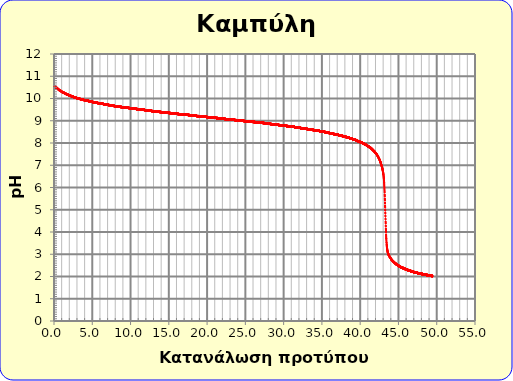
| Category | pH  |
|---|---|
| 0.0 | 10.567 |
| 0.013203698474220555 | 10.562 |
| 0.02640584125623714 | 10.557 |
| 0.039606428346038954 | 10.552 |
| 0.052805459743615196 | 10.552 |
| 0.06600293544895505 | 10.547 |
| 0.07919885546204772 | 10.547 |
| 0.0923932197828824 | 10.541 |
| 0.10558602841144826 | 10.547 |
| 0.11877728134773449 | 10.536 |
| 0.1319669785917303 | 10.536 |
| 0.1451551201434248 | 10.531 |
| 0.15834170600280723 | 10.536 |
| 0.17152673616986674 | 10.526 |
| 0.1847102106445925 | 10.526 |
| 0.19789212942697368 | 10.521 |
| 0.21107249251699944 | 10.521 |
| 0.22425129991465897 | 10.516 |
| 0.23742855161994142 | 10.511 |
| 0.25060424763283595 | 10.506 |
| 0.2637783879533317 | 10.5 |
| 0.2769509725814178 | 10.5 |
| 0.29012200151708345 | 10.5 |
| 0.30329147476031776 | 10.495 |
| 0.3164593923111099 | 10.485 |
| 0.32962575416944906 | 10.49 |
| 0.3427905603353243 | 10.48 |
| 0.35595381080872474 | 10.485 |
| 0.36911550558963957 | 10.475 |
| 0.3822756446780579 | 10.475 |
| 0.39543422807396894 | 10.465 |
| 0.4085912557773617 | 10.47 |
| 0.4217467277882254 | 10.465 |
| 0.4349006441065491 | 10.454 |
| 0.44805300473232196 | 10.454 |
| 0.46120380966553304 | 10.444 |
| 0.4743530589061715 | 10.449 |
| 0.48750075245422647 | 10.439 |
| 0.500646890309687 | 10.434 |
| 0.5137914724725423 | 10.439 |
| 0.5269344989427813 | 10.429 |
| 0.5400759697203933 | 10.429 |
| 0.5532158848053672 | 10.418 |
| 0.5663542441976923 | 10.418 |
| 0.5794910478973576 | 10.413 |
| 0.5926262959043522 | 10.413 |
| 0.6057599882186652 | 10.413 |
| 0.6188921248402856 | 10.403 |
| 0.6320227057692025 | 10.403 |
| 0.6451517310054051 | 10.398 |
| 0.6582792005488824 | 10.403 |
| 0.6714051143996236 | 10.398 |
| 0.6845294725576175 | 10.393 |
| 0.6976522750228534 | 10.393 |
| 0.7107735217953203 | 10.383 |
| 0.7238932128750072 | 10.383 |
| 0.7370113482619033 | 10.377 |
| 0.7501279279559975 | 10.372 |
| 0.763242951957279 | 10.372 |
| 0.7763564202657368 | 10.372 |
| 0.78946833288136 | 10.362 |
| 0.8025786898041375 | 10.362 |
| 0.8156874910340585 | 10.362 |
| 0.8287947365711119 | 10.357 |
| 0.841900426415287 | 10.357 |
| 0.8550045605665726 | 10.352 |
| 0.8681071390249578 | 10.347 |
| 0.8812081617904317 | 10.342 |
| 0.8943076288629832 | 10.342 |
| 0.9074055402426014 | 10.336 |
| 0.9205018959292754 | 10.336 |
| 0.9335966959229942 | 10.331 |
| 0.9466899402237468 | 10.331 |
| 0.9597816288315221 | 10.331 |
| 0.9728717617463092 | 10.321 |
| 0.9859603389680972 | 10.321 |
| 0.999047360496875 | 10.316 |
| 1.0121328263326317 | 10.311 |
| 1.0252167364753562 | 10.311 |
| 1.0382990909250376 | 10.311 |
| 1.0513798896816648 | 10.306 |
| 1.0644591327452269 | 10.306 |
| 1.0775368201157127 | 10.301 |
| 1.0906129517931116 | 10.301 |
| 1.1036875277774123 | 10.295 |
| 1.1167605480686038 | 10.295 |
| 1.129832012666675 | 10.29 |
| 1.142901921571615 | 10.285 |
| 1.1559702747834129 | 10.29 |
| 1.1690370723020573 | 10.285 |
| 1.1821023141275375 | 10.29 |
| 1.1951660002598425 | 10.285 |
| 1.2082281306989613 | 10.28 |
| 1.2212887054448827 | 10.28 |
| 1.2343477244975956 | 10.275 |
| 1.247405187857089 | 10.28 |
| 1.260461095523352 | 10.27 |
| 1.2735154474963735 | 10.27 |
| 1.2865682437761423 | 10.265 |
| 1.2996194843626476 | 10.265 |
| 1.312669169255878 | 10.26 |
| 1.3257172984558228 | 10.26 |
| 1.3387638719624708 | 10.26 |
| 1.351808889775811 | 10.26 |
| 1.3648523518958322 | 10.26 |
| 1.3778942583225235 | 10.249 |
| 1.3909346090558738 | 10.249 |
| 1.403973404095872 | 10.249 |
| 1.417010643442507 | 10.239 |
| 1.4300463270957675 | 10.239 |
| 1.4430804550556429 | 10.244 |
| 1.4561130273221217 | 10.244 |
| 1.469144043895193 | 10.239 |
| 1.4821735047748459 | 10.239 |
| 1.4952014099610689 | 10.229 |
| 1.5082277594538511 | 10.229 |
| 1.5212525532531815 | 10.224 |
| 1.534275791359049 | 10.229 |
| 1.5472974737714424 | 10.224 |
| 1.5603176004903507 | 10.219 |
| 1.5733361715157628 | 10.219 |
| 1.5863531868476675 | 10.219 |
| 1.5993686464860535 | 10.213 |
| 1.61238255043091 | 10.213 |
| 1.6253948986822258 | 10.208 |
| 1.6384056912399896 | 10.208 |
| 1.6514149281041905 | 10.208 |
| 1.6644226092748173 | 10.203 |
| 1.677428734751859 | 10.203 |
| 1.6904333045353044 | 10.198 |
| 1.7034363186251422 | 10.193 |
| 1.7164377770213615 | 10.203 |
| 1.729437679723951 | 10.193 |
| 1.7424360267328998 | 10.193 |
| 1.7554328180481964 | 10.188 |
| 1.7684280536698298 | 10.188 |
| 1.7814217335977889 | 10.183 |
| 1.7944138578320625 | 10.183 |
| 1.8074044263726396 | 10.188 |
| 1.820393439219509 | 10.178 |
| 1.8333808963726592 | 10.183 |
| 1.8463667978320795 | 10.178 |
| 1.8593511435977585 | 10.178 |
| 1.8723339336696851 | 10.178 |
| 1.8853151680478482 | 10.167 |
| 1.8982948467322365 | 10.167 |
| 1.9112729697228388 | 10.162 |
| 1.924249537019644 | 10.162 |
| 1.937224548622641 | 10.162 |
| 1.9501980045318184 | 10.162 |
| 1.9631699047471651 | 10.162 |
| 1.9761402492686702 | 10.157 |
| 1.9891090380963221 | 10.152 |
| 2.0020762712301097 | 10.152 |
| 2.015041948670022 | 10.157 |
| 2.028006070416048 | 10.152 |
| 2.040968636468176 | 10.147 |
| 2.053929646826395 | 10.147 |
| 2.0668891014906934 | 10.147 |
| 2.0798470004610605 | 10.147 |
| 2.092803343737485 | 10.147 |
| 2.1057581313199556 | 10.137 |
| 2.1187113632084613 | 10.137 |
| 2.1316630394029907 | 10.131 |
| 2.1446131599035323 | 10.137 |
| 2.1575617247100753 | 10.137 |
| 2.1705087338226083 | 10.126 |
| 2.18345418724112 | 10.131 |
| 2.1963980849655997 | 10.121 |
| 2.2093404269960355 | 10.121 |
| 2.2222812133324163 | 10.121 |
| 2.2352204439747307 | 10.121 |
| 2.248158118922968 | 10.121 |
| 2.2610942381771166 | 10.116 |
| 2.2740288017371655 | 10.116 |
| 2.286961809603103 | 10.111 |
| 2.299893261774918 | 10.111 |
| 2.3128231582525998 | 10.111 |
| 2.3257514990361363 | 10.116 |
| 2.3386782841255167 | 10.111 |
| 2.3516035135207294 | 10.106 |
| 2.3645271872217637 | 10.111 |
| 2.3774493052286076 | 10.106 |
| 2.3903698675412506 | 10.101 |
| 2.403288874159681 | 10.101 |
| 2.4162063250838877 | 10.095 |
| 2.429122220313859 | 10.095 |
| 2.4420365598495843 | 10.095 |
| 2.4549493436910517 | 10.09 |
| 2.46786057183825 | 10.09 |
| 2.4807702442911683 | 10.09 |
| 2.493678361049795 | 10.095 |
| 2.5065849221141185 | 10.085 |
| 2.5194899274841283 | 10.085 |
| 2.532393377159812 | 10.085 |
| 2.5452952711411596 | 10.08 |
| 2.5581956094281586 | 10.085 |
| 2.5710943920207985 | 10.085 |
| 2.5839916189190677 | 10.075 |
| 2.5968872901229547 | 10.08 |
| 2.6097814056324484 | 10.08 |
| 2.6226739654475377 | 10.075 |
| 2.6355649695682106 | 10.07 |
| 2.6484544179944565 | 10.075 |
| 2.6613423107262637 | 10.07 |
| 2.674228647763621 | 10.065 |
| 2.6871134291065166 | 10.065 |
| 2.6999966547549397 | 10.07 |
| 2.712878324708879 | 10.065 |
| 2.7257584389683225 | 10.065 |
| 2.7386369975332596 | 10.065 |
| 2.7515140004036787 | 10.06 |
| 2.7643894475795685 | 10.055 |
| 2.7772633390609176 | 10.055 |
| 2.7901356748477144 | 10.055 |
| 2.803006454939948 | 10.049 |
| 2.8158756793376063 | 10.055 |
| 2.8287433480406787 | 10.055 |
| 2.8416094610491536 | 10.049 |
| 2.8544740183630193 | 10.049 |
| 2.8673370199822648 | 10.049 |
| 2.8801984659068784 | 10.049 |
| 2.8930583561368493 | 10.044 |
| 2.9059166906721656 | 10.039 |
| 2.918773469512816 | 10.039 |
| 2.9316286926587893 | 10.039 |
| 2.944482360110074 | 10.044 |
| 2.9573344718666585 | 10.039 |
| 2.970185027928532 | 10.034 |
| 2.983034028295682 | 10.034 |
| 2.9958814729680983 | 10.034 |
| 3.008727361945769 | 10.029 |
| 3.0215716952286824 | 10.029 |
| 3.0344144728168274 | 10.029 |
| 3.0472556947101923 | 10.024 |
| 3.060095360908766 | 10.034 |
| 3.072933471412537 | 10.029 |
| 3.085770026221494 | 10.024 |
| 3.098605025335625 | 10.029 |
| 3.1114384687549195 | 10.019 |
| 3.1242703564793657 | 10.019 |
| 3.137100688508952 | 10.024 |
| 3.149929464843667 | 10.024 |
| 3.162756685483499 | 10.024 |
| 3.1755823504284373 | 10.014 |
| 3.1884064596784696 | 10.014 |
| 3.201229013233585 | 10.014 |
| 3.214050011093772 | 10.014 |
| 3.226869453259019 | 10.008 |
| 3.2396873397293144 | 10.008 |
| 3.2525036705046473 | 10.008 |
| 3.265318445585006 | 10.003 |
| 3.2781316649703784 | 10.003 |
| 3.2909433286607537 | 10.003 |
| 3.3037534366561205 | 10.003 |
| 3.316561988956467 | 10.003 |
| 3.329368985561782 | 10.003 |
| 3.3421744264720536 | 10.003 |
| 3.3549783116872707 | 9.998 |
| 3.3677806412074216 | 9.998 |
| 3.380581415032495 | 9.993 |
| 3.3933806331624794 | 9.993 |
| 3.406178295597363 | 9.993 |
| 3.4189744023371347 | 9.993 |
| 3.431768953381783 | 9.988 |
| 3.444561948731296 | 9.998 |
| 3.4573533883856626 | 9.993 |
| 3.4701432723448713 | 9.988 |
| 3.4829316006089104 | 9.993 |
| 3.4957183731777683 | 9.988 |
| 3.5085035900514336 | 9.988 |
| 3.5212872512298947 | 9.983 |
| 3.53406935671314 | 9.983 |
| 3.5468499065011585 | 9.983 |
| 3.559628900593938 | 9.978 |
| 3.5724063389914673 | 9.978 |
| 3.585182221693735 | 9.988 |
| 3.5979565487007292 | 9.978 |
| 3.610729320012439 | 9.973 |
| 3.623500535628852 | 9.973 |
| 3.6362701955499572 | 9.973 |
| 3.649038299775743 | 9.978 |
| 3.661804848306198 | 9.973 |
| 3.67456984114131 | 9.967 |
| 3.687333278281068 | 9.973 |
| 3.7000951597254605 | 9.973 |
| 3.712855485474476 | 9.967 |
| 3.7256142555281024 | 9.967 |
| 3.738371469886329 | 9.967 |
| 3.751127128549143 | 9.967 |
| 3.763881231516534 | 9.962 |
| 3.7766337787884896 | 9.962 |
| 3.789384770364999 | 9.962 |
| 3.80213420624605 | 9.957 |
| 3.8148820864316315 | 9.957 |
| 3.8276284109217316 | 9.962 |
| 3.8403731797163383 | 9.957 |
| 3.8531163928154406 | 9.952 |
| 3.865858050219027 | 9.952 |
| 3.8785981519270853 | 9.952 |
| 3.8913366979396047 | 9.952 |
| 3.904073688256573 | 9.952 |
| 3.9168091228779787 | 9.952 |
| 3.92954300180381 | 9.947 |
| 3.942275325034056 | 9.952 |
| 3.9550060925687047 | 9.947 |
| 3.967735304407744 | 9.942 |
| 3.980462960551163 | 9.952 |
| 3.99318906099895 | 9.947 |
| 4.0059136057510925 | 9.942 |
| 4.01863659480758 | 9.947 |
| 4.0313580281684 | 9.937 |
| 4.044077905833541 | 9.942 |
| 4.056796227802993 | 9.942 |
| 4.069512994076742 | 9.942 |
| 4.082228204654778 | 9.937 |
| 4.094941859537088 | 9.942 |
| 4.107653958723661 | 9.937 |
| 4.120364502214486 | 9.931 |
| 4.133073490009551 | 9.931 |
| 4.145780922108844 | 9.931 |
| 4.158486798512353 | 9.931 |
| 4.171191119220067 | 9.937 |
| 4.183893884231974 | 9.931 |
| 4.196595093548063 | 9.931 |
| 4.209294747168321 | 9.926 |
| 4.221992845092737 | 9.926 |
| 4.2346893873213 | 9.921 |
| 4.247384373853998 | 9.926 |
| 4.260077804690819 | 9.926 |
| 4.272769679831751 | 9.921 |
| 4.285459999276783 | 9.916 |
| 4.298148763025902 | 9.921 |
| 4.310835971079099 | 9.921 |
| 4.32352162343636 | 9.916 |
| 4.336205720097674 | 9.916 |
| 4.348888261063029 | 9.916 |
| 4.361569246332413 | 9.911 |
| 4.3742486759058155 | 9.911 |
| 4.386926549783224 | 9.916 |
| 4.399602867964627 | 9.916 |
| 4.412277630450013 | 9.911 |
| 4.424950837239369 | 9.906 |
| 4.437622488332685 | 9.906 |
| 4.450292583729948 | 9.911 |
| 4.462961123431147 | 9.911 |
| 4.47562810743627 | 9.901 |
| 4.4882935357453055 | 9.911 |
| 4.500957408358242 | 9.906 |
| 4.513619725275067 | 9.901 |
| 4.526280486495769 | 9.906 |
| 4.538939692020336 | 9.906 |
| 4.551597341848757 | 9.901 |
| 4.56425343598102 | 9.906 |
| 4.5769079744171135 | 9.896 |
| 4.589560957157025 | 9.896 |
| 4.602212384200743 | 9.896 |
| 4.614862255548256 | 9.89 |
| 4.627510571199552 | 9.89 |
| 4.640157331154619 | 9.896 |
| 4.6528025354134455 | 9.89 |
| 4.66544618397602 | 9.89 |
| 4.678088276842331 | 9.885 |
| 4.690728814012366 | 9.89 |
| 4.7033677954861135 | 9.885 |
| 4.716005221263561 | 9.885 |
| 4.728641091344698 | 9.885 |
| 4.741275405729511 | 9.885 |
| 4.75390816441799 | 9.885 |
| 4.766539367410123 | 9.88 |
| 4.7791690147058965 | 9.88 |
| 4.7917971063053 | 9.885 |
| 4.804423642208323 | 9.88 |
| 4.817048622414951 | 9.88 |
| 4.829672046925174 | 9.875 |
| 4.84229391573898 | 9.88 |
| 4.854914228856357 | 9.88 |
| 4.8675329862772925 | 9.875 |
| 4.8801501880017755 | 9.87 |
| 4.8927658340297935 | 9.87 |
| 4.905379924361335 | 9.875 |
| 4.917992458996388 | 9.87 |
| 4.930603437934941 | 9.87 |
| 4.943212861176982 | 9.87 |
| 4.955820728722499 | 9.87 |
| 4.9684270405714805 | 9.865 |
| 4.981031796723915 | 9.865 |
| 4.9936349971797895 | 9.865 |
| 5.006236641939093 | 9.87 |
| 5.018836731001814 | 9.865 |
| 5.03143526436794 | 9.87 |
| 5.044032242037459 | 9.86 |
| 5.056627664010359 | 9.86 |
| 5.0692215302866295 | 9.865 |
| 5.081813840866257 | 9.86 |
| 5.09440459574923 | 9.855 |
| 5.106993794935537 | 9.86 |
| 5.119581438425166 | 9.855 |
| 5.132167526218105 | 9.855 |
| 5.144752058314342 | 9.855 |
| 5.157335034713866 | 9.855 |
| 5.169916455416664 | 9.86 |
| 5.182496320422725 | 9.855 |
| 5.195074629732036 | 9.855 |
| 5.2076513833445865 | 9.85 |
| 5.220226581260364 | 9.85 |
| 5.232800223479356 | 9.85 |
| 5.245372310001551 | 9.844 |
| 5.257942840826938 | 9.85 |
| 5.270511815955503 | 9.85 |
| 5.283079235387236 | 9.844 |
| 5.295645099122124 | 9.85 |
| 5.308209407160156 | 9.839 |
| 5.3207721595013195 | 9.839 |
| 5.333333356145602 | 9.839 |
| 5.345892997092993 | 9.85 |
| 5.358451082343479 | 9.839 |
| 5.371007611897049 | 9.839 |
| 5.383562585753691 | 9.839 |
| 5.396116003913393 | 9.839 |
| 5.408667866376144 | 9.844 |
| 5.42121817314193 | 9.839 |
| 5.433766924210739 | 9.834 |
| 5.446314119582562 | 9.834 |
| 5.458859759257384 | 9.834 |
| 5.471403843235195 | 9.839 |
| 5.483946371515982 | 9.829 |
| 5.496487344099733 | 9.839 |
| 5.509026760986436 | 9.834 |
| 5.52156462217608 | 9.829 |
| 5.534100927668653 | 9.829 |
| 5.546635677464141 | 9.829 |
| 5.559168871562534 | 9.829 |
| 5.5717005099638195 | 9.824 |
| 5.584230592667986 | 9.829 |
| 5.59675911967502 | 9.829 |
| 5.60928609098491 | 9.824 |
| 5.621811506597646 | 9.819 |
| 5.634335366513214 | 9.824 |
| 5.646857670731602 | 9.819 |
| 5.659378419252798 | 9.824 |
| 5.6718976120767906 | 9.824 |
| 5.6844152492035676 | 9.819 |
| 5.6969313306331175 | 9.819 |
| 5.709445856365428 | 9.819 |
| 5.721958826400487 | 9.819 |
| 5.734470240738282 | 9.819 |
| 5.746980099378801 | 9.814 |
| 5.759488402322033 | 9.814 |
| 5.771995149567965 | 9.814 |
| 5.784500341116584 | 9.809 |
| 5.797003976967881 | 9.809 |
| 5.809506057121841 | 9.809 |
| 5.822006581578454 | 9.814 |
| 5.834505550337706 | 9.814 |
| 5.847002963399587 | 9.814 |
| 5.859498820764083 | 9.814 |
| 5.871993122431183 | 9.809 |
| 5.884485868400875 | 9.809 |
| 5.896977058673148 | 9.809 |
| 5.909466693247987 | 9.803 |
| 5.921954772125383 | 9.803 |
| 5.934441295305322 | 9.798 |
| 5.946926262787793 | 9.798 |
| 5.9594096745727825 | 9.803 |
| 5.97189153066028 | 9.798 |
| 5.9843718310502725 | 9.803 |
| 5.996850575742748 | 9.798 |
| 6.009327764737694 | 9.798 |
| 6.0218033980351 | 9.798 |
| 6.034277475634953 | 9.793 |
| 6.0467499975372405 | 9.798 |
| 6.059220963741951 | 9.793 |
| 6.071690374249072 | 9.793 |
| 6.084158229058591 | 9.793 |
| 6.096624528170497 | 9.793 |
| 6.109089271584777 | 9.788 |
| 6.121552459301419 | 9.788 |
| 6.13401409132041 | 9.788 |
| 6.14647416764174 | 9.793 |
| 6.158932688265396 | 9.788 |
| 6.1713896531913655 | 9.783 |
| 6.183845062419636 | 9.788 |
| 6.196298915950196 | 9.783 |
| 6.208751213783033 | 9.788 |
| 6.2212019559181355 | 9.783 |
| 6.233651142355491 | 9.783 |
| 6.246098773095087 | 9.778 |
| 6.258544848136912 | 9.783 |
| 6.270989367480954 | 9.778 |
| 6.2834323311272 | 9.778 |
| 6.295873739075637 | 9.778 |
| 6.308313591326256 | 9.778 |
| 6.320751887879042 | 9.778 |
| 6.333188628733984 | 9.783 |
| 6.345623813891069 | 9.778 |
| 6.358057443350286 | 9.778 |
| 6.370489517111621 | 9.773 |
| 6.382920035175064 | 9.778 |
| 6.3953489975406015 | 9.773 |
| 6.407776404208222 | 9.773 |
| 6.420202255177912 | 9.768 |
| 6.432626550449661 | 9.768 |
| 6.445049290023456 | 9.768 |
| 6.457470473899285 | 9.773 |
| 6.4698901020771356 | 9.768 |
| 6.482308174556995 | 9.768 |
| 6.4947246913388526 | 9.768 |
| 6.507139652422695 | 9.768 |
| 6.51955305780851 | 9.762 |
| 6.5319649074962856 | 9.768 |
| 6.54437520148601 | 9.762 |
| 6.556783939777669 | 9.768 |
| 6.569191122371254 | 9.757 |
| 6.581596749266749 | 9.768 |
| 6.594000820464144 | 9.757 |
| 6.606403335963426 | 9.762 |
| 6.618804295764583 | 9.757 |
| 6.631203699867603 | 9.757 |
| 6.643601548272474 | 9.752 |
| 6.6559978409791825 | 9.757 |
| 6.668392577987717 | 9.752 |
| 6.6807857592980655 | 9.752 |
| 6.693177384910215 | 9.752 |
| 6.705567454824155 | 9.752 |
| 6.7179559690398705 | 9.747 |
| 6.730342927557351 | 9.747 |
| 6.742728330376584 | 9.747 |
| 6.7551121774975575 | 9.752 |
| 6.767494468920259 | 9.747 |
| 6.779875204644676 | 9.747 |
| 6.792254384670796 | 9.747 |
| 6.804632008998608 | 9.747 |
| 6.817008077628098 | 9.742 |
| 6.829382590559255 | 9.747 |
| 6.841755547792065 | 9.742 |
| 6.854126949326518 | 9.742 |
| 6.8664967951626 | 9.737 |
| 6.8788650853002995 | 9.742 |
| 6.891231819739604 | 9.737 |
| 6.9035969984805 | 9.742 |
| 6.915960621522978 | 9.742 |
| 6.9283226888670235 | 9.737 |
| 6.940683200512624 | 9.737 |
| 6.953042156459769 | 9.742 |
| 6.965399556708444 | 9.737 |
| 6.977755401258639 | 9.737 |
| 6.99010969011034 | 9.732 |
| 7.002462423263535 | 9.737 |
| 7.014813600718211 | 9.732 |
| 7.027163222474357 | 9.726 |
| 7.03951128853196 | 9.726 |
| 7.051857798891008 | 9.732 |
| 7.064202753551488 | 9.732 |
| 7.076546152513388 | 9.726 |
| 7.0888879957766955 | 9.732 |
| 7.101228283341398 | 9.726 |
| 7.113567015207484 | 9.732 |
| 7.12590419137494 | 9.721 |
| 7.1382398118437544 | 9.721 |
| 7.150573876613914 | 9.726 |
| 7.1629063856854085 | 9.726 |
| 7.175237339058223 | 9.726 |
| 7.187566736732347 | 9.721 |
| 7.199894578707767 | 9.721 |
| 7.21222086498447 | 9.716 |
| 7.224545595562446 | 9.716 |
| 7.23686877044168 | 9.716 |
| 7.249190389622161 | 9.716 |
| 7.2615104531038766 | 9.721 |
| 7.273828960886814 | 9.721 |
| 7.2861459129709605 | 9.716 |
| 7.298461309356305 | 9.716 |
| 7.310775150042834 | 9.721 |
| 7.323087435030534 | 9.711 |
| 7.335398164319395 | 9.716 |
| 7.347707337909403 | 9.711 |
| 7.360014955800547 | 9.711 |
| 7.372321017992813 | 9.711 |
| 7.384625524486189 | 9.716 |
| 7.396928475280663 | 9.706 |
| 7.409229870376222 | 9.716 |
| 7.421529709772853 | 9.711 |
| 7.433827993470546 | 9.706 |
| 7.446124721469286 | 9.706 |
| 7.4584198937690624 | 9.706 |
| 7.470713510369861 | 9.706 |
| 7.48300557127167 | 9.711 |
| 7.495296076474478 | 9.711 |
| 7.507585025978272 | 9.711 |
| 7.519872419783038 | 9.706 |
| 7.532158257888765 | 9.701 |
| 7.5444425402954405 | 9.701 |
| 7.556725267003052 | 9.706 |
| 7.569006438011586 | 9.706 |
| 7.581286053321032 | 9.701 |
| 7.593564112931375 | 9.696 |
| 7.605840616842605 | 9.701 |
| 7.618115565054708 | 9.701 |
| 7.630388957567672 | 9.701 |
| 7.642660794381484 | 9.696 |
| 7.654931075496132 | 9.696 |
| 7.667199800911604 | 9.696 |
| 7.679466970627886 | 9.691 |
| 7.691732584644967 | 9.696 |
| 7.703996642962834 | 9.691 |
| 7.716259145581474 | 9.696 |
| 7.728520092500875 | 9.691 |
| 7.740779483721024 | 9.691 |
| 7.753037319241908 | 9.691 |
| 7.765293599063517 | 9.691 |
| 7.777548323185836 | 9.685 |
| 7.789801491608853 | 9.685 |
| 7.802053104332556 | 9.685 |
| 7.814303161356931 | 9.691 |
| 7.826551662681967 | 9.685 |
| 7.838798608307651 | 9.691 |
| 7.851043998233971 | 9.685 |
| 7.863287832460913 | 9.691 |
| 7.875530110988466 | 9.68 |
| 7.887770833816616 | 9.685 |
| 7.900010000945352 | 9.685 |
| 7.912247612374661 | 9.68 |
| 7.924483668104529 | 9.68 |
| 7.936718168134945 | 9.68 |
| 7.948951112465896 | 9.68 |
| 7.96118250109737 | 9.68 |
| 7.973412334029352 | 9.68 |
| 7.985640611261832 | 9.675 |
| 7.997867332794797 | 9.675 |
| 8.010092498628234 | 9.675 |
| 8.02231610876213 | 9.675 |
| 8.034538163196473 | 9.68 |
| 8.04675866193125 | 9.675 |
| 8.058977604966449 | 9.68 |
| 8.071194992302056 | 9.675 |
| 8.08341082393806 | 9.675 |
| 8.095625099874447 | 9.67 |
| 8.107837820111206 | 9.675 |
| 8.120048984648323 | 9.67 |
| 8.132258593485785 | 9.67 |
| 8.14446664662358 | 9.67 |
| 8.156673144061697 | 9.665 |
| 8.168878085800122 | 9.67 |
| 8.181081471838842 | 9.665 |
| 8.193283302177845 | 9.67 |
| 8.205483576817118 | 9.665 |
| 8.217682295756648 | 9.665 |
| 8.229879458996423 | 9.665 |
| 8.242075066536431 | 9.665 |
| 8.254269118376659 | 9.665 |
| 8.266461614517093 | 9.67 |
| 8.27865255495772 | 9.66 |
| 8.29084193969853 | 9.665 |
| 8.303029768739506 | 9.665 |
| 8.31521604208064 | 9.66 |
| 8.327400759721918 | 9.665 |
| 8.339583921663326 | 9.66 |
| 8.351765527904853 | 9.66 |
| 8.363945578446485 | 9.66 |
| 8.376124073288208 | 9.66 |
| 8.388301012430013 | 9.655 |
| 8.400476395871884 | 9.66 |
| 8.41265022361381 | 9.665 |
| 8.424822495655778 | 9.65 |
| 8.436993211997775 | 9.66 |
| 8.449162372639789 | 9.65 |
| 8.461329977581807 | 9.655 |
| 8.473496026823815 | 9.655 |
| 8.485660520365801 | 9.65 |
| 8.497823458207755 | 9.65 |
| 8.509984840349661 | 9.65 |
| 8.522144666791506 | 9.655 |
| 8.53430293753328 | 9.655 |
| 8.546459652574967 | 9.645 |
| 8.558614811916557 | 9.655 |
| 8.570768415558037 | 9.645 |
| 8.582920463499393 | 9.65 |
| 8.595070955740612 | 9.645 |
| 8.607219892281682 | 9.65 |
| 8.61936727312259 | 9.645 |
| 8.631513098263325 | 9.65 |
| 8.643657367703872 | 9.645 |
| 8.655800081444218 | 9.639 |
| 8.667941239484351 | 9.639 |
| 8.68008084182426 | 9.639 |
| 8.69221888846393 | 9.645 |
| 8.70435537940335 | 9.645 |
| 8.716490314642504 | 9.639 |
| 8.728623694181382 | 9.645 |
| 8.74075551801997 | 9.639 |
| 8.752885786158256 | 9.645 |
| 8.765014498596226 | 9.634 |
| 8.77714165533387 | 9.639 |
| 8.789267256371172 | 9.639 |
| 8.80139130170812 | 9.634 |
| 8.813513791344704 | 9.639 |
| 8.825634725280908 | 9.634 |
| 8.837754103516719 | 9.634 |
| 8.849871926052126 | 9.639 |
| 8.861988192887114 | 9.634 |
| 8.874102904021674 | 9.639 |
| 8.88621605945579 | 9.629 |
| 8.89832765918945 | 9.629 |
| 8.910437703222641 | 9.634 |
| 8.92254619155535 | 9.629 |
| 8.934653124187564 | 9.624 |
| 8.946758501119271 | 9.634 |
| 8.958862322350459 | 9.624 |
| 8.970964587881113 | 9.634 |
| 8.98306529771122 | 9.624 |
| 8.99516445184077 | 9.629 |
| 9.007262050269748 | 9.629 |
| 9.019358092998141 | 9.629 |
| 9.031452580025936 | 9.629 |
| 9.043545511353122 | 9.624 |
| 9.055636886979684 | 9.624 |
| 9.06772670690561 | 9.634 |
| 9.079814971130887 | 9.629 |
| 9.091901679655502 | 9.624 |
| 9.103986832479443 | 9.624 |
| 9.116070429602695 | 9.629 |
| 9.128152471025247 | 9.624 |
| 9.140232956747086 | 9.624 |
| 9.1523118867682 | 9.624 |
| 9.164389261088573 | 9.624 |
| 9.176465079708194 | 9.624 |
| 9.18853934262705 | 9.624 |
| 9.20061204984513 | 9.619 |
| 9.212683201362418 | 9.614 |
| 9.224752797178903 | 9.619 |
| 9.236820837294571 | 9.624 |
| 9.24888732170941 | 9.619 |
| 9.260952250423404 | 9.624 |
| 9.273015623436544 | 9.614 |
| 9.285077440748816 | 9.619 |
| 9.297137702360207 | 9.619 |
| 9.309196408270703 | 9.614 |
| 9.321253558480292 | 9.614 |
| 9.333309152988962 | 9.614 |
| 9.345363191796698 | 9.619 |
| 9.35741567490349 | 9.614 |
| 9.36946660230932 | 9.619 |
| 9.38151597401418 | 9.609 |
| 9.393563790018055 | 9.619 |
| 9.40561005032093 | 9.609 |
| 9.417654754922797 | 9.609 |
| 9.429697903823639 | 9.614 |
| 9.441739497023445 | 9.614 |
| 9.4537795345222 | 9.609 |
| 9.465818016319892 | 9.609 |
| 9.477854942416508 | 9.609 |
| 9.489890312812037 | 9.614 |
| 9.501924127506463 | 9.604 |
| 9.513956386499775 | 9.604 |
| 9.525987089791958 | 9.604 |
| 9.538016237383 | 9.604 |
| 9.550043829272887 | 9.609 |
| 9.56206986546161 | 9.604 |
| 9.57409434594915 | 9.604 |
| 9.5861172707355 | 9.604 |
| 9.598138639820643 | 9.604 |
| 9.610158453204567 | 9.598 |
| 9.62217671088726 | 9.598 |
| 9.634193412868708 | 9.598 |
| 9.646208559148898 | 9.598 |
| 9.658222149727816 | 9.604 |
| 9.67023418460545 | 9.598 |
| 9.682244663781788 | 9.598 |
| 9.694253587256815 | 9.593 |
| 9.706260955030519 | 9.598 |
| 9.718266767102886 | 9.593 |
| 9.730271023473904 | 9.598 |
| 9.74227372414356 | 9.593 |
| 9.75427486911184 | 9.593 |
| 9.766274458378733 | 9.593 |
| 9.778272491944223 | 9.593 |
| 9.790268969808299 | 9.598 |
| 9.802263891970947 | 9.588 |
| 9.814257258432153 | 9.593 |
| 9.826249069191906 | 9.593 |
| 9.838239324250193 | 9.588 |
| 9.850228023606999 | 9.593 |
| 9.862215167262312 | 9.593 |
| 9.874200755216117 | 9.588 |
| 9.886184787468403 | 9.583 |
| 9.898167264019158 | 9.588 |
| 9.910148184868365 | 9.583 |
| 9.922127550016015 | 9.588 |
| 9.934105359462093 | 9.588 |
| 9.946081613206585 | 9.588 |
| 9.95805631124948 | 9.583 |
| 9.970029453590763 | 9.583 |
| 9.982001040230422 | 9.583 |
| 9.993971071168444 | 9.583 |
| 10.005939546404814 | 9.583 |
| 10.017906465939522 | 9.578 |
| 10.029871829772551 | 9.578 |
| 10.04183563790389 | 9.583 |
| 10.053797890333527 | 9.583 |
| 10.065758587061447 | 9.578 |
| 10.077717728087638 | 9.578 |
| 10.089675313412085 | 9.578 |
| 10.101631343034777 | 9.578 |
| 10.1135858169557 | 9.578 |
| 10.12553873517484 | 9.578 |
| 10.137490097692185 | 9.573 |
| 10.149439904507721 | 9.583 |
| 10.161388155621436 | 9.573 |
| 10.173334851033315 | 9.573 |
| 10.185279990743346 | 9.573 |
| 10.197223574751517 | 9.573 |
| 10.209165603057812 | 9.573 |
| 10.22110607566222 | 9.578 |
| 10.233044992564727 | 9.573 |
| 10.24498235376532 | 9.568 |
| 10.256918159263984 | 9.573 |
| 10.268852409060708 | 9.573 |
| 10.280785103155479 | 9.573 |
| 10.292716241548282 | 9.568 |
| 10.304645824239104 | 9.568 |
| 10.316573851227934 | 9.578 |
| 10.328500322514756 | 9.568 |
| 10.34042523809956 | 9.563 |
| 10.35234859798233 | 9.563 |
| 10.364270402163053 | 9.568 |
| 10.376190650641716 | 9.573 |
| 10.388109343418307 | 9.563 |
| 10.400026480492812 | 9.563 |
| 10.411942061865217 | 9.563 |
| 10.423856087535508 | 9.563 |
| 10.435768557503675 | 9.563 |
| 10.447679471769701 | 9.563 |
| 10.459588830333576 | 9.557 |
| 10.471496633195285 | 9.563 |
| 10.483402880354815 | 9.557 |
| 10.495307571812152 | 9.557 |
| 10.507210707567284 | 9.563 |
| 10.519112287620196 | 9.557 |
| 10.531012311970876 | 9.557 |
| 10.54291078061931 | 9.557 |
| 10.554807693565486 | 9.552 |
| 10.56670305080939 | 9.557 |
| 10.57859685235101 | 9.557 |
| 10.59048909819033 | 9.552 |
| 10.602379788327339 | 9.557 |
| 10.61426892276202 | 9.563 |
| 10.626156501494364 | 9.557 |
| 10.638042524524357 | 9.552 |
| 10.649926991851984 | 9.557 |
| 10.661809903477232 | 9.557 |
| 10.673691259400089 | 9.552 |
| 10.685571059620539 | 9.557 |
| 10.697449304138571 | 9.547 |
| 10.709325992954172 | 9.547 |
| 10.721201126067326 | 9.547 |
| 10.733074703478023 | 9.552 |
| 10.744946725186248 | 9.547 |
| 10.756817191191987 | 9.547 |
| 10.768686101495227 | 9.552 |
| 10.780553456095955 | 9.542 |
| 10.792419254994158 | 9.552 |
| 10.804283498189822 | 9.542 |
| 10.816146185682934 | 9.542 |
| 10.82800731747348 | 9.542 |
| 10.839866893561446 | 9.547 |
| 10.85172491394682 | 9.542 |
| 10.863581378629588 | 9.542 |
| 10.875436287609737 | 9.547 |
| 10.887289640887255 | 9.547 |
| 10.899141438462125 | 9.542 |
| 10.910991680334337 | 9.542 |
| 10.922840366503877 | 9.537 |
| 10.93468749697073 | 9.537 |
| 10.946533071734883 | 9.542 |
| 10.958377090796324 | 9.542 |
| 10.970219554155038 | 9.537 |
| 10.982060461811013 | 9.537 |
| 10.993899813764234 | 9.537 |
| 11.005737610014688 | 9.537 |
| 11.01757385056236 | 9.537 |
| 11.02940853540724 | 9.537 |
| 11.041241664549315 | 9.532 |
| 11.053073237988567 | 9.532 |
| 11.064903255724985 | 9.537 |
| 11.076731717758557 | 9.537 |
| 11.088558624089268 | 9.537 |
| 11.100383974717104 | 9.537 |
| 11.112207769642053 | 9.532 |
| 11.1240300088641 | 9.532 |
| 11.135850692383233 | 9.532 |
| 11.147669820199438 | 9.527 |
| 11.159487392312702 | 9.532 |
| 11.171303408723011 | 9.532 |
| 11.183117869430351 | 9.527 |
| 11.19493077443471 | 9.527 |
| 11.206742123736072 | 9.532 |
| 11.218551917334425 | 9.527 |
| 11.230360155229755 | 9.532 |
| 11.24216683742205 | 9.532 |
| 11.253971963911294 | 9.521 |
| 11.265775534697475 | 9.532 |
| 11.277577549780581 | 9.521 |
| 11.289378009160597 | 9.521 |
| 11.301176912837509 | 9.527 |
| 11.312974260811304 | 9.516 |
| 11.324770053081968 | 9.521 |
| 11.336564289649488 | 9.516 |
| 11.34835697051385 | 9.521 |
| 11.36014809567504 | 9.521 |
| 11.371937665133046 | 9.527 |
| 11.383725678887854 | 9.521 |
| 11.39551213693945 | 9.521 |
| 11.40729703928782 | 9.516 |
| 11.419080385932952 | 9.521 |
| 11.43086217687483 | 9.521 |
| 11.442642412113443 | 9.511 |
| 11.454421091648776 | 9.521 |
| 11.466198215480816 | 9.511 |
| 11.47797378360955 | 9.521 |
| 11.489747796034962 | 9.516 |
| 11.501520252757041 | 9.516 |
| 11.513291153775771 | 9.511 |
| 11.525060499091142 | 9.516 |
| 11.536828288703136 | 9.511 |
| 11.548594522611742 | 9.511 |
| 11.560359200816947 | 9.516 |
| 11.572122323318736 | 9.511 |
| 11.583883890117097 | 9.516 |
| 11.595643901212014 | 9.511 |
| 11.607402356603476 | 9.511 |
| 11.619159256291468 | 9.516 |
| 11.630914600275975 | 9.506 |
| 11.642668388556986 | 9.506 |
| 11.654420621134486 | 9.506 |
| 11.66617129800846 | 9.511 |
| 11.677920419178898 | 9.506 |
| 11.689667984645784 | 9.511 |
| 11.701413994409103 | 9.506 |
| 11.713158448468844 | 9.511 |
| 11.724901346824993 | 9.501 |
| 11.736642689477534 | 9.511 |
| 11.748382476426457 | 9.506 |
| 11.760120707671746 | 9.511 |
| 11.771857383213387 | 9.506 |
| 11.783592503051366 | 9.501 |
| 11.795326067185671 | 9.506 |
| 11.807058075616288 | 9.501 |
| 11.818788528343203 | 9.501 |
| 11.830517425366402 | 9.501 |
| 11.842244766685871 | 9.501 |
| 11.853970552301599 | 9.496 |
| 11.865694782213568 | 9.496 |
| 11.877417456421767 | 9.496 |
| 11.889138574926182 | 9.501 |
| 11.9008581377268 | 9.501 |
| 11.912576144823607 | 9.496 |
| 11.924292596216588 | 9.491 |
| 11.93600749190573 | 9.496 |
| 11.947720831891019 | 9.496 |
| 11.95943261617244 | 9.491 |
| 11.971142844749984 | 9.491 |
| 11.982851517623633 | 9.491 |
| 11.994558634793375 | 9.491 |
| 12.006264196259195 | 9.491 |
| 12.01796820202108 | 9.491 |
| 12.029670652079016 | 9.491 |
| 12.04137154643299 | 9.496 |
| 12.053070885082986 | 9.486 |
| 12.064768668028993 | 9.486 |
| 12.076464895270997 | 9.486 |
| 12.088159566808983 | 9.491 |
| 12.099852682642938 | 9.486 |
| 12.111544242772847 | 9.491 |
| 12.123234247198697 | 9.486 |
| 12.134922695920475 | 9.486 |
| 12.146609588938166 | 9.48 |
| 12.158294926251756 | 9.48 |
| 12.169978707861233 | 9.486 |
| 12.181660933766581 | 9.486 |
| 12.193341603967788 | 9.486 |
| 12.20502071846484 | 9.491 |
| 12.216698277257724 | 9.486 |
| 12.228374280346424 | 9.48 |
| 12.240048727730928 | 9.48 |
| 12.25172161941122 | 9.48 |
| 12.263392955387289 | 9.48 |
| 12.275062735659118 | 9.48 |
| 12.286730960226695 | 9.48 |
| 12.298397629090006 | 9.48 |
| 12.310062742249038 | 9.48 |
| 12.321726299703776 | 9.475 |
| 12.333388301454207 | 9.48 |
| 12.345048747500316 | 9.475 |
| 12.35670763784209 | 9.48 |
| 12.368364972479515 | 9.48 |
| 12.380020751412578 | 9.475 |
| 12.391674974641264 | 9.475 |
| 12.403327642165559 | 9.48 |
| 12.41497875398545 | 9.48 |
| 12.426628310100922 | 9.475 |
| 12.438276310511963 | 9.475 |
| 12.449922755218557 | 9.47 |
| 12.461567644220692 | 9.475 |
| 12.473210977518352 | 9.47 |
| 12.484852755111525 | 9.47 |
| 12.496492977000198 | 9.47 |
| 12.508131643184354 | 9.47 |
| 12.519768753663982 | 9.465 |
| 12.531404308439066 | 9.47 |
| 12.543038307509594 | 9.475 |
| 12.55467075087555 | 9.465 |
| 12.56630163853692 | 9.465 |
| 12.577930970493693 | 9.465 |
| 12.589558746745851 | 9.465 |
| 12.601184967293383 | 9.475 |
| 12.612809632136274 | 9.465 |
| 12.62443274127451 | 9.465 |
| 12.63605429470808 | 9.465 |
| 12.647674292436966 | 9.465 |
| 12.659292734461156 | 9.47 |
| 12.670909620780636 | 9.465 |
| 12.682524951395392 | 9.46 |
| 12.69413872630541 | 9.47 |
| 12.705750945510674 | 9.46 |
| 12.717361609011173 | 9.46 |
| 12.728970716806892 | 9.46 |
| 12.740578268897815 | 9.465 |
| 12.752184265283931 | 9.465 |
| 12.763788705965226 | 9.46 |
| 12.775391590941684 | 9.46 |
| 12.786992920213292 | 9.46 |
| 12.798592693780035 | 9.46 |
| 12.810190911641902 | 9.46 |
| 12.821787573798876 | 9.46 |
| 12.833382680250944 | 9.46 |
| 12.844976230998093 | 9.455 |
| 12.856568226040308 | 9.455 |
| 12.868158665377573 | 9.455 |
| 12.879747549009878 | 9.455 |
| 12.891334876937206 | 9.455 |
| 12.902920649159544 | 9.46 |
| 12.914504865676879 | 9.455 |
| 12.926087526489194 | 9.46 |
| 12.937668631596479 | 9.455 |
| 12.949248180998715 | 9.45 |
| 12.960826174695892 | 9.45 |
| 12.972402612687995 | 9.455 |
| 12.98397749497501 | 9.45 |
| 12.995550821556922 | 9.45 |
| 13.007122592433717 | 9.455 |
| 13.018692807605383 | 9.45 |
| 13.030261467071904 | 9.45 |
| 13.041828570833266 | 9.45 |
| 13.053394118889456 | 9.45 |
| 13.064958111240458 | 9.455 |
| 13.07652054788626 | 9.45 |
| 13.088081428826847 | 9.445 |
| 13.099640754062206 | 9.45 |
| 13.11119852359232 | 9.445 |
| 13.122754737417177 | 9.445 |
| 13.134309395536762 | 9.445 |
| 13.145862497951063 | 9.45 |
| 13.157414044660065 | 9.445 |
| 13.168964035663754 | 9.45 |
| 13.180512470962114 | 9.44 |
| 13.192059350555132 | 9.44 |
| 13.203604674442795 | 9.44 |
| 13.215148442625088 | 9.445 |
| 13.226690655101995 | 9.44 |
| 13.238231311873506 | 9.445 |
| 13.249770412939602 | 9.434 |
| 13.261307958300273 | 9.434 |
| 13.272843947955504 | 9.434 |
| 13.28437838190528 | 9.44 |
| 13.295911260149586 | 9.44 |
| 13.30744258268841 | 9.44 |
| 13.318972349521735 | 9.434 |
| 13.330500560649549 | 9.434 |
| 13.342027216071838 | 9.44 |
| 13.353552315788587 | 9.44 |
| 13.365075859799783 | 9.434 |
| 13.376597848105408 | 9.434 |
| 13.388118280705452 | 9.44 |
| 13.3996371575999 | 9.434 |
| 13.411154478788736 | 9.429 |
| 13.422670244271949 | 9.429 |
| 13.434184454049522 | 9.434 |
| 13.445697108121442 | 9.44 |
| 13.457208206487694 | 9.429 |
| 13.468717749148265 | 9.44 |
| 13.48022573610314 | 9.429 |
| 13.491732167352305 | 9.429 |
| 13.503237042895744 | 9.429 |
| 13.514740362733445 | 9.424 |
| 13.526242126865393 | 9.424 |
| 13.537742335291574 | 9.429 |
| 13.549240988011974 | 9.429 |
| 13.560738085026578 | 9.424 |
| 13.572233626335374 | 9.424 |
| 13.583727611938345 | 9.429 |
| 13.595220041835477 | 9.424 |
| 13.606710916026756 | 9.424 |
| 13.61820023451217 | 9.424 |
| 13.629687997291702 | 9.429 |
| 13.641174204365338 | 9.419 |
| 13.652658855733065 | 9.419 |
| 13.66414195139487 | 9.419 |
| 13.675623491350734 | 9.424 |
| 13.687103475600647 | 9.419 |
| 13.698581904144593 | 9.419 |
| 13.710058776982558 | 9.424 |
| 13.721534094114528 | 9.419 |
| 13.733007855540489 | 9.424 |
| 13.744480061260425 | 9.414 |
| 13.755950711274323 | 9.419 |
| 13.767419805582168 | 9.414 |
| 13.778887344183946 | 9.419 |
| 13.790353327079645 | 9.419 |
| 13.801817754269248 | 9.414 |
| 13.813280625752741 | 9.419 |
| 13.82474194153011 | 9.414 |
| 13.83620170160134 | 9.414 |
| 13.847659905966417 | 9.414 |
| 13.859116554625327 | 9.419 |
| 13.870571647578055 | 9.419 |
| 13.882025184824588 | 9.409 |
| 13.89347716636491 | 9.409 |
| 13.904927592199009 | 9.414 |
| 13.916376462326868 | 9.419 |
| 13.927823776748474 | 9.414 |
| 13.939269535463811 | 9.414 |
| 13.950713738472869 | 9.409 |
| 13.962156385775629 | 9.409 |
| 13.973597477372078 | 9.409 |
| 13.985037013262202 | 9.409 |
| 13.996474993445988 | 9.414 |
| 14.007911417923419 | 9.414 |
| 14.019346286694482 | 9.409 |
| 14.030779599759162 | 9.404 |
| 14.042211357117445 | 9.404 |
| 14.053641558769318 | 9.404 |
| 14.065070204714765 | 9.404 |
| 14.07649729495377 | 9.409 |
| 14.08792282948632 | 9.404 |
| 14.099346808312403 | 9.404 |
| 14.110769231432 | 9.409 |
| 14.1221900988451 | 9.404 |
| 14.133609410551689 | 9.404 |
| 14.145027166551749 | 9.404 |
| 14.156443366845268 | 9.399 |
| 14.167858011432232 | 9.399 |
| 14.179271100312626 | 9.404 |
| 14.190682633486436 | 9.399 |
| 14.202092610953645 | 9.399 |
| 14.213501032714243 | 9.399 |
| 14.224907898768212 | 9.404 |
| 14.236313209115538 | 9.399 |
| 14.247716963756208 | 9.399 |
| 14.259119162690206 | 9.399 |
| 14.270519805917518 | 9.404 |
| 14.28191889343813 | 9.399 |
| 14.293316425252026 | 9.393 |
| 14.304712401359193 | 9.404 |
| 14.316106821759616 | 9.399 |
| 14.327499686453281 | 9.393 |
| 14.338890995440174 | 9.393 |
| 14.350280748720278 | 9.399 |
| 14.361668946293582 | 9.393 |
| 14.373055588160069 | 9.393 |
| 14.384440674319725 | 9.393 |
| 14.395824204772536 | 9.388 |
| 14.407206179518486 | 9.388 |
| 14.418586598557562 | 9.399 |
| 14.429965461889749 | 9.393 |
| 14.441342769515032 | 9.399 |
| 14.452718521433397 | 9.399 |
| 14.46409271764483 | 9.388 |
| 14.475465358149314 | 9.388 |
| 14.486836442946839 | 9.393 |
| 14.498205972037386 | 9.388 |
| 14.509573945420943 | 9.388 |
| 14.520940363097493 | 9.393 |
| 14.532305225067024 | 9.388 |
| 14.54366853132952 | 9.388 |
| 14.555030281884966 | 9.393 |
| 14.566390476733348 | 9.393 |
| 14.577749115874653 | 9.388 |
| 14.589106199308864 | 9.388 |
| 14.600461727035968 | 9.388 |
| 14.611815699055951 | 9.388 |
| 14.623168115368797 | 9.383 |
| 14.63451897597449 | 9.383 |
| 14.64586828087302 | 9.383 |
| 14.657216030064367 | 9.388 |
| 14.66856222354852 | 9.388 |
| 14.679906861325462 | 9.388 |
| 14.69124994339518 | 9.378 |
| 14.702591469757659 | 9.378 |
| 14.713931440412884 | 9.383 |
| 14.72526985536084 | 9.388 |
| 14.736606714601514 | 9.378 |
| 14.74794201813489 | 9.383 |
| 14.759275765960952 | 9.378 |
| 14.770607958079689 | 9.378 |
| 14.781938594491084 | 9.378 |
| 14.793267675195123 | 9.383 |
| 14.804595200191791 | 9.378 |
| 14.815921169481074 | 9.378 |
| 14.827245583062956 | 9.378 |
| 14.838568440937422 | 9.378 |
| 14.849889743104459 | 9.378 |
| 14.861209489564052 | 9.373 |
| 14.872527680316185 | 9.378 |
| 14.883844315360845 | 9.373 |
| 14.895159394698016 | 9.373 |
| 14.906472918327685 | 9.378 |
| 14.917784886249835 | 9.368 |
| 14.929095298464453 | 9.378 |
| 14.940404154971525 | 9.373 |
| 14.951711455771033 | 9.373 |
| 14.963017200862964 | 9.373 |
| 14.974321390247304 | 9.373 |
| 14.98562402392404 | 9.368 |
| 14.996925101893153 | 9.373 |
| 15.00822462415463 | 9.373 |
| 15.019522590708458 | 9.373 |
| 15.03081900155462 | 9.368 |
| 15.042113856693103 | 9.368 |
| 15.05340715612389 | 9.368 |
| 15.064698899846968 | 9.373 |
| 15.075989087862322 | 9.368 |
| 15.087277720169936 | 9.368 |
| 15.098564796769798 | 9.368 |
| 15.109850317661891 | 9.363 |
| 15.121134282846201 | 9.368 |
| 15.132416692322712 | 9.368 |
| 15.14369754609141 | 9.373 |
| 15.15497684415228 | 9.363 |
| 15.166254586505309 | 9.363 |
| 15.17753077315048 | 9.368 |
| 15.188805404087779 | 9.368 |
| 15.20007847931719 | 9.363 |
| 15.2113499988387 | 9.368 |
| 15.222619962652294 | 9.363 |
| 15.233888370757956 | 9.357 |
| 15.245155223155672 | 9.357 |
| 15.256420519845427 | 9.357 |
| 15.267684260827206 | 9.363 |
| 15.278946446100996 | 9.363 |
| 15.290207075666778 | 9.363 |
| 15.301466149524542 | 9.357 |
| 15.31272366767427 | 9.357 |
| 15.323979630115947 | 9.357 |
| 15.33523403684956 | 9.357 |
| 15.346486887875093 | 9.357 |
| 15.35773818319253 | 9.352 |
| 15.368987922801859 | 9.357 |
| 15.380236106703062 | 9.352 |
| 15.391482734896128 | 9.357 |
| 15.402727807381039 | 9.352 |
| 15.413971324157782 | 9.352 |
| 15.42521328522634 | 9.357 |
| 15.4364536905867 | 9.352 |
| 15.447692540238844 | 9.357 |
| 15.45892983418276 | 9.357 |
| 15.470165572418432 | 9.352 |
| 15.481399754945848 | 9.347 |
| 15.49263238176499 | 9.347 |
| 15.503863452875843 | 9.352 |
| 15.515092968278392 | 9.347 |
| 15.526320927972623 | 9.352 |
| 15.537547331958521 | 9.352 |
| 15.548772180236071 | 9.347 |
| 15.559995472805259 | 9.347 |
| 15.571217209666068 | 9.347 |
| 15.582437390818486 | 9.347 |
| 15.593656016262495 | 9.342 |
| 15.604873085998081 | 9.342 |
| 15.616088600025229 | 9.347 |
| 15.627302558343924 | 9.342 |
| 15.638514960954152 | 9.342 |
| 15.649725807855898 | 9.347 |
| 15.660935099049146 | 9.342 |
| 15.672142834533881 | 9.347 |
| 15.683349014310089 | 9.342 |
| 15.694553638377753 | 9.342 |
| 15.70575670673686 | 9.342 |
| 15.716958219387395 | 9.342 |
| 15.728158176329343 | 9.342 |
| 15.739356577562688 | 9.347 |
| 15.750553423087416 | 9.337 |
| 15.76174871290351 | 9.337 |
| 15.772942447010957 | 9.337 |
| 15.78413462540974 | 9.337 |
| 15.795325248099847 | 9.347 |
| 15.80651431508126 | 9.342 |
| 15.817701826353966 | 9.337 |
| 15.828887781917949 | 9.337 |
| 15.840072181773195 | 9.337 |
| 15.851255025919688 | 9.337 |
| 15.862436314357412 | 9.337 |
| 15.873616047086353 | 9.332 |
| 15.884794224106496 | 9.332 |
| 15.895970845417827 | 9.337 |
| 15.90714591102033 | 9.337 |
| 15.918319420913988 | 9.337 |
| 15.929491375098788 | 9.332 |
| 15.940661773574714 | 9.332 |
| 15.951830616341752 | 9.337 |
| 15.962997903399886 | 9.337 |
| 15.974163634749102 | 9.332 |
| 15.985327810389384 | 9.327 |
| 15.996490430320717 | 9.332 |
| 16.007651494543087 | 9.332 |
| 16.018811003056477 | 9.327 |
| 16.029968955860873 | 9.332 |
| 16.04112535295626 | 9.337 |
| 16.05228019434262 | 9.332 |
| 16.063433480019945 | 9.332 |
| 16.074585209988214 | 9.327 |
| 16.08573538424741 | 9.332 |
| 16.096884002797523 | 9.322 |
| 16.108031065638535 | 9.322 |
| 16.11917657277043 | 9.327 |
| 16.1303205241932 | 9.327 |
| 16.141462919906818 | 9.322 |
| 16.152603759911276 | 9.322 |
| 16.16374304420656 | 9.327 |
| 16.17488077279265 | 9.327 |
| 16.186016945669536 | 9.322 |
| 16.1971515628372 | 9.322 |
| 16.208284624295626 | 9.327 |
| 16.219416130044802 | 9.327 |
| 16.23054608008471 | 9.322 |
| 16.241674474415337 | 9.322 |
| 16.252801313036667 | 9.322 |
| 16.263926595948682 | 9.316 |
| 16.27505032315137 | 9.322 |
| 16.286172494644713 | 9.322 |
| 16.2972931104287 | 9.316 |
| 16.308412170503313 | 9.322 |
| 16.319529674868537 | 9.316 |
| 16.330645623524358 | 9.322 |
| 16.341760016470758 | 9.316 |
| 16.352872853707726 | 9.316 |
| 16.363984135235242 | 9.316 |
| 16.375093861053294 | 9.322 |
| 16.386202031161865 | 9.322 |
| 16.39730864556094 | 9.311 |
| 16.408413704250506 | 9.316 |
| 16.419517207230545 | 9.316 |
| 16.43061915450104 | 9.316 |
| 16.441719546061982 | 9.316 |
| 16.452818381913353 | 9.316 |
| 16.463915662055136 | 9.316 |
| 16.475011386487317 | 9.311 |
| 16.48610555520988 | 9.311 |
| 16.49719816822281 | 9.311 |
| 16.50828922552609 | 9.316 |
| 16.519378727119708 | 9.311 |
| 16.530466673003648 | 9.311 |
| 16.541553063177894 | 9.316 |
| 16.552637897642427 | 9.311 |
| 16.563721176397237 | 9.311 |
| 16.574802899442307 | 9.316 |
| 16.585883066777622 | 9.306 |
| 16.596961678403165 | 9.306 |
| 16.60803873431892 | 9.306 |
| 16.619114234524876 | 9.306 |
| 16.630188179021015 | 9.316 |
| 16.641260567807322 | 9.306 |
| 16.65233140088378 | 9.301 |
| 16.663400678250376 | 9.311 |
| 16.674468399907095 | 9.306 |
| 16.68553456585392 | 9.301 |
| 16.696599176090835 | 9.306 |
| 16.707662230617824 | 9.301 |
| 16.718723729434874 | 9.306 |
| 16.72978367254197 | 9.306 |
| 16.740842059939094 | 9.311 |
| 16.751898891626233 | 9.301 |
| 16.76295416760337 | 9.311 |
| 16.774007887870493 | 9.301 |
| 16.785060052427582 | 9.301 |
| 16.79611066127462 | 9.306 |
| 16.8071597144116 | 9.306 |
| 16.818207211838498 | 9.301 |
| 16.829253153555303 | 9.301 |
| 16.840297539562 | 9.301 |
| 16.85134036985857 | 9.301 |
| 16.862381644445 | 9.306 |
| 16.873421363321278 | 9.306 |
| 16.884459526487383 | 9.296 |
| 16.8954961339433 | 9.301 |
| 16.906531185689015 | 9.301 |
| 16.917564681724514 | 9.296 |
| 16.928596622049778 | 9.296 |
| 16.939627006664796 | 9.296 |
| 16.95065583556955 | 9.301 |
| 16.961683108764024 | 9.301 |
| 16.972708826248205 | 9.296 |
| 16.983732988022073 | 9.296 |
| 16.994755594085618 | 9.296 |
| 17.005776644438818 | 9.291 |
| 17.016796139081663 | 9.296 |
| 17.027814078014135 | 9.296 |
| 17.03883046123622 | 9.301 |
| 17.0498452887479 | 9.291 |
| 17.060858560549164 | 9.291 |
| 17.07187027663999 | 9.291 |
| 17.08288043702037 | 9.296 |
| 17.093889041690286 | 9.296 |
| 17.104896090649717 | 9.291 |
| 17.115901583898655 | 9.291 |
| 17.126905521437077 | 9.296 |
| 17.137907903264974 | 9.291 |
| 17.148908729382327 | 9.291 |
| 17.159907999789123 | 9.291 |
| 17.170905714485343 | 9.286 |
| 17.181901873470974 | 9.296 |
| 17.192896476746 | 9.296 |
| 17.203889524310405 | 9.286 |
| 17.214881016164174 | 9.291 |
| 17.22587095230729 | 9.291 |
| 17.236859332739737 | 9.286 |
| 17.247846157461503 | 9.286 |
| 17.258831426472568 | 9.286 |
| 17.26981513977292 | 9.286 |
| 17.28079729736254 | 9.286 |
| 17.291777899241414 | 9.286 |
| 17.302756945409527 | 9.286 |
| 17.313734435866863 | 9.286 |
| 17.324710370613406 | 9.281 |
| 17.335684749649143 | 9.281 |
| 17.346657572974056 | 9.286 |
| 17.35762884058813 | 9.291 |
| 17.36859855249135 | 9.281 |
| 17.379566708683697 | 9.281 |
| 17.390533309165157 | 9.281 |
| 17.401498353935715 | 9.281 |
| 17.412461842995356 | 9.281 |
| 17.423423776344062 | 9.281 |
| 17.43438415398182 | 9.286 |
| 17.445342975908616 | 9.275 |
| 17.45630024212443 | 9.281 |
| 17.467255952629248 | 9.281 |
| 17.478210107423056 | 9.286 |
| 17.489162706505834 | 9.281 |
| 17.50011374987757 | 9.275 |
| 17.51106323753825 | 9.281 |
| 17.52201116948785 | 9.275 |
| 17.53295754572636 | 9.275 |
| 17.543902366253768 | 9.275 |
| 17.55484563107005 | 9.275 |
| 17.5657873401752 | 9.281 |
| 17.576727493569194 | 9.281 |
| 17.58766609125202 | 9.281 |
| 17.598603133223662 | 9.275 |
| 17.609538619484102 | 9.27 |
| 17.620472550033327 | 9.27 |
| 17.63140492487132 | 9.275 |
| 17.642335743998064 | 9.27 |
| 17.653265007413545 | 9.275 |
| 17.664192715117746 | 9.275 |
| 17.675118867110655 | 9.27 |
| 17.686043463392252 | 9.275 |
| 17.696966503962525 | 9.27 |
| 17.707887988821454 | 9.27 |
| 17.718807917969027 | 9.27 |
| 17.729726291405225 | 9.27 |
| 17.740643109130033 | 9.265 |
| 17.751558371143435 | 9.265 |
| 17.762472077445416 | 9.275 |
| 17.77338422803596 | 9.265 |
| 17.784294822915054 | 9.265 |
| 17.795203862082676 | 9.265 |
| 17.806111345538817 | 9.265 |
| 17.817017273283454 | 9.265 |
| 17.82792164531658 | 9.27 |
| 17.83882446163817 | 9.265 |
| 17.849725722248213 | 9.27 |
| 17.860625427146694 | 9.265 |
| 17.871523576333594 | 9.265 |
| 17.8824201698089 | 9.265 |
| 17.893315207572595 | 9.265 |
| 17.904208689624664 | 9.26 |
| 17.915100615965088 | 9.26 |
| 17.925990986593852 | 9.26 |
| 17.936879801510944 | 9.26 |
| 17.947767060716345 | 9.265 |
| 17.95865276421004 | 9.26 |
| 17.969536911992012 | 9.26 |
| 17.980419504062247 | 9.26 |
| 17.991300540420728 | 9.26 |
| 18.00218002106744 | 9.265 |
| 18.013057946002363 | 9.265 |
| 18.023934315225485 | 9.26 |
| 18.034809128736793 | 9.255 |
| 18.045682386536264 | 9.255 |
| 18.056554088623887 | 9.26 |
| 18.067424234999645 | 9.265 |
| 18.07829282566352 | 9.255 |
| 18.0891598606155 | 9.26 |
| 18.100025339855566 | 9.26 |
| 18.110889263383704 | 9.26 |
| 18.121751631199896 | 9.255 |
| 18.132612443304126 | 9.255 |
| 18.14347169969638 | 9.255 |
| 18.154329400376643 | 9.255 |
| 18.165185545344894 | 9.255 |
| 18.17604013460112 | 9.255 |
| 18.186893168145307 | 9.255 |
| 18.197744645977437 | 9.25 |
| 18.208594568097492 | 9.255 |
| 18.21944293450546 | 9.255 |
| 18.230289745201322 | 9.255 |
| 18.241135000185064 | 9.25 |
| 18.251978699456668 | 9.25 |
| 18.26282084301612 | 9.25 |
| 18.273661430863402 | 9.255 |
| 18.2845004629985 | 9.25 |
| 18.295337939421398 | 9.25 |
| 18.306173860132077 | 9.245 |
| 18.317008225130525 | 9.25 |
| 18.327841034416725 | 9.25 |
| 18.338672287990658 | 9.25 |
| 18.34950198585231 | 9.25 |
| 18.360330128001664 | 9.245 |
| 18.371156714438705 | 9.245 |
| 18.38198174516342 | 9.245 |
| 18.392805220175784 | 9.25 |
| 18.40362713947579 | 9.245 |
| 18.41444750306342 | 9.245 |
| 18.425266310938657 | 9.245 |
| 18.436083563101484 | 9.245 |
| 18.446899259551884 | 9.24 |
| 18.45771340028984 | 9.245 |
| 18.468525985315342 | 9.25 |
| 18.479337014628367 | 9.245 |
| 18.490146488228902 | 9.24 |
| 18.500954406116932 | 9.245 |
| 18.51176076829244 | 9.24 |
| 18.522565574755408 | 9.245 |
| 18.53336882550582 | 9.24 |
| 18.544170520543666 | 9.24 |
| 18.55497065986892 | 9.24 |
| 18.565769243481576 | 9.24 |
| 18.57656627138161 | 9.24 |
| 18.58736174356901 | 9.235 |
| 18.598155660043755 | 9.24 |
| 18.608948020805833 | 9.235 |
| 18.61973882585523 | 9.235 |
| 18.630528075191926 | 9.235 |
| 18.641315768815904 | 9.235 |
| 18.65210190672715 | 9.235 |
| 18.66288648892565 | 9.235 |
| 18.673669515411387 | 9.235 |
| 18.68445098618434 | 9.235 |
| 18.695230901244496 | 9.235 |
| 18.70600926059184 | 9.235 |
| 18.716786064226355 | 9.235 |
| 18.727561312148023 | 9.235 |
| 18.73833500435683 | 9.235 |
| 18.749107140852757 | 9.24 |
| 18.759877721635792 | 9.229 |
| 18.770646746705914 | 9.229 |
| 18.781414216063112 | 9.229 |
| 18.792180129707365 | 9.229 |
| 18.80294448763866 | 9.229 |
| 18.81370728985698 | 9.235 |
| 18.824468536362307 | 9.229 |
| 18.835228227154627 | 9.229 |
| 18.845986362233923 | 9.224 |
| 18.856742941600178 | 9.229 |
| 18.867497965253374 | 9.224 |
| 18.878251433193498 | 9.229 |
| 18.889003345420534 | 9.229 |
| 18.89975370193446 | 9.229 |
| 18.91050250273527 | 9.229 |
| 18.921249747822937 | 9.224 |
| 18.93199543719745 | 9.224 |
| 18.942739570858794 | 9.229 |
| 18.953482148806952 | 9.224 |
| 18.964223171041905 | 9.224 |
| 18.97496263756364 | 9.224 |
| 18.985700548372137 | 9.224 |
| 18.99643690346738 | 9.224 |
| 19.007171702849355 | 9.224 |
| 19.017904946518048 | 9.229 |
| 19.028636634473436 | 9.224 |
| 19.039366766715506 | 9.219 |
| 19.050095343244244 | 9.224 |
| 19.060822364059632 | 9.224 |
| 19.071547829161652 | 9.229 |
| 19.08227173855029 | 9.219 |
| 19.092994092225528 | 9.219 |
| 19.103714890187348 | 9.219 |
| 19.114434132435736 | 9.219 |
| 19.125151818970675 | 9.219 |
| 19.13586794979215 | 9.219 |
| 19.146582524900143 | 9.224 |
| 19.157295544294637 | 9.219 |
| 19.168007007975618 | 9.219 |
| 19.178716915943067 | 9.224 |
| 19.18942526819697 | 9.219 |
| 19.20013206473731 | 9.214 |
| 19.21083730556407 | 9.219 |
| 19.221540990677234 | 9.214 |
| 19.232243120076784 | 9.214 |
| 19.242943693762705 | 9.214 |
| 19.25364271173498 | 9.214 |
| 19.26434017399359 | 9.214 |
| 19.275036080538527 | 9.214 |
| 19.285730431369768 | 9.214 |
| 19.296423226487295 | 9.214 |
| 19.307114465891097 | 9.214 |
| 19.317804149581153 | 9.214 |
| 19.328492277557448 | 9.219 |
| 19.339178849819966 | 9.214 |
| 19.34986386636869 | 9.209 |
| 19.3605473272036 | 9.209 |
| 19.371229232324687 | 9.209 |
| 19.38190958173193 | 9.209 |
| 19.392588375425312 | 9.209 |
| 19.40326561340482 | 9.209 |
| 19.413941295670433 | 9.209 |
| 19.424615422222136 | 9.214 |
| 19.435287993059912 | 9.214 |
| 19.44595900818375 | 9.214 |
| 19.456628467593625 | 9.209 |
| 19.467296371289525 | 9.204 |
| 19.477962719271435 | 9.209 |
| 19.488627511539335 | 9.209 |
| 19.49929074809321 | 9.204 |
| 19.50995242893304 | 9.204 |
| 19.520612554058815 | 9.204 |
| 19.531271123470514 | 9.209 |
| 19.54192813716812 | 9.204 |
| 19.55258359515162 | 9.209 |
| 19.563237497420996 | 9.209 |
| 19.57388984397623 | 9.204 |
| 19.584540634817305 | 9.199 |
| 19.595189869944207 | 9.204 |
| 19.605837549356917 | 9.204 |
| 19.61648367305542 | 9.204 |
| 19.6271282410397 | 9.204 |
| 19.637771253309737 | 9.204 |
| 19.648412709865518 | 9.199 |
| 19.659052610707025 | 9.199 |
| 19.66969095583424 | 9.199 |
| 19.68032774524715 | 9.204 |
| 19.690962978945738 | 9.199 |
| 19.701596656929983 | 9.199 |
| 19.71222877919987 | 9.199 |
| 19.72285934575538 | 9.204 |
| 19.733488356596503 | 9.199 |
| 19.74411581172322 | 9.204 |
| 19.754741711135512 | 9.199 |
| 19.765366054833365 | 9.204 |
| 19.77598884281676 | 9.199 |
| 19.78661007508568 | 9.194 |
| 19.79722975164011 | 9.194 |
| 19.807847872480032 | 9.194 |
| 19.81846443760543 | 9.194 |
| 19.829079447016287 | 9.194 |
| 19.83969290071259 | 9.194 |
| 19.850304798694314 | 9.194 |
| 19.86091514096145 | 9.194 |
| 19.871523927513977 | 9.199 |
| 19.88213115835188 | 9.194 |
| 19.89273683347514 | 9.188 |
| 19.903340952883745 | 9.188 |
| 19.913943516577675 | 9.188 |
| 19.924544524556914 | 9.188 |
| 19.935143976821443 | 9.188 |
| 19.945741873371247 | 9.188 |
| 19.956338214206312 | 9.188 |
| 19.966932999326616 | 9.194 |
| 19.977526228732145 | 9.188 |
| 19.988117902422882 | 9.188 |
| 19.998708020398812 | 9.188 |
| 20.009296582659918 | 9.188 |
| 20.01988358920618 | 9.183 |
| 20.030469040037584 | 9.188 |
| 20.041052935154113 | 9.183 |
| 20.051635274555746 | 9.188 |
| 20.06221605824247 | 9.183 |
| 20.07279528621427 | 9.183 |
| 20.083372958471124 | 9.183 |
| 20.09394907501302 | 9.188 |
| 20.10452363583994 | 9.188 |
| 20.115096640951865 | 9.183 |
| 20.125668090348782 | 9.183 |
| 20.13623798403067 | 9.183 |
| 20.146806321997516 | 9.178 |
| 20.1573731042493 | 9.183 |
| 20.167938330786004 | 9.183 |
| 20.178502001607615 | 9.183 |
| 20.189064116714114 | 9.183 |
| 20.199624676105486 | 9.178 |
| 20.21018367978171 | 9.178 |
| 20.220741127742773 | 9.183 |
| 20.231297019988656 | 9.178 |
| 20.241851356519344 | 9.178 |
| 20.252404137334818 | 9.173 |
| 20.26295536243506 | 9.178 |
| 20.27350503182006 | 9.178 |
| 20.284053145489796 | 9.178 |
| 20.294599703444252 | 9.173 |
| 20.30514470568341 | 9.178 |
| 20.315688152207255 | 9.173 |
| 20.326230043015766 | 9.178 |
| 20.33677037810893 | 9.183 |
| 20.347309157486727 | 9.183 |
| 20.35784638114914 | 9.173 |
| 20.36838204909616 | 9.178 |
| 20.37891616132776 | 9.178 |
| 20.389448717843926 | 9.173 |
| 20.399979718644644 | 9.173 |
| 20.410509163729895 | 9.173 |
| 20.42103705309966 | 9.173 |
| 20.431563386753925 | 9.173 |
| 20.442088164692674 | 9.173 |
| 20.452611386915887 | 9.168 |
| 20.463133053423547 | 9.173 |
| 20.47365316421564 | 9.168 |
| 20.484171719292146 | 9.173 |
| 20.494688718653048 | 9.168 |
| 20.50520416229833 | 9.168 |
| 20.515718050227974 | 9.173 |
| 20.526230382441966 | 9.173 |
| 20.536741158940288 | 9.173 |
| 20.54725037972292 | 9.173 |
| 20.55775804478985 | 9.168 |
| 20.568264154141055 | 9.163 |
| 20.578768707776522 | 9.173 |
| 20.58927170569623 | 9.168 |
| 20.599773147900166 | 9.163 |
| 20.61027303438831 | 9.163 |
| 20.62077136516065 | 9.163 |
| 20.631268140217163 | 9.168 |
| 20.641763359557835 | 9.163 |
| 20.65225702318265 | 9.163 |
| 20.662749131091587 | 9.163 |
| 20.67323968328463 | 9.168 |
| 20.683728679761764 | 9.163 |
| 20.69421612052297 | 9.163 |
| 20.704702005568233 | 9.168 |
| 20.715186334897535 | 9.163 |
| 20.725669108510857 | 9.163 |
| 20.736150326408183 | 9.158 |
| 20.746629988589497 | 9.158 |
| 20.75710809505478 | 9.158 |
| 20.767584645804014 | 9.168 |
| 20.778059640837185 | 9.158 |
| 20.788533080154277 | 9.158 |
| 20.79900496375527 | 9.158 |
| 20.809475291640144 | 9.158 |
| 20.819944063808887 | 9.158 |
| 20.83041128026148 | 9.158 |
| 20.840876940997905 | 9.163 |
| 20.851341046018145 | 9.152 |
| 20.861803595322186 | 9.158 |
| 20.872264588910006 | 9.158 |
| 20.88272402678159 | 9.158 |
| 20.893181908936924 | 9.163 |
| 20.903638235375986 | 9.152 |
| 20.91409300609876 | 9.152 |
| 20.924546221105228 | 9.152 |
| 20.934997880395372 | 9.152 |
| 20.945447983969178 | 9.152 |
| 20.955896531826628 | 9.152 |
| 20.966343523967705 | 9.152 |
| 20.97678896039239 | 9.147 |
| 20.987232841100667 | 9.147 |
| 20.997675166092517 | 9.147 |
| 21.008115935367925 | 9.147 |
| 21.018555148926872 | 9.147 |
| 21.02899280676934 | 9.147 |
| 21.039428908895317 | 9.152 |
| 21.04986345530478 | 9.152 |
| 21.060296445997714 | 9.147 |
| 21.0707278809741 | 9.147 |
| 21.081157760233925 | 9.147 |
| 21.091586083777166 | 9.152 |
| 21.10201285160381 | 9.152 |
| 21.11243806371384 | 9.152 |
| 21.12286172010723 | 9.152 |
| 21.133283820783973 | 9.147 |
| 21.14370436574405 | 9.142 |
| 21.15412335498744 | 9.142 |
| 21.164540788514127 | 9.142 |
| 21.174956666324096 | 9.142 |
| 21.185370988417326 | 9.142 |
| 21.1957837547938 | 9.142 |
| 21.206194965453506 | 9.142 |
| 21.21660462039642 | 9.142 |
| 21.22701271962253 | 9.142 |
| 21.237419263131812 | 9.142 |
| 21.247824250924253 | 9.142 |
| 21.258227682999838 | 9.142 |
| 21.268629559358544 | 9.142 |
| 21.27902988000036 | 9.147 |
| 21.289428644925263 | 9.147 |
| 21.299825854133235 | 9.142 |
| 21.310221507624263 | 9.137 |
| 21.320615605398327 | 9.137 |
| 21.33100814745541 | 9.142 |
| 21.341399133795495 | 9.137 |
| 21.351788564418566 | 9.137 |
| 21.362176439324603 | 9.137 |
| 21.37256275851359 | 9.137 |
| 21.38294752198551 | 9.137 |
| 21.393330729740345 | 9.137 |
| 21.403712381778075 | 9.132 |
| 21.414092478098684 | 9.137 |
| 21.424471018702157 | 9.137 |
| 21.434848003588474 | 9.137 |
| 21.44522343275762 | 9.132 |
| 21.455597306209572 | 9.137 |
| 21.465969623944318 | 9.137 |
| 21.47634038596184 | 9.132 |
| 21.48670959226212 | 9.132 |
| 21.497077242845137 | 9.142 |
| 21.50744333771088 | 9.132 |
| 21.517807876859322 | 9.137 |
| 21.528170860290455 | 9.132 |
| 21.53853228800426 | 9.137 |
| 21.54889216000071 | 9.132 |
| 21.5592504762798 | 9.132 |
| 21.569607236841506 | 9.132 |
| 21.57996244168581 | 9.132 |
| 21.5903160908127 | 9.132 |
| 21.60066818422215 | 9.127 |
| 21.61101872191415 | 9.132 |
| 21.621367703888676 | 9.127 |
| 21.631715130145714 | 9.127 |
| 21.64206100068525 | 9.127 |
| 21.65240531550726 | 9.127 |
| 21.662748074611727 | 9.127 |
| 21.67308927799864 | 9.132 |
| 21.68342892566797 | 9.127 |
| 21.693767017619713 | 9.127 |
| 21.70410355385384 | 9.127 |
| 21.71443853437034 | 9.132 |
| 21.724771959169193 | 9.132 |
| 21.73510382825038 | 9.127 |
| 21.745434141613888 | 9.127 |
| 21.755762899259693 | 9.127 |
| 21.766090101187782 | 9.122 |
| 21.776415747398136 | 9.122 |
| 21.78673983789074 | 9.122 |
| 21.797062372665568 | 9.122 |
| 21.80738335172261 | 9.122 |
| 21.817702775061846 | 9.122 |
| 21.82802064268326 | 9.117 |
| 21.838336954586833 | 9.122 |
| 21.848651710772547 | 9.122 |
| 21.858964911240385 | 9.117 |
| 21.86927655599033 | 9.117 |
| 21.87958664502236 | 9.122 |
| 21.889895178336463 | 9.122 |
| 21.900202155932618 | 9.117 |
| 21.910507577810808 | 9.117 |
| 21.920811443971015 | 9.117 |
| 21.93111375441322 | 9.122 |
| 21.94141450913741 | 9.117 |
| 21.95171370814356 | 9.117 |
| 21.96201135143166 | 9.117 |
| 21.972307439001685 | 9.111 |
| 21.982601970853622 | 9.117 |
| 21.992894946987455 | 9.117 |
| 22.003186367403163 | 9.111 |
| 22.01347623210073 | 9.111 |
| 22.023764541080133 | 9.111 |
| 22.03405129434136 | 9.111 |
| 22.04433649188439 | 9.111 |
| 22.054620133709207 | 9.111 |
| 22.064902219815792 | 9.111 |
| 22.075182750204128 | 9.111 |
| 22.085461724874197 | 9.111 |
| 22.09573914382598 | 9.106 |
| 22.10601500705946 | 9.106 |
| 22.116289314574622 | 9.111 |
| 22.126562066371445 | 9.111 |
| 22.136833262449912 | 9.111 |
| 22.147102902810005 | 9.111 |
| 22.157370987451706 | 9.111 |
| 22.167637516374995 | 9.111 |
| 22.177902489579857 | 9.117 |
| 22.188165907066274 | 9.106 |
| 22.19842776883423 | 9.106 |
| 22.208688074883703 | 9.111 |
| 22.218946825214676 | 9.106 |
| 22.229204019827133 | 9.101 |
| 22.239459658721056 | 9.106 |
| 22.249713741896425 | 9.101 |
| 22.259966269353225 | 9.101 |
| 22.270217241091434 | 9.106 |
| 22.280466657111038 | 9.106 |
| 22.290714517412017 | 9.106 |
| 22.30096082199435 | 9.101 |
| 22.31120557085803 | 9.101 |
| 22.321448764003026 | 9.106 |
| 22.331690401429327 | 9.101 |
| 22.341930483136913 | 9.106 |
| 22.35216900912577 | 9.101 |
| 22.362405979395877 | 9.101 |
| 22.372641393947216 | 9.101 |
| 22.38287525277977 | 9.101 |
| 22.393107555893515 | 9.096 |
| 22.40333830328844 | 9.101 |
| 22.413567494964525 | 9.096 |
| 22.423795130921754 | 9.101 |
| 22.434021211160104 | 9.096 |
| 22.444245735679562 | 9.096 |
| 22.454468704480107 | 9.101 |
| 22.464690117561723 | 9.096 |
| 22.47490997492439 | 9.101 |
| 22.485128276568094 | 9.096 |
| 22.495345022492813 | 9.096 |
| 22.50556021269853 | 9.101 |
| 22.515773847185226 | 9.101 |
| 22.525985925952885 | 9.091 |
| 22.536196449001487 | 9.101 |
| 22.546405416331016 | 9.091 |
| 22.55661282794145 | 9.096 |
| 22.566818683832775 | 9.091 |
| 22.57702298400497 | 9.096 |
| 22.58722572845802 | 9.091 |
| 22.597426917191903 | 9.096 |
| 22.607626550206607 | 9.096 |
| 22.61782462750211 | 9.091 |
| 22.628021149078393 | 9.086 |
| 22.63821611493544 | 9.091 |
| 22.64840952507323 | 9.096 |
| 22.65860137949175 | 9.091 |
| 22.668791678190974 | 9.096 |
| 22.67898042117089 | 9.091 |
| 22.68916760843148 | 9.091 |
| 22.699353239972723 | 9.096 |
| 22.709537315794602 | 9.091 |
| 22.7197198358971 | 9.086 |
| 22.729900800280195 | 9.091 |
| 22.740080208943873 | 9.086 |
| 22.750258061888115 | 9.086 |
| 22.760434359112903 | 9.086 |
| 22.770609100618216 | 9.086 |
| 22.78078228640404 | 9.086 |
| 22.790953916470354 | 9.091 |
| 22.80112399081714 | 9.091 |
| 22.811292509444378 | 9.086 |
| 22.821459472352053 | 9.081 |
| 22.831624879540147 | 9.086 |
| 22.84178873100864 | 9.081 |
| 22.85195102675752 | 9.091 |
| 22.862111766786757 | 9.086 |
| 22.87227095109634 | 9.081 |
| 22.882428579686252 | 9.086 |
| 22.892584652556472 | 9.086 |
| 22.902739169706983 | 9.081 |
| 22.912892131137763 | 9.086 |
| 22.923043536848798 | 9.081 |
| 22.93319338684007 | 9.086 |
| 22.94334168111156 | 9.081 |
| 22.953488419663245 | 9.086 |
| 22.96363360249511 | 9.081 |
| 22.97377722960714 | 9.081 |
| 22.983919300999315 | 9.081 |
| 22.994059816671612 | 9.081 |
| 23.00419877662402 | 9.076 |
| 23.014336180856514 | 9.076 |
| 23.02447202936908 | 9.086 |
| 23.034606322161697 | 9.076 |
| 23.04473905923435 | 9.076 |
| 23.054870240587018 | 9.081 |
| 23.064999866219683 | 9.076 |
| 23.07512793613233 | 9.081 |
| 23.085254450324936 | 9.081 |
| 23.095379408797484 | 9.07 |
| 23.105502811549957 | 9.07 |
| 23.115624658582338 | 9.07 |
| 23.125744949894603 | 9.07 |
| 23.135863685486736 | 9.076 |
| 23.145980865358723 | 9.076 |
| 23.15609648951054 | 9.07 |
| 23.16621055794217 | 9.076 |
| 23.176323070653595 | 9.07 |
| 23.186434027644797 | 9.07 |
| 23.19654342891576 | 9.07 |
| 23.206651274466463 | 9.07 |
| 23.216757564296888 | 9.07 |
| 23.226862298407013 | 9.076 |
| 23.236965476796826 | 9.065 |
| 23.247067099466303 | 9.076 |
| 23.257167166415428 | 9.065 |
| 23.267265677644183 | 9.065 |
| 23.27736263315255 | 9.07 |
| 23.287458032940506 | 9.065 |
| 23.29755187700804 | 9.07 |
| 23.30764416535513 | 9.07 |
| 23.317734897981754 | 9.07 |
| 23.327824074887896 | 9.06 |
| 23.33791169607354 | 9.07 |
| 23.347997761538664 | 9.065 |
| 23.35808227128325 | 9.07 |
| 23.368165225307283 | 9.06 |
| 23.378246623610742 | 9.065 |
| 23.388326466193607 | 9.065 |
| 23.398404753055864 | 9.06 |
| 23.40848148419749 | 9.06 |
| 23.418556659618467 | 9.06 |
| 23.428630279318778 | 9.065 |
| 23.438702343298402 | 9.06 |
| 23.448772851557326 | 9.06 |
| 23.458841804095524 | 9.06 |
| 23.468909200912982 | 9.06 |
| 23.478975042009683 | 9.06 |
| 23.489039327385605 | 9.06 |
| 23.49910205704073 | 9.06 |
| 23.50916323097504 | 9.065 |
| 23.519222849188516 | 9.06 |
| 23.529280911681138 | 9.06 |
| 23.53933741845289 | 9.055 |
| 23.549392369503753 | 9.055 |
| 23.559445764833708 | 9.06 |
| 23.569497604442734 | 9.055 |
| 23.579547888330815 | 9.055 |
| 23.589596616497932 | 9.06 |
| 23.599643788944068 | 9.055 |
| 23.6096894056692 | 9.055 |
| 23.619733466673313 | 9.055 |
| 23.629775971956388 | 9.05 |
| 23.639816921518406 | 9.055 |
| 23.649856315359347 | 9.05 |
| 23.659894153479193 | 9.05 |
| 23.669930435877927 | 9.05 |
| 23.679965162555526 | 9.05 |
| 23.689998333511976 | 9.06 |
| 23.700029948747257 | 9.05 |
| 23.71006000826135 | 9.05 |
| 23.720088512054236 | 9.05 |
| 23.730115460125894 | 9.05 |
| 23.74014085247631 | 9.05 |
| 23.75016468910546 | 9.05 |
| 23.76018697001333 | 9.045 |
| 23.770207695199897 | 9.05 |
| 23.780226864665146 | 9.05 |
| 23.790244478409058 | 9.045 |
| 23.80026053643161 | 9.045 |
| 23.81027503873279 | 9.05 |
| 23.820287985312575 | 9.045 |
| 23.830299376170945 | 9.045 |
| 23.840309211307886 | 9.05 |
| 23.850317490723373 | 9.045 |
| 23.860324214417393 | 9.045 |
| 23.870329382389922 | 9.05 |
| 23.880332994640945 | 9.045 |
| 23.890335051170442 | 9.05 |
| 23.900335551978394 | 9.04 |
| 23.91033449706478 | 9.04 |
| 23.920331886429587 | 9.045 |
| 23.930327720072793 | 9.05 |
| 23.940321997994378 | 9.04 |
| 23.950314720194324 | 9.045 |
| 23.96030588667261 | 9.04 |
| 23.970295497429223 | 9.04 |
| 23.98028355246414 | 9.04 |
| 23.99027005177734 | 9.04 |
| 24.00025499536881 | 9.04 |
| 24.010238383238526 | 9.04 |
| 24.02022021538647 | 9.045 |
| 24.030200491812625 | 9.04 |
| 24.04017921251697 | 9.04 |
| 24.05015637749949 | 9.045 |
| 24.06013198676016 | 9.035 |
| 24.070106040298967 | 9.035 |
| 24.080078538115888 | 9.04 |
| 24.090049480210904 | 9.035 |
| 24.100018866584 | 9.035 |
| 24.109986697235154 | 9.035 |
| 24.11995297216435 | 9.04 |
| 24.129917691371563 | 9.04 |
| 24.13988085485678 | 9.035 |
| 24.14984246261998 | 9.035 |
| 24.15980251466114 | 9.035 |
| 24.16976101098025 | 9.03 |
| 24.17971795157728 | 9.03 |
| 24.18967333645222 | 9.035 |
| 24.199627165605047 | 9.03 |
| 24.209579439035746 | 9.03 |
| 24.219530156744295 | 9.035 |
| 24.22947931873067 | 9.035 |
| 24.239426924994863 | 9.03 |
| 24.249372975536847 | 9.03 |
| 24.259317470356603 | 9.035 |
| 24.269260409454112 | 9.03 |
| 24.279201792829358 | 9.03 |
| 24.289141620482322 | 9.03 |
| 24.299079892412983 | 9.03 |
| 24.309016608621324 | 9.03 |
| 24.318951769107322 | 9.03 |
| 24.32888537387096 | 9.035 |
| 24.33881742291222 | 9.024 |
| 24.348747916231083 | 9.024 |
| 24.35867685382753 | 9.024 |
| 24.36860423570154 | 9.03 |
| 24.378530061853095 | 9.024 |
| 24.388454332282176 | 9.024 |
| 24.398377046988763 | 9.024 |
| 24.408298205972837 | 9.024 |
| 24.41821780923438 | 9.024 |
| 24.428135856773373 | 9.024 |
| 24.438052348589796 | 9.024 |
| 24.44796728468363 | 9.024 |
| 24.45788066505486 | 9.024 |
| 24.467792489703456 | 9.019 |
| 24.47770275862941 | 9.019 |
| 24.487611471832697 | 9.019 |
| 24.497518629313298 | 9.024 |
| 24.507424231071194 | 9.03 |
| 24.51732827710637 | 9.024 |
| 24.527230767418803 | 9.024 |
| 24.537131702008473 | 9.019 |
| 24.547031080875364 | 9.019 |
| 24.556928904019454 | 9.019 |
| 24.566825171440726 | 9.019 |
| 24.57671988313916 | 9.019 |
| 24.586613039114734 | 9.019 |
| 24.59650463936743 | 9.019 |
| 24.606394683897236 | 9.014 |
| 24.616283172704122 | 9.024 |
| 24.626170105788074 | 9.014 |
| 24.63605548314907 | 9.014 |
| 24.6459393047871 | 9.019 |
| 24.655821570702134 | 9.014 |
| 24.665702280894156 | 9.014 |
| 24.675581435363146 | 9.014 |
| 24.685459034109087 | 9.014 |
| 24.695335077131958 | 9.014 |
| 24.70520956443174 | 9.014 |
| 24.715082496008414 | 9.019 |
| 24.72495387186196 | 9.009 |
| 24.73482369199236 | 9.014 |
| 24.744691956399596 | 9.009 |
| 24.754558665083643 | 9.014 |
| 24.764423818044488 | 9.009 |
| 24.774287415282107 | 9.009 |
| 24.784149456796484 | 9.009 |
| 24.794009942587596 | 9.009 |
| 24.80386887265543 | 9.014 |
| 24.81372624699996 | 9.009 |
| 24.823582065621167 | 9.009 |
| 24.833436328519035 | 9.009 |
| 24.843289035693545 | 9.009 |
| 24.853140187144675 | 9.009 |
| 24.862989782872404 | 9.014 |
| 24.87283782287672 | 9.009 |
| 24.882684307157593 | 9.004 |
| 24.892529235715013 | 9.009 |
| 24.902372608548955 | 9.009 |
| 24.912214425659403 | 9.004 |
| 24.922054687046337 | 9.004 |
| 24.931893392709735 | 9.004 |
| 24.94173054264958 | 9.004 |
| 24.95156613686585 | 9.004 |
| 24.961400175358527 | 9.004 |
| 24.971232658127594 | 8.999 |
| 24.98106358517303 | 9.004 |
| 24.99089295649481 | 9.004 |
| 25.000720772092922 | 9.004 |
| 25.010547031967345 | 8.999 |
| 25.020371736118058 | 8.999 |
| 25.03019488454504 | 9.004 |
| 25.040016477248273 | 9.004 |
| 25.04983651422774 | 8.999 |
| 25.059654995483417 | 9.004 |
| 25.06947192101529 | 9.004 |
| 25.079287290823334 | 9.004 |
| 25.08910110490753 | 8.999 |
| 25.09891336326786 | 9.004 |
| 25.10872406590431 | 8.999 |
| 25.11853321281685 | 8.999 |
| 25.128340804005465 | 8.999 |
| 25.138146839470135 | 8.999 |
| 25.147951319210843 | 8.999 |
| 25.15775424322757 | 8.994 |
| 25.167555611520292 | 8.994 |
| 25.177355424088994 | 8.994 |
| 25.18715368093365 | 8.994 |
| 25.196950382054247 | 8.994 |
| 25.20674552745076 | 8.994 |
| 25.216539117123173 | 8.999 |
| 25.226331151071467 | 8.999 |
| 25.23612162929562 | 8.994 |
| 25.245910551795614 | 8.994 |
| 25.25569791857143 | 8.994 |
| 25.265483729623043 | 8.994 |
| 25.27526798495044 | 8.989 |
| 25.285050684553596 | 8.989 |
| 25.294831828432496 | 8.994 |
| 25.304611416587118 | 8.999 |
| 25.31438944901744 | 8.989 |
| 25.324165925723445 | 8.989 |
| 25.333940846705115 | 8.989 |
| 25.34371421196243 | 8.994 |
| 25.353486021495364 | 8.989 |
| 25.363256275303904 | 8.989 |
| 25.373024973388027 | 8.994 |
| 25.382792115747716 | 8.989 |
| 25.39255770238295 | 8.994 |
| 25.402321733293707 | 8.989 |
| 25.41208420847997 | 8.989 |
| 25.42184512794172 | 8.983 |
| 25.431604491678932 | 8.983 |
| 25.441362299691594 | 8.983 |
| 25.451118551979683 | 8.983 |
| 25.460873248543177 | 8.989 |
| 25.47062638938206 | 8.989 |
| 25.480377974496307 | 8.983 |
| 25.4901280038859 | 8.989 |
| 25.49987647755082 | 8.989 |
| 25.50962339549105 | 8.983 |
| 25.519368757706566 | 8.978 |
| 25.52911256419735 | 8.983 |
| 25.538854814963383 | 8.983 |
| 25.548595510004642 | 8.983 |
| 25.55833464932111 | 8.978 |
| 25.56807223291277 | 8.978 |
| 25.577808260779594 | 8.978 |
| 25.58754273292157 | 8.983 |
| 25.597275649338673 | 8.978 |
| 25.607007010030884 | 8.978 |
| 25.616736814998184 | 8.983 |
| 25.626465064240556 | 8.983 |
| 25.636191757757977 | 8.978 |
| 25.645916895550428 | 8.978 |
| 25.655640477617887 | 8.983 |
| 25.665362503960335 | 8.978 |
| 25.67508297457775 | 8.978 |
| 25.68480188947012 | 8.973 |
| 25.694519248637416 | 8.973 |
| 25.704235052079625 | 8.978 |
| 25.713949299796724 | 8.973 |
| 25.723661991788692 | 8.973 |
| 25.73337312805551 | 8.973 |
| 25.74308270859716 | 8.978 |
| 25.75279073341362 | 8.978 |
| 25.762497202504868 | 8.968 |
| 25.772202115870886 | 8.973 |
| 25.781905473511657 | 8.968 |
| 25.791607275427154 | 8.968 |
| 25.801307521617364 | 8.968 |
| 25.811006212082262 | 8.968 |
| 25.82070334682183 | 8.968 |
| 25.83039892583605 | 8.973 |
| 25.840092949124898 | 8.978 |
| 25.84978541668836 | 8.968 |
| 25.85947632852641 | 8.968 |
| 25.86916568463903 | 8.973 |
| 25.878853485026198 | 8.973 |
| 25.8885397296879 | 8.968 |
| 25.898224418624107 | 8.968 |
| 25.907907551834807 | 8.973 |
| 25.917589129319975 | 8.978 |
| 25.927269151079592 | 8.973 |
| 25.93694761711364 | 8.968 |
| 25.946624527422095 | 8.963 |
| 25.95629988200494 | 8.963 |
| 25.965973680862156 | 8.968 |
| 25.97564592399372 | 8.968 |
| 25.985316611399615 | 8.968 |
| 25.994985743079816 | 8.968 |
| 26.004653319034308 | 8.968 |
| 26.014319339263068 | 8.968 |
| 26.023983803766075 | 8.968 |
| 26.033646712543312 | 8.963 |
| 26.043308065594758 | 8.968 |
| 26.05296786292039 | 8.963 |
| 26.06262610452019 | 8.968 |
| 26.072282790394137 | 8.968 |
| 26.081937920542213 | 8.968 |
| 26.091591494964394 | 8.963 |
| 26.101243513660663 | 8.963 |
| 26.110893976630997 | 8.963 |
| 26.12054288387538 | 8.968 |
| 26.130190235393787 | 8.963 |
| 26.139836031186203 | 8.968 |
| 26.149480271252603 | 8.963 |
| 26.15912295559297 | 8.963 |
| 26.168764084207282 | 8.958 |
| 26.17840365709552 | 8.968 |
| 26.18804167425766 | 8.958 |
| 26.197678135693685 | 8.963 |
| 26.207313041403577 | 8.958 |
| 26.21694639138731 | 8.963 |
| 26.22657818564487 | 8.958 |
| 26.23620842417623 | 8.963 |
| 26.245837106981373 | 8.958 |
| 26.25546423406028 | 8.958 |
| 26.26508980541293 | 8.958 |
| 26.274713821039303 | 8.958 |
| 26.284336280939375 | 8.958 |
| 26.29395718511313 | 8.958 |
| 26.303576533560545 | 8.958 |
| 26.3131943262816 | 8.963 |
| 26.322810563276278 | 8.958 |
| 26.332425244544556 | 8.958 |
| 26.342038370086414 | 8.953 |
| 26.35164993990183 | 8.953 |
| 26.361259953990785 | 8.953 |
| 26.37086841235326 | 8.958 |
| 26.380475314989233 | 8.947 |
| 26.390080661898683 | 8.953 |
| 26.39968445308159 | 8.953 |
| 26.409286688537936 | 8.953 |
| 26.418887368267697 | 8.953 |
| 26.428486492270853 | 8.947 |
| 26.438084060547386 | 8.958 |
| 26.447680073097274 | 8.947 |
| 26.457274529920497 | 8.953 |
| 26.466867431017036 | 8.953 |
| 26.476458776386867 | 8.947 |
| 26.48604856602997 | 8.947 |
| 26.49563679994633 | 8.947 |
| 26.50522347813592 | 8.947 |
| 26.514808600598723 | 8.947 |
| 26.524392167334717 | 8.958 |
| 26.533974178343882 | 8.947 |
| 26.543554633626197 | 8.947 |
| 26.553133533181644 | 8.947 |
| 26.5627108770102 | 8.947 |
| 26.572286665111847 | 8.947 |
| 26.58186089748656 | 8.947 |
| 26.59143357413432 | 8.942 |
| 26.60100469505511 | 8.942 |
| 26.610574260248907 | 8.947 |
| 26.62014226971569 | 8.947 |
| 26.629708723455437 | 8.947 |
| 26.639273621468128 | 8.942 |
| 26.648836963753745 | 8.947 |
| 26.658398750312266 | 8.942 |
| 26.66795898114367 | 8.947 |
| 26.677517656247936 | 8.942 |
| 26.687074775625046 | 8.942 |
| 26.696630339274975 | 8.942 |
| 26.706184347197706 | 8.942 |
| 26.715736799393216 | 8.947 |
| 26.72528769586149 | 8.937 |
| 26.7348370366025 | 8.942 |
| 26.74438482161623 | 8.942 |
| 26.753931050902658 | 8.937 |
| 26.763475724461763 | 8.937 |
| 26.773018842293524 | 8.937 |
| 26.78256040439792 | 8.937 |
| 26.792100410774932 | 8.942 |
| 26.801638861424536 | 8.937 |
| 26.811175756346714 | 8.937 |
| 26.820711095541444 | 8.932 |
| 26.83024487900871 | 8.937 |
| 26.839777106748485 | 8.942 |
| 26.849307778760753 | 8.937 |
| 26.858836895045492 | 8.932 |
| 26.868364455602677 | 8.932 |
| 26.877890460432294 | 8.942 |
| 26.887414909534318 | 8.937 |
| 26.896937802908727 | 8.932 |
| 26.906459140555505 | 8.932 |
| 26.915978922474626 | 8.937 |
| 26.92549714866607 | 8.932 |
| 26.93501381912982 | 8.937 |
| 26.944528933865858 | 8.927 |
| 26.954042492874155 | 8.932 |
| 26.963554496154693 | 8.932 |
| 26.973064943707453 | 8.927 |
| 26.982573835532413 | 8.932 |
| 26.992081171629554 | 8.932 |
| 27.001586951998853 | 8.932 |
| 27.01109117664029 | 8.927 |
| 27.02059384555384 | 8.932 |
| 27.030094958739486 | 8.927 |
| 27.03959451619721 | 8.927 |
| 27.049092517926987 | 8.927 |
| 27.0585889639288 | 8.927 |
| 27.06808385420262 | 8.927 |
| 27.077577188748432 | 8.927 |
| 27.087068967566218 | 8.927 |
| 27.096559190655952 | 8.927 |
| 27.106047858017615 | 8.927 |
| 27.115534969651186 | 8.927 |
| 27.125020525556646 | 8.927 |
| 27.13450452573397 | 8.922 |
| 27.14398697018314 | 8.932 |
| 27.153467858904133 | 8.927 |
| 27.16294719189693 | 8.922 |
| 27.172424969161508 | 8.927 |
| 27.18190119069785 | 8.922 |
| 27.191375856505932 | 8.922 |
| 27.20084896658573 | 8.922 |
| 27.21032052093723 | 8.922 |
| 27.21979051956041 | 8.922 |
| 27.22925896245524 | 8.927 |
| 27.23872584962171 | 8.917 |
| 27.24819118105979 | 8.922 |
| 27.257654956769468 | 8.917 |
| 27.267117176750716 | 8.917 |
| 27.276577841003515 | 8.922 |
| 27.286036949527848 | 8.917 |
| 27.295494502323688 | 8.922 |
| 27.304950499391015 | 8.922 |
| 27.314404940729812 | 8.922 |
| 27.323857826340053 | 8.922 |
| 27.33330915622172 | 8.917 |
| 27.342758930374792 | 8.917 |
| 27.352207148799245 | 8.917 |
| 27.36165381149506 | 8.917 |
| 27.371098918462216 | 8.922 |
| 27.380542469700693 | 8.922 |
| 27.389984465210468 | 8.912 |
| 27.39942490499152 | 8.917 |
| 27.408863789043828 | 8.917 |
| 27.41830111736737 | 8.912 |
| 27.42773688996213 | 8.912 |
| 27.43717110682808 | 8.912 |
| 27.446603767965204 | 8.912 |
| 27.456034873373476 | 8.912 |
| 27.46546442305288 | 8.912 |
| 27.47489241700339 | 8.912 |
| 27.484318855224988 | 8.912 |
| 27.49374373771765 | 8.912 |
| 27.50316706448136 | 8.906 |
| 27.51258883551609 | 8.912 |
| 27.522009050821826 | 8.912 |
| 27.531427710398543 | 8.906 |
| 27.540844814246217 | 8.912 |
| 27.55026036236483 | 8.906 |
| 27.559674354754364 | 8.906 |
| 27.56908679141479 | 8.906 |
| 27.578497672346092 | 8.912 |
| 27.58790699754825 | 8.906 |
| 27.59731476702124 | 8.901 |
| 27.606720980765036 | 8.906 |
| 27.616125638779625 | 8.901 |
| 27.625528741064983 | 8.901 |
| 27.63493028762109 | 8.901 |
| 27.64433027844792 | 8.906 |
| 27.653728713545455 | 8.901 |
| 27.663125592913673 | 8.901 |
| 27.672520916552553 | 8.901 |
| 27.681914684462075 | 8.901 |
| 27.691306896642217 | 8.901 |
| 27.700697553092954 | 8.906 |
| 27.71008665381427 | 8.896 |
| 27.71947419880614 | 8.906 |
| 27.728860188068545 | 8.896 |
| 27.73824462160146 | 8.906 |
| 27.747627499404867 | 8.901 |
| 27.757008821478745 | 8.896 |
| 27.766388587823073 | 8.896 |
| 27.775766798437825 | 8.896 |
| 27.785143453322984 | 8.896 |
| 27.79451855247853 | 8.896 |
| 27.803892095904434 | 8.896 |
| 27.813264083600682 | 8.896 |
| 27.82263451556725 | 8.896 |
| 27.832003391804115 | 8.891 |
| 27.841370712311257 | 8.896 |
| 27.850736477088656 | 8.896 |
| 27.86010068613629 | 8.896 |
| 27.869463339454132 | 8.896 |
| 27.87882443704217 | 8.896 |
| 27.888183978900376 | 8.891 |
| 27.89754196502873 | 8.891 |
| 27.90689839542721 | 8.901 |
| 27.916253270095794 | 8.896 |
| 27.925606589034462 | 8.891 |
| 27.934958352243193 | 8.891 |
| 27.944308559721964 | 8.891 |
| 27.953657211470755 | 8.886 |
| 27.963004307489545 | 8.891 |
| 27.972349847778307 | 8.886 |
| 27.981693832337026 | 8.891 |
| 27.99103626116568 | 8.891 |
| 28.00037713426424 | 8.896 |
| 28.009716451632695 | 8.891 |
| 28.019054213271016 | 8.886 |
| 28.028390419179182 | 8.886 |
| 28.037725069357172 | 8.886 |
| 28.04705816380497 | 8.886 |
| 28.056389702522548 | 8.886 |
| 28.065719685509887 | 8.886 |
| 28.07504811276696 | 8.881 |
| 28.084374984293753 | 8.886 |
| 28.09370030009024 | 8.886 |
| 28.1030240601564 | 8.881 |
| 28.112346264492214 | 8.881 |
| 28.121666913097656 | 8.881 |
| 28.13098600597271 | 8.881 |
| 28.140303543117348 | 8.881 |
| 28.149619524531552 | 8.881 |
| 28.1589339502153 | 8.886 |
| 28.16824682016857 | 8.881 |
| 28.17755813439134 | 8.876 |
| 28.186867892883587 | 8.881 |
| 28.196176095645292 | 8.876 |
| 28.20548274267643 | 8.881 |
| 28.214787833976985 | 8.881 |
| 28.22409136954693 | 8.881 |
| 28.233393349386244 | 8.881 |
| 28.242693773494906 | 8.876 |
| 28.251992641872896 | 8.881 |
| 28.261289954520187 | 8.881 |
| 28.270585711436762 | 8.881 |
| 28.279879912622597 | 8.876 |
| 28.28917255807767 | 8.876 |
| 28.298463647801963 | 8.881 |
| 28.30775318179545 | 8.876 |
| 28.31704116005811 | 8.876 |
| 28.326327582589922 | 8.876 |
| 28.335612449390865 | 8.876 |
| 28.344895760460915 | 8.876 |
| 28.354177515800053 | 8.876 |
| 28.363457715408256 | 8.871 |
| 28.3727363592855 | 8.871 |
| 28.382013447431763 | 8.871 |
| 28.391288979847026 | 8.876 |
| 28.400562956531267 | 8.876 |
| 28.409835377484463 | 8.876 |
| 28.41910624270659 | 8.876 |
| 28.42837555219763 | 8.871 |
| 28.437643305957558 | 8.876 |
| 28.446909503986355 | 8.865 |
| 28.456174146283995 | 8.865 |
| 28.465437232850462 | 8.865 |
| 28.47469876368573 | 8.865 |
| 28.483958738789777 | 8.871 |
| 28.493217158162583 | 8.871 |
| 28.502474021804122 | 8.876 |
| 28.511729329714377 | 8.865 |
| 28.520983081893323 | 8.865 |
| 28.53023527834094 | 8.865 |
| 28.539485919057203 | 8.871 |
| 28.54873500404209 | 8.86 |
| 28.557982533295583 | 8.865 |
| 28.567228506817656 | 8.865 |
| 28.57647292460829 | 8.86 |
| 28.58571578666746 | 8.865 |
| 28.59495709299515 | 8.865 |
| 28.60419684359133 | 8.86 |
| 28.613435038455982 | 8.86 |
| 28.622671677589086 | 8.86 |
| 28.631906760990617 | 8.86 |
| 28.64114028866055 | 8.86 |
| 28.65037226059887 | 8.865 |
| 28.65960267680555 | 8.86 |
| 28.66883153728057 | 8.855 |
| 28.67805884202391 | 8.855 |
| 28.68728459103554 | 8.855 |
| 28.69650878431544 | 8.86 |
| 28.705731421863593 | 8.855 |
| 28.714952503679974 | 8.86 |
| 28.724172029764564 | 8.86 |
| 28.733390000117335 | 8.855 |
| 28.742606414738272 | 8.86 |
| 28.751821273627346 | 8.86 |
| 28.76103457678454 | 8.855 |
| 28.77024632420983 | 8.86 |
| 28.779456515903192 | 8.86 |
| 28.788665151864606 | 8.85 |
| 28.797872232094047 | 8.855 |
| 28.807077756591497 | 8.855 |
| 28.81628172535693 | 8.85 |
| 28.825484138390326 | 8.855 |
| 28.834684995691664 | 8.855 |
| 28.843884297260917 | 8.855 |
| 28.853082043098066 | 8.85 |
| 28.86227823320309 | 8.85 |
| 28.871472867575964 | 8.85 |
| 28.880665946216666 | 8.85 |
| 28.889857469125175 | 8.85 |
| 28.89904743630147 | 8.845 |
| 28.908235847745523 | 8.845 |
| 28.91742270345732 | 8.85 |
| 28.926608003436833 | 8.845 |
| 28.93579174768404 | 8.845 |
| 28.94497393619892 | 8.845 |
| 28.95415456898145 | 8.845 |
| 28.96333364603161 | 8.845 |
| 28.972511167349374 | 8.845 |
| 28.981687132934724 | 8.845 |
| 28.99086154278763 | 8.845 |
| 29.000034396908077 | 8.845 |
| 29.009205695296043 | 8.845 |
| 29.0183754379515 | 8.84 |
| 29.02754362487443 | 8.845 |
| 29.036710256064808 | 8.845 |
| 29.045875331522613 | 8.85 |
| 29.055038851247822 | 8.84 |
| 29.06420081524041 | 8.845 |
| 29.073361223500363 | 8.84 |
| 29.082520076027652 | 8.84 |
| 29.091677372822254 | 8.845 |
| 29.100833113884146 | 8.845 |
| 29.10998729921331 | 8.845 |
| 29.11913992880972 | 8.84 |
| 29.128291002673354 | 8.835 |
| 29.13744052080419 | 8.835 |
| 29.14658848320221 | 8.845 |
| 29.155734889867382 | 8.84 |
| 29.16487974079969 | 8.84 |
| 29.174023035999113 | 8.835 |
| 29.183164775465624 | 8.84 |
| 29.192304959199202 | 8.835 |
| 29.201443587199826 | 8.835 |
| 29.21058065946747 | 8.835 |
| 29.219716176002116 | 8.84 |
| 29.228850136803736 | 8.84 |
| 29.237982541872313 | 8.835 |
| 29.247113391207822 | 8.835 |
| 29.25624268481024 | 8.83 |
| 29.265370422679542 | 8.835 |
| 29.27449660481571 | 8.835 |
| 29.283621231218717 | 8.835 |
| 29.292744301888547 | 8.835 |
| 29.30186581682517 | 8.835 |
| 29.31098577602857 | 8.83 |
| 29.320104179498717 | 8.83 |
| 29.329221027235594 | 8.83 |
| 29.338336319239176 | 8.83 |
| 29.34745005550944 | 8.835 |
| 29.35656223604637 | 8.825 |
| 29.365672860849934 | 8.83 |
| 29.37478192992011 | 8.83 |
| 29.383889443256884 | 8.83 |
| 29.392995400860226 | 8.825 |
| 29.402099802730113 | 8.83 |
| 29.411202648866524 | 8.83 |
| 29.420303939269438 | 8.825 |
| 29.42940367393883 | 8.83 |
| 29.438501852874676 | 8.825 |
| 29.44759847607696 | 8.83 |
| 29.45669354354565 | 8.83 |
| 29.46578705528073 | 8.825 |
| 29.474879011282177 | 8.825 |
| 29.483969411549964 | 8.83 |
| 29.49305825608407 | 8.825 |
| 29.50214554488447 | 8.825 |
| 29.511231277951147 | 8.825 |
| 29.520315455284074 | 8.819 |
| 29.52939807688323 | 8.825 |
| 29.53847914274859 | 8.819 |
| 29.54755865288013 | 8.819 |
| 29.556636607277834 | 8.819 |
| 29.565713005941674 | 8.825 |
| 29.57478784887163 | 8.825 |
| 29.583861136067675 | 8.819 |
| 29.59293286752979 | 8.825 |
| 29.602003043257948 | 8.819 |
| 29.61107166325213 | 8.814 |
| 29.620138727512312 | 8.819 |
| 29.629204236038472 | 8.819 |
| 29.638268188830583 | 8.819 |
| 29.647330585888625 | 8.819 |
| 29.656391427212576 | 8.814 |
| 29.66545071280241 | 8.814 |
| 29.67450844265811 | 8.814 |
| 29.683564616779645 | 8.814 |
| 29.692619235166998 | 8.814 |
| 29.701672297820146 | 8.819 |
| 29.71072380473906 | 8.814 |
| 29.719773755923725 | 8.814 |
| 29.728822151374114 | 8.809 |
| 29.737868991090203 | 8.809 |
| 29.74691427507197 | 8.814 |
| 29.755958003319392 | 8.814 |
| 29.765000175832448 | 8.819 |
| 29.774040792611114 | 8.809 |
| 29.783079853655366 | 8.809 |
| 29.79211735896518 | 8.814 |
| 29.801153308540535 | 8.809 |
| 29.810187702381405 | 8.809 |
| 29.81922054048777 | 8.809 |
| 29.828251822859606 | 8.809 |
| 29.83728154949689 | 8.809 |
| 29.8463097203996 | 8.804 |
| 29.85533633556771 | 8.809 |
| 29.8643613950012 | 8.804 |
| 29.873384898700046 | 8.804 |
| 29.88240684666422 | 8.804 |
| 29.89142723889371 | 8.809 |
| 29.90044607538848 | 8.804 |
| 29.909463356148514 | 8.809 |
| 29.91847908117379 | 8.809 |
| 29.92749325046428 | 8.804 |
| 29.936505864019967 | 8.804 |
| 29.945516921840824 | 8.804 |
| 29.954526423926826 | 8.804 |
| 29.96353437027795 | 8.804 |
| 29.97254076089418 | 8.804 |
| 29.981545595775483 | 8.804 |
| 29.990548874921842 | 8.804 |
| 29.999550598333233 | 8.804 |
| 30.00855076600963 | 8.804 |
| 30.017549377951013 | 8.799 |
| 30.026546434157357 | 8.799 |
| 30.03554193462864 | 8.804 |
| 30.044535879364837 | 8.799 |
| 30.053528268365923 | 8.799 |
| 30.062519101631878 | 8.804 |
| 30.07150837916268 | 8.794 |
| 30.080496100958303 | 8.794 |
| 30.089482267018724 | 8.804 |
| 30.09846687734392 | 8.794 |
| 30.107449931933868 | 8.799 |
| 30.116431430788545 | 8.799 |
| 30.125411373907927 | 8.799 |
| 30.134389761291988 | 8.794 |
| 30.14336659294071 | 8.794 |
| 30.152341868854062 | 8.794 |
| 30.16131558903203 | 8.794 |
| 30.170287753474582 | 8.794 |
| 30.179258362181702 | 8.794 |
| 30.188227415153364 | 8.799 |
| 30.19719491238954 | 8.794 |
| 30.206160853890214 | 8.794 |
| 30.215125239655357 | 8.789 |
| 30.22408806968495 | 8.789 |
| 30.233049343978966 | 8.789 |
| 30.242009062537385 | 8.794 |
| 30.25096722536018 | 8.789 |
| 30.25992383244733 | 8.799 |
| 30.26887888379881 | 8.789 |
| 30.277832379414594 | 8.789 |
| 30.286784319294664 | 8.789 |
| 30.295734703438995 | 8.784 |
| 30.304683531847562 | 8.794 |
| 30.313630804520344 | 8.789 |
| 30.32257652145731 | 8.789 |
| 30.331520682658446 | 8.784 |
| 30.340463288123726 | 8.784 |
| 30.349404337853123 | 8.784 |
| 30.358343831846614 | 8.784 |
| 30.367281770104178 | 8.789 |
| 30.37621815262579 | 8.784 |
| 30.385152979411426 | 8.784 |
| 30.394086250461065 | 8.784 |
| 30.40301796577468 | 8.789 |
| 30.41194812535225 | 8.784 |
| 30.42087672919375 | 8.784 |
| 30.429803777299156 | 8.784 |
| 30.438729269668446 | 8.784 |
| 30.447653206301595 | 8.778 |
| 30.45657558719858 | 8.778 |
| 30.465496412359375 | 8.789 |
| 30.47441568178396 | 8.784 |
| 30.483333395472307 | 8.778 |
| 30.492249553424397 | 8.778 |
| 30.501164155640204 | 8.778 |
| 30.510077202119707 | 8.778 |
| 30.518988692862877 | 8.784 |
| 30.527898627869693 | 8.773 |
| 30.536807007140133 | 8.773 |
| 30.545713830674174 | 8.778 |
| 30.55461909847179 | 8.773 |
| 30.563522810532955 | 8.773 |
| 30.57242496685765 | 8.778 |
| 30.581325567445848 | 8.778 |
| 30.590224612297526 | 8.778 |
| 30.59912210141266 | 8.773 |
| 30.608018034791225 | 8.778 |
| 30.6169124124332 | 8.773 |
| 30.62580523433856 | 8.773 |
| 30.63469650050728 | 8.773 |
| 30.64358621093934 | 8.773 |
| 30.652474365634713 | 8.773 |
| 30.661360964593374 | 8.773 |
| 30.6702460078153 | 8.768 |
| 30.67912949530047 | 8.778 |
| 30.688011427048856 | 8.773 |
| 30.69689180306044 | 8.768 |
| 30.70577062333519 | 8.768 |
| 30.714647887873088 | 8.773 |
| 30.72352359667411 | 8.773 |
| 30.73239774973823 | 8.773 |
| 30.741270347065424 | 8.768 |
| 30.75014138865567 | 8.763 |
| 30.759010874508945 | 8.773 |
| 30.767878804625223 | 8.768 |
| 30.77674517900448 | 8.768 |
| 30.785609997646688 | 8.763 |
| 30.79447326055183 | 8.768 |
| 30.803334967719877 | 8.763 |
| 30.81219511915081 | 8.763 |
| 30.821053714844602 | 8.768 |
| 30.82991075480123 | 8.763 |
| 30.838766239020668 | 8.763 |
| 30.847620167502892 | 8.763 |
| 30.856472540247882 | 8.763 |
| 30.865323357255612 | 8.768 |
| 30.874172618526057 | 8.758 |
| 30.883020324059192 | 8.768 |
| 30.891866473854993 | 8.763 |
| 30.900711067913438 | 8.758 |
| 30.909554106234502 | 8.768 |
| 30.91839558881816 | 8.763 |
| 30.92723551566439 | 8.758 |
| 30.936073886773165 | 8.753 |
| 30.944910702144465 | 8.758 |
| 30.953745961778264 | 8.758 |
| 30.962579665674536 | 8.758 |
| 30.971411813833257 | 8.758 |
| 30.980242406254405 | 8.763 |
| 30.989071442937956 | 8.753 |
| 30.997898923883884 | 8.753 |
| 31.006724849092166 | 8.758 |
| 31.01554921856278 | 8.753 |
| 31.024372032295695 | 8.753 |
| 31.033193290290892 | 8.758 |
| 31.042012992548347 | 8.753 |
| 31.050831139068034 | 8.753 |
| 31.05964772984993 | 8.758 |
| 31.06846276489401 | 8.753 |
| 31.077276244200252 | 8.748 |
| 31.08608816776863 | 8.753 |
| 31.094898535599118 | 8.753 |
| 31.103707347691692 | 8.758 |
| 31.112514604046332 | 8.753 |
| 31.12132030466301 | 8.748 |
| 31.1301244495417 | 8.748 |
| 31.138927038682382 | 8.748 |
| 31.14772807208503 | 8.753 |
| 31.156527549749622 | 8.748 |
| 31.16532547167613 | 8.753 |
| 31.174121837864533 | 8.748 |
| 31.1829166483148 | 8.748 |
| 31.191709903026915 | 8.742 |
| 31.20050160200085 | 8.753 |
| 31.209291745236577 | 8.753 |
| 31.21808033273408 | 8.742 |
| 31.226867364493327 | 8.748 |
| 31.235652840514298 | 8.748 |
| 31.244436760796965 | 8.748 |
| 31.253219125341307 | 8.742 |
| 31.261999934147298 | 8.742 |
| 31.270779187214913 | 8.742 |
| 31.27955688454413 | 8.742 |
| 31.288333026134925 | 8.742 |
| 31.29710761198727 | 8.742 |
| 31.30588064210114 | 8.742 |
| 31.314652116476516 | 8.742 |
| 31.32342203511337 | 8.742 |
| 31.332190398011676 | 8.742 |
| 31.34095720517141 | 8.737 |
| 31.349722456592552 | 8.742 |
| 31.358486152275074 | 8.742 |
| 31.36724829221895 | 8.737 |
| 31.37600887642416 | 8.737 |
| 31.384767904890673 | 8.732 |
| 31.39352537761847 | 8.732 |
| 31.402281294607526 | 8.732 |
| 31.411035655857813 | 8.737 |
| 31.419788461369308 | 8.737 |
| 31.428539711141987 | 8.732 |
| 31.437289405175825 | 8.737 |
| 31.446037543470798 | 8.737 |
| 31.454784126026883 | 8.732 |
| 31.463529152844053 | 8.732 |
| 31.472272623922283 | 8.732 |
| 31.48101453926155 | 8.732 |
| 31.48975489886183 | 8.737 |
| 31.498493702723096 | 8.737 |
| 31.507230950845322 | 8.732 |
| 31.515966643228488 | 8.727 |
| 31.524700779872568 | 8.732 |
| 31.533433360777533 | 8.732 |
| 31.542164385943362 | 8.727 |
| 31.55089385537003 | 8.722 |
| 31.559621769057514 | 8.727 |
| 31.568348127005788 | 8.732 |
| 31.577072929214825 | 8.727 |
| 31.585796175684603 | 8.732 |
| 31.594517866415096 | 8.722 |
| 31.60323800140628 | 8.722 |
| 31.611956580658127 | 8.727 |
| 31.62067360417062 | 8.722 |
| 31.629389071943727 | 8.722 |
| 31.638102983977426 | 8.722 |
| 31.64681534027169 | 8.722 |
| 31.6555261408265 | 8.722 |
| 31.664235385641824 | 8.722 |
| 31.67294307471764 | 8.727 |
| 31.681649208053923 | 8.722 |
| 31.69035378565065 | 8.722 |
| 31.699056807507795 | 8.727 |
| 31.70775827362533 | 8.722 |
| 31.716458184003237 | 8.717 |
| 31.725156538641485 | 8.717 |
| 31.73385333754005 | 8.722 |
| 31.742548580698912 | 8.722 |
| 31.75124226811804 | 8.717 |
| 31.759934399797412 | 8.712 |
| 31.768624975737 | 8.722 |
| 31.777313995936787 | 8.717 |
| 31.78600146039674 | 8.717 |
| 31.794687369116836 | 8.717 |
| 31.80337172209705 | 8.717 |
| 31.812054519337362 | 8.722 |
| 31.820735760837742 | 8.712 |
| 31.829415446598166 | 8.717 |
| 31.838093576618608 | 8.712 |
| 31.846770150899044 | 8.712 |
| 31.85544516943945 | 8.707 |
| 31.864118632239798 | 8.707 |
| 31.872790539300066 | 8.712 |
| 31.88146089062023 | 8.712 |
| 31.890129686200257 | 8.712 |
| 31.89879692604013 | 8.712 |
| 31.907462610139824 | 8.707 |
| 31.91612673849931 | 8.707 |
| 31.924789311118566 | 8.712 |
| 31.933450327997566 | 8.712 |
| 31.942109789136282 | 8.707 |
| 31.950767694534694 | 8.712 |
| 31.959424044192772 | 8.707 |
| 31.968078838110493 | 8.707 |
| 31.97673207628783 | 8.707 |
| 31.985383758724762 | 8.712 |
| 31.99403388542126 | 8.701 |
| 32.0026824563773 | 8.701 |
| 32.01132947159286 | 8.707 |
| 32.01997493106791 | 8.701 |
| 32.02861883480242 | 8.707 |
| 32.037261182796385 | 8.701 |
| 32.04590197504976 | 8.707 |
| 32.05454121156253 | 8.701 |
| 32.06317889233466 | 8.701 |
| 32.071815017366134 | 8.701 |
| 32.080449586656925 | 8.707 |
| 32.08908260020701 | 8.701 |
| 32.09771405801635 | 8.701 |
| 32.106343960084935 | 8.701 |
| 32.11497230641273 | 8.707 |
| 32.12359909699972 | 8.696 |
| 32.13222433184587 | 8.701 |
| 32.14084801095116 | 8.696 |
| 32.149470134315564 | 8.696 |
| 32.15809070193906 | 8.701 |
| 32.16670971382162 | 8.696 |
| 32.17532716996321 | 8.696 |
| 32.18394307036382 | 8.696 |
| 32.19255741502341 | 8.701 |
| 32.20117020394196 | 8.696 |
| 32.20978143711945 | 8.696 |
| 32.21839111455585 | 8.696 |
| 32.22699923625113 | 8.696 |
| 32.23560580220528 | 8.696 |
| 32.24421081241825 | 8.691 |
| 32.25281426689004 | 8.691 |
| 32.26141616562061 | 8.691 |
| 32.270016508609935 | 8.691 |
| 32.278615295857996 | 8.691 |
| 32.287212527364765 | 8.691 |
| 32.295808203130214 | 8.691 |
| 32.30440232315432 | 8.691 |
| 32.31299488743706 | 8.696 |
| 32.321585895978394 | 8.691 |
| 32.33017534877831 | 8.691 |
| 32.33876324583679 | 8.681 |
| 32.34734958715379 | 8.686 |
| 32.3559343727293 | 8.691 |
| 32.36451760256328 | 8.691 |
| 32.373099276655715 | 8.686 |
| 32.38167939500658 | 8.686 |
| 32.39025795761584 | 8.681 |
| 32.39883496448348 | 8.691 |
| 32.40741041560946 | 8.686 |
| 32.41598431099377 | 8.681 |
| 32.42455665063638 | 8.681 |
| 32.43312743453726 | 8.681 |
| 32.441696662696394 | 8.681 |
| 32.450264335113744 | 8.686 |
| 32.45883045178929 | 8.686 |
| 32.467395012723 | 8.681 |
| 32.47595801791486 | 8.681 |
| 32.48451946736484 | 8.681 |
| 32.493079361072915 | 8.681 |
| 32.50163769903906 | 8.681 |
| 32.51019448126324 | 8.681 |
| 32.51874970774544 | 8.681 |
| 32.527303378485634 | 8.681 |
| 32.53585549348379 | 8.676 |
| 32.54440605273988 | 8.676 |
| 32.552955056253886 | 8.681 |
| 32.561502504025775 | 8.676 |
| 32.570048396055526 | 8.676 |
| 32.57859273234312 | 8.676 |
| 32.587135512888516 | 8.676 |
| 32.5956767376917 | 8.676 |
| 32.60421640675264 | 8.681 |
| 32.61275452007131 | 8.671 |
| 32.62129107764769 | 8.676 |
| 32.62982607948175 | 8.671 |
| 32.63835952557347 | 8.676 |
| 32.646891415922816 | 8.671 |
| 32.65542175052977 | 8.671 |
| 32.6639505293943 | 8.676 |
| 32.67247775251638 | 8.671 |
| 32.68100341989598 | 8.671 |
| 32.68952753153308 | 8.671 |
| 32.69805008742766 | 8.676 |
| 32.70657108757968 | 8.666 |
| 32.71509053198913 | 8.671 |
| 32.72360842065597 | 8.671 |
| 32.73212475358019 | 8.666 |
| 32.74063953076175 | 8.666 |
| 32.74915275220062 | 8.666 |
| 32.75766441789679 | 8.666 |
| 32.766174527850225 | 8.671 |
| 32.7746830820609 | 8.666 |
| 32.78319008052879 | 8.66 |
| 32.791695523253864 | 8.666 |
| 32.800199410236104 | 8.666 |
| 32.80870174147548 | 8.66 |
| 32.81720251697197 | 8.66 |
| 32.825701736725534 | 8.666 |
| 32.83419940073616 | 8.66 |
| 32.84269550900382 | 8.666 |
| 32.851190061528484 | 8.666 |
| 32.85968305831013 | 8.66 |
| 32.86817449934873 | 8.66 |
| 32.87666438464426 | 8.66 |
| 32.885152714196686 | 8.66 |
| 32.89363948800599 | 8.655 |
| 32.902124706072144 | 8.666 |
| 32.91060836839512 | 8.655 |
| 32.91909047497489 | 8.655 |
| 32.92757102581143 | 8.66 |
| 32.936050020904716 | 8.655 |
| 32.94452746025472 | 8.66 |
| 32.95300334386142 | 8.655 |
| 32.96147767172478 | 8.655 |
| 32.96995044384478 | 8.65 |
| 32.9784216602214 | 8.66 |
| 32.9868913208546 | 8.66 |
| 32.99535942574437 | 8.65 |
| 33.00382597489067 | 8.655 |
| 33.01229096829348 | 8.65 |
| 33.020754405952765 | 8.65 |
| 33.02921628786851 | 8.65 |
| 33.037676614040684 | 8.65 |
| 33.04613538446927 | 8.655 |
| 33.05459259915422 | 8.645 |
| 33.06304825809553 | 8.65 |
| 33.071502361293156 | 8.645 |
| 33.079954908747084 | 8.65 |
| 33.08840590045728 | 8.645 |
| 33.09685533642373 | 8.65 |
| 33.10530321664639 | 8.65 |
| 33.113749541125244 | 8.645 |
| 33.12219430986027 | 8.645 |
| 33.13063752285143 | 8.645 |
| 33.139079180098705 | 8.645 |
| 33.147519281602065 | 8.645 |
| 33.15595782736149 | 8.65 |
| 33.164394817376945 | 8.64 |
| 33.172830251648406 | 8.64 |
| 33.181264130175855 | 8.645 |
| 33.189696452959254 | 8.645 |
| 33.19812721999858 | 8.64 |
| 33.20655643129381 | 8.64 |
| 33.21498408684492 | 8.645 |
| 33.223410186651876 | 8.64 |
| 33.23183473071465 | 8.64 |
| 33.240257719033224 | 8.64 |
| 33.24867915160757 | 8.64 |
| 33.25709902843765 | 8.64 |
| 33.26551734952345 | 8.64 |
| 33.273934114864936 | 8.645 |
| 33.28234932446209 | 8.635 |
| 33.29076297831488 | 8.635 |
| 33.29917507642328 | 8.64 |
| 33.307585618787265 | 8.64 |
| 33.3159946054068 | 8.635 |
| 33.32440203628187 | 8.635 |
| 33.33280791141244 | 8.635 |
| 33.34121223079848 | 8.635 |
| 33.34961499443998 | 8.635 |
| 33.358016202336906 | 8.63 |
| 33.366415854489226 | 8.635 |
| 33.374813950896915 | 8.635 |
| 33.38321049155994 | 8.63 |
| 33.39160547647829 | 8.635 |
| 33.39999890565193 | 8.63 |
| 33.408390779080825 | 8.635 |
| 33.416781096764964 | 8.63 |
| 33.42516985870431 | 8.63 |
| 33.433557064898835 | 8.635 |
| 33.44194271534852 | 8.625 |
| 33.45032681005333 | 8.63 |
| 33.45870934901325 | 8.625 |
| 33.46709033222824 | 8.625 |
| 33.47546975969828 | 8.625 |
| 33.48384763142334 | 8.63 |
| 33.492223947403396 | 8.625 |
| 33.500598707638424 | 8.63 |
| 33.508971912128395 | 8.63 |
| 33.51734356087328 | 8.62 |
| 33.52571365387305 | 8.625 |
| 33.53408219112768 | 8.625 |
| 33.54244917263715 | 8.625 |
| 33.55081459840142 | 8.625 |
| 33.55917846842048 | 8.62 |
| 33.56754078269428 | 8.62 |
| 33.57590154122281 | 8.62 |
| 33.584260744006045 | 8.63 |
| 33.59261839104395 | 8.62 |
| 33.6009744823365 | 8.62 |
| 33.60932901788367 | 8.62 |
| 33.61768199768543 | 8.62 |
| 33.62603342174176 | 8.62 |
| 33.634383290052625 | 8.614 |
| 33.642731602618 | 8.614 |
| 33.651078359437854 | 8.62 |
| 33.65942356051217 | 8.614 |
| 33.66776720584091 | 8.62 |
| 33.676109295424055 | 8.62 |
| 33.684449829261574 | 8.614 |
| 33.692788807353445 | 8.614 |
| 33.70112622969964 | 8.62 |
| 33.70946209630012 | 8.609 |
| 33.71779640715488 | 8.609 |
| 33.726129162263874 | 8.614 |
| 33.73446036162708 | 8.609 |
| 33.74279000524447 | 8.614 |
| 33.75111809311603 | 8.609 |
| 33.75944462524171 | 8.609 |
| 33.7677696016215 | 8.614 |
| 33.77609302225537 | 8.604 |
| 33.78441488714328 | 8.604 |
| 33.792735196285214 | 8.604 |
| 33.80105394968115 | 8.609 |
| 33.80937114733105 | 8.609 |
| 33.81768678923489 | 8.604 |
| 33.82600087539265 | 8.604 |
| 33.834313405804295 | 8.609 |
| 33.8426243804698 | 8.604 |
| 33.85093379938914 | 8.604 |
| 33.85924166256228 | 8.599 |
| 33.867547969989204 | 8.604 |
| 33.87585272166987 | 8.604 |
| 33.88415591760427 | 8.609 |
| 33.892457557792355 | 8.599 |
| 33.90075764223411 | 8.604 |
| 33.90905617092951 | 8.604 |
| 33.91735314387852 | 8.604 |
| 33.92564856108112 | 8.599 |
| 33.93394242253728 | 8.599 |
| 33.942234728246966 | 8.599 |
| 33.95052547821016 | 8.599 |
| 33.95881467242683 | 8.599 |
| 33.967102310896955 | 8.594 |
| 33.9753883936205 | 8.594 |
| 33.983672920597435 | 8.594 |
| 33.99195589182774 | 8.594 |
| 34.00023730731139 | 8.594 |
| 34.008517167048346 | 8.599 |
| 34.01679547103859 | 8.599 |
| 34.025072219282094 | 8.594 |
| 34.03334741177883 | 8.594 |
| 34.04162104852876 | 8.589 |
| 34.04989312953187 | 8.589 |
| 34.058163654788125 | 8.594 |
| 34.0664326242975 | 8.589 |
| 34.074700038059966 | 8.594 |
| 34.0829658960755 | 8.594 |
| 34.09123019834407 | 8.594 |
| 34.09949294486565 | 8.589 |
| 34.107754135640214 | 8.589 |
| 34.11601377066773 | 8.589 |
| 34.12427184994817 | 8.589 |
| 34.13252837348151 | 8.589 |
| 34.14078334126773 | 8.589 |
| 34.14903675330679 | 8.589 |
| 34.157288609598666 | 8.594 |
| 34.16553891014333 | 8.589 |
| 34.17378765494076 | 8.584 |
| 34.18203484399092 | 8.584 |
| 34.19028047729378 | 8.584 |
| 34.19852455484933 | 8.584 |
| 34.20676707665752 | 8.579 |
| 34.21500804271834 | 8.589 |
| 34.22324745303175 | 8.579 |
| 34.23148530759773 | 8.584 |
| 34.239721606416246 | 8.584 |
| 34.247956349487275 | 8.579 |
| 34.25618953681079 | 8.584 |
| 34.26442116838676 | 8.584 |
| 34.27265124421516 | 8.579 |
| 34.28087976429596 | 8.579 |
| 34.289106728629136 | 8.579 |
| 34.29733213721465 | 8.579 |
| 34.30555599005249 | 8.573 |
| 34.31377828714262 | 8.579 |
| 34.321999028485 | 8.573 |
| 34.33021821407962 | 8.579 |
| 34.33843584392645 | 8.573 |
| 34.34665191802545 | 8.573 |
| 34.354866436376604 | 8.579 |
| 34.36307939897988 | 8.579 |
| 34.37129080583525 | 8.579 |
| 34.37950065694269 | 8.579 |
| 34.38770895230216 | 8.573 |
| 34.39591569191365 | 8.579 |
| 34.40412087577712 | 8.568 |
| 34.41232450389254 | 8.573 |
| 34.420526576259896 | 8.568 |
| 34.42872709287914 | 8.573 |
| 34.43692605375026 | 8.568 |
| 34.445123458873226 | 8.568 |
| 34.453319308248005 | 8.573 |
| 34.46151360187457 | 8.563 |
| 34.469706339752896 | 8.563 |
| 34.47789752188295 | 8.568 |
| 34.48608714826471 | 8.568 |
| 34.49427521889814 | 8.573 |
| 34.502461733783214 | 8.563 |
| 34.510646692919906 | 8.563 |
| 34.518830096308186 | 8.563 |
| 34.52701194394803 | 8.568 |
| 34.53519223583941 | 8.563 |
| 34.5433709719823 | 8.568 |
| 34.55154815237666 | 8.568 |
| 34.55972377702247 | 8.563 |
| 34.5678978459197 | 8.563 |
| 34.57607035906833 | 8.563 |
| 34.58424131646832 | 8.563 |
| 34.59241071811965 | 8.568 |
| 34.600578564022285 | 8.563 |
| 34.6087448541762 | 8.558 |
| 34.61690958858137 | 8.558 |
| 34.62507276723776 | 8.558 |
| 34.63323439014535 | 8.558 |
| 34.6413944573041 | 8.558 |
| 34.649552968714 | 8.553 |
| 34.657709924375006 | 8.558 |
| 34.66586532428709 | 8.553 |
| 34.67401916845023 | 8.553 |
| 34.682171456864396 | 8.553 |
| 34.69032218952956 | 8.553 |
| 34.698471366445695 | 8.553 |
| 34.70661898761277 | 8.558 |
| 34.71476505303076 | 8.553 |
| 34.72290956269963 | 8.558 |
| 34.73105251661935 | 8.553 |
| 34.7391939147899 | 8.548 |
| 34.74733375721125 | 8.553 |
| 34.75547204388337 | 8.558 |
| 34.76360877480624 | 8.548 |
| 34.771743949979815 | 8.548 |
| 34.77987756940408 | 8.548 |
| 34.788009633079 | 8.548 |
| 34.79614014100455 | 8.548 |
| 34.8042690931807 | 8.548 |
| 34.812396489607416 | 8.548 |
| 34.820522330284675 | 8.548 |
| 34.82864661521245 | 8.543 |
| 34.83676934439071 | 8.553 |
| 34.84489051781943 | 8.543 |
| 34.85301013549858 | 8.543 |
| 34.86112819742812 | 8.548 |
| 34.86924470360804 | 8.537 |
| 34.8773596540383 | 8.548 |
| 34.88547304871888 | 8.543 |
| 34.89358488764974 | 8.543 |
| 34.901695170830855 | 8.548 |
| 34.909803898262204 | 8.537 |
| 34.91791106994375 | 8.537 |
| 34.92601668587547 | 8.537 |
| 34.934120746057324 | 8.537 |
| 34.9422232504893 | 8.543 |
| 34.950324199171355 | 8.537 |
| 34.95842359210347 | 8.532 |
| 34.96652142928561 | 8.537 |
| 34.97461771071776 | 8.537 |
| 34.98271243639987 | 8.537 |
| 34.990805606331925 | 8.532 |
| 34.99889722051389 | 8.532 |
| 35.00698727894574 | 8.537 |
| 35.01507578162745 | 8.537 |
| 35.02316272855899 | 8.527 |
| 35.03124811974032 | 8.527 |
| 35.03933195517142 | 8.527 |
| 35.04741423485226 | 8.532 |
| 35.055494958782816 | 8.527 |
| 35.06357412696305 | 8.532 |
| 35.071651739392934 | 8.527 |
| 35.07972779607245 | 8.527 |
| 35.08780229700155 | 8.532 |
| 35.09587524218023 | 8.527 |
| 35.10394663160844 | 8.522 |
| 35.11201646528616 | 8.527 |
| 35.12008474321336 | 8.522 |
| 35.12815146539001 | 8.527 |
| 35.13621663181609 | 8.522 |
| 35.14428024249156 | 8.522 |
| 35.152342297416396 | 8.532 |
| 35.16040279659057 | 8.522 |
| 35.168461740014045 | 8.522 |
| 35.1765191276868 | 8.522 |
| 35.1845749596088 | 8.527 |
| 35.192629235780025 | 8.517 |
| 35.20068195620044 | 8.522 |
| 35.208733120870015 | 8.522 |
| 35.216782729788726 | 8.522 |
| 35.22483078295654 | 8.522 |
| 35.23287728037342 | 8.517 |
| 35.24092222203935 | 8.517 |
| 35.2489656079543 | 8.522 |
| 35.25700743811823 | 8.517 |
| 35.26504771253112 | 8.517 |
| 35.273086431192944 | 8.517 |
| 35.28112359410366 | 8.512 |
| 35.28915920126325 | 8.517 |
| 35.29719325267168 | 8.512 |
| 35.30522574832893 | 8.517 |
| 35.31325668823496 | 8.517 |
| 35.32128607238974 | 8.512 |
| 35.329313900793245 | 8.507 |
| 35.33734017344545 | 8.517 |
| 35.34536489034632 | 8.512 |
| 35.35338805149583 | 8.517 |
| 35.36140965689394 | 8.512 |
| 35.369429706540636 | 8.512 |
| 35.37744820043588 | 8.512 |
| 35.38546513857964 | 8.507 |
| 35.39348052097189 | 8.507 |
| 35.401494347612605 | 8.507 |
| 35.40950661850175 | 8.507 |
| 35.4175173336393 | 8.507 |
| 35.425526493025224 | 8.507 |
| 35.43353409665949 | 8.507 |
| 35.441540144542074 | 8.507 |
| 35.44954463667294 | 8.502 |
| 35.45754757305206 | 8.507 |
| 35.46554895367941 | 8.507 |
| 35.47354877855496 | 8.502 |
| 35.48154704767867 | 8.502 |
| 35.48954376105052 | 8.507 |
| 35.49753891867048 | 8.507 |
| 35.505532520538516 | 8.502 |
| 35.5135245666546 | 8.496 |
| 35.52151505701871 | 8.507 |
| 35.52950399163081 | 8.496 |
| 35.537491370490876 | 8.496 |
| 35.54547719359887 | 8.502 |
| 35.553461460954765 | 8.502 |
| 35.56144417255854 | 8.496 |
| 35.569425328410155 | 8.496 |
| 35.57740492850958 | 8.496 |
| 35.58538297285679 | 8.496 |
| 35.593359461451755 | 8.496 |
| 35.60133439429445 | 8.491 |
| 35.609307771384834 | 8.496 |
| 35.61727959272289 | 8.491 |
| 35.62524985830858 | 8.491 |
| 35.63321856814187 | 8.496 |
| 35.641185722222744 | 8.496 |
| 35.64915132055116 | 8.491 |
| 35.6571153631271 | 8.491 |
| 35.66507784995052 | 8.491 |
| 35.673038781021404 | 8.491 |
| 35.68099815633972 | 8.486 |
| 35.68895597590543 | 8.491 |
| 35.69691223971851 | 8.486 |
| 35.704866947778925 | 8.486 |
| 35.71282010008665 | 8.486 |
| 35.72077169664166 | 8.486 |
| 35.72872173744392 | 8.481 |
| 35.736670222493395 | 8.486 |
| 35.74461715179007 | 8.486 |
| 35.75256252533389 | 8.486 |
| 35.76050634312485 | 8.486 |
| 35.76844860516292 | 8.481 |
| 35.77638931144805 | 8.486 |
| 35.78432846198022 | 8.481 |
| 35.79226605675941 | 8.481 |
| 35.80020209578558 | 8.486 |
| 35.8081365790587 | 8.486 |
| 35.816069506578735 | 8.476 |
| 35.824000878345664 | 8.476 |
| 35.83193069435946 | 8.476 |
| 35.839858954620084 | 8.481 |
| 35.84778565912751 | 8.476 |
| 35.85571080788171 | 8.476 |
| 35.863634400882646 | 8.476 |
| 35.8715564381303 | 8.471 |
| 35.879476919624636 | 8.471 |
| 35.887395845365624 | 8.476 |
| 35.895313215353234 | 8.471 |
| 35.903229029587436 | 8.476 |
| 35.911143288068196 | 8.471 |
| 35.91905599079549 | 8.471 |
| 35.92696713776929 | 8.471 |
| 35.93487672898956 | 8.471 |
| 35.94278476445627 | 8.471 |
| 35.95069124416939 | 8.466 |
| 35.95859616812889 | 8.466 |
| 35.966499536334744 | 8.466 |
| 35.97440134878692 | 8.466 |
| 35.98230160548539 | 8.466 |
| 35.99020030643012 | 8.466 |
| 35.99809745162108 | 8.471 |
| 36.00599304105824 | 8.466 |
| 36.01388707474157 | 8.466 |
| 36.021779552671035 | 8.471 |
| 36.02967047484661 | 8.461 |
| 36.03755984126827 | 8.461 |
| 36.04544765193597 | 8.461 |
| 36.0533339068497 | 8.466 |
| 36.06121860600942 | 8.461 |
| 36.06910174941509 | 8.461 |
| 36.07698333706669 | 8.461 |
| 36.08486336896419 | 8.461 |
| 36.09274184510756 | 8.455 |
| 36.10061876549676 | 8.455 |
| 36.108494130131774 | 8.466 |
| 36.11636793901256 | 8.455 |
| 36.1242401921391 | 8.455 |
| 36.132110889511345 | 8.455 |
| 36.139980031129284 | 8.45 |
| 36.14784761699288 | 8.455 |
| 36.15571364710209 | 8.45 |
| 36.1635781214569 | 8.455 |
| 36.171441040057275 | 8.461 |
| 36.17930240290318 | 8.45 |
| 36.18716220999459 | 8.455 |
| 36.19502046133147 | 8.45 |
| 36.202877156913786 | 8.445 |
| 36.21073229674152 | 8.45 |
| 36.218585880814636 | 8.45 |
| 36.226437909133104 | 8.45 |
| 36.234288381696885 | 8.45 |
| 36.24213729850596 | 8.45 |
| 36.24998465956029 | 8.45 |
| 36.25783046485985 | 8.445 |
| 36.26567471440461 | 8.445 |
| 36.273517408194536 | 8.445 |
| 36.2813585462296 | 8.445 |
| 36.28919812850977 | 8.445 |
| 36.29703615503501 | 8.445 |
| 36.304872625805295 | 8.44 |
| 36.3127075408206 | 8.445 |
| 36.32054090008088 | 8.44 |
| 36.32837270358611 | 8.445 |
| 36.33620295133627 | 8.44 |
| 36.34403164333131 | 8.435 |
| 36.351858779571224 | 8.435 |
| 36.35968436005596 | 8.44 |
| 36.367508384785495 | 8.435 |
| 36.3753308537598 | 8.435 |
| 36.38315176697884 | 8.44 |
| 36.390971124442586 | 8.44 |
| 36.398788926151006 | 8.435 |
| 36.40660517210407 | 8.435 |
| 36.414419862301756 | 8.435 |
| 36.42223299674402 | 8.43 |
| 36.43004457543084 | 8.435 |
| 36.43785459836218 | 8.435 |
| 36.44566306553801 | 8.43 |
| 36.453469976958296 | 8.43 |
| 36.46127533262302 | 8.43 |
| 36.46907913253214 | 8.425 |
| 36.47688137668562 | 8.43 |
| 36.48468206508344 | 8.43 |
| 36.49248119772557 | 8.425 |
| 36.500278774611964 | 8.43 |
| 36.50807479574261 | 8.425 |
| 36.515869261117466 | 8.425 |
| 36.5236621707365 | 8.425 |
| 36.531453524599684 | 8.425 |
| 36.53924332270699 | 8.43 |
| 36.54703156505838 | 8.425 |
| 36.554818251653835 | 8.425 |
| 36.562603382493315 | 8.42 |
| 36.57038695757679 | 8.42 |
| 36.57816897690422 | 8.425 |
| 36.585949440475595 | 8.42 |
| 36.59372834829087 | 8.42 |
| 36.60150570035001 | 8.42 |
| 36.60928149665299 | 8.42 |
| 36.61705573719978 | 8.42 |
| 36.624828421990344 | 8.415 |
| 36.632599551024654 | 8.42 |
| 36.64036912430268 | 8.415 |
| 36.64813714182439 | 8.415 |
| 36.655903603589756 | 8.42 |
| 36.66366850959874 | 8.415 |
| 36.67143185985132 | 8.415 |
| 36.67919365434745 | 8.415 |
| 36.686953893087114 | 8.409 |
| 36.69471257607027 | 8.409 |
| 36.7024697032969 | 8.409 |
| 36.710225274766955 | 8.409 |
| 36.717979290480415 | 8.415 |
| 36.72573175043725 | 8.409 |
| 36.73348265463742 | 8.409 |
| 36.7412320030809 | 8.404 |
| 36.74897979576766 | 8.404 |
| 36.756726032697664 | 8.404 |
| 36.76447071387088 | 8.404 |
| 36.772213839287275 | 8.404 |
| 36.779955408946826 | 8.409 |
| 36.787695422849495 | 8.404 |
| 36.795433880995255 | 8.404 |
| 36.803170783384076 | 8.404 |
| 36.81090613001592 | 8.399 |
| 36.81863992089076 | 8.404 |
| 36.82637215600856 | 8.404 |
| 36.83410283536929 | 8.399 |
| 36.841831958972925 | 8.399 |
| 36.84955952681943 | 8.404 |
| 36.85728553890876 | 8.404 |
| 36.865009995240904 | 8.404 |
| 36.87273289581582 | 8.399 |
| 36.88045424063348 | 8.399 |
| 36.88817402969385 | 8.399 |
| 36.8958922629969 | 8.399 |
| 36.9036089405426 | 8.394 |
| 36.91132406233091 | 8.394 |
| 36.91903762836181 | 8.399 |
| 36.92674963863526 | 8.399 |
| 36.93446009315123 | 8.399 |
| 36.94216899190969 | 8.399 |
| 36.949876334910606 | 8.394 |
| 36.95758212215395 | 8.389 |
| 36.96528635363969 | 8.394 |
| 36.97298902936779 | 8.394 |
| 36.980690149338216 | 8.389 |
| 36.988389713550944 | 8.389 |
| 36.99608772200594 | 8.394 |
| 37.00378417470317 | 8.394 |
| 37.011479071642604 | 8.389 |
| 37.01917241282421 | 8.389 |
| 37.02686419824796 | 8.384 |
| 37.03455442791381 | 8.384 |
| 37.04224310182174 | 8.389 |
| 37.04993021997171 | 8.384 |
| 37.057615782363705 | 8.384 |
| 37.06529978899768 | 8.389 |
| 37.072982239873596 | 8.384 |
| 37.08066313499143 | 8.384 |
| 37.08834247435115 | 8.379 |
| 37.09602025795272 | 8.384 |
| 37.10369648579612 | 8.379 |
| 37.11137115788131 | 8.384 |
| 37.11904427420825 | 8.379 |
| 37.12671583477692 | 8.373 |
| 37.134385839587274 | 8.373 |
| 37.142054288639294 | 8.379 |
| 37.14972118193295 | 8.373 |
| 37.1573865194682 | 8.373 |
| 37.16505030124501 | 8.373 |
| 37.17271252726336 | 8.373 |
| 37.1803731975232 | 8.368 |
| 37.18803231202452 | 8.373 |
| 37.195689870767275 | 8.368 |
| 37.20334587375143 | 8.368 |
| 37.211000320976964 | 8.368 |
| 37.21865321244383 | 8.368 |
| 37.226304548152015 | 8.368 |
| 37.23395432810147 | 8.368 |
| 37.24160255229217 | 8.368 |
| 37.24924922072408 | 8.368 |
| 37.25689433339717 | 8.368 |
| 37.26453789031141 | 8.368 |
| 37.27217989146676 | 8.363 |
| 37.2798203368632 | 8.363 |
| 37.287459226500694 | 8.363 |
| 37.2950965603792 | 8.363 |
| 37.30273233849869 | 8.363 |
| 37.31036656085914 | 8.363 |
| 37.317999227460504 | 8.363 |
| 37.325630338302766 | 8.363 |
| 37.33325989338588 | 8.358 |
| 37.340887892709816 | 8.353 |
| 37.34851433627455 | 8.363 |
| 37.35613922408004 | 8.358 |
| 37.36376255612626 | 8.358 |
| 37.37138433241318 | 8.353 |
| 37.379004552940756 | 8.353 |
| 37.386623217708966 | 8.353 |
| 37.39424032671777 | 8.353 |
| 37.401855879967144 | 8.353 |
| 37.40946987745705 | 8.353 |
| 37.41708231918745 | 8.353 |
| 37.42469320515832 | 8.353 |
| 37.43230253536963 | 8.353 |
| 37.43991030982134 | 8.353 |
| 37.447516528513425 | 8.353 |
| 37.45512119144585 | 8.348 |
| 37.462724298618575 | 8.343 |
| 37.47032585003157 | 8.343 |
| 37.47792584568481 | 8.343 |
| 37.48552428557825 | 8.348 |
| 37.49312116971187 | 8.343 |
| 37.50071649808563 | 8.343 |
| 37.5083102706995 | 8.343 |
| 37.515902487553454 | 8.343 |
| 37.52349314864745 | 8.343 |
| 37.53108225398145 | 8.343 |
| 37.538669803555436 | 8.343 |
| 37.54625579736937 | 8.343 |
| 37.553840235423216 | 8.338 |
| 37.56142311771694 | 8.338 |
| 37.56900444425052 | 8.338 |
| 37.57658421502391 | 8.338 |
| 37.584162430037075 | 8.338 |
| 37.591739089289995 | 8.332 |
| 37.599314192782636 | 8.332 |
| 37.606887740514956 | 8.332 |
| 37.61445973248693 | 8.338 |
| 37.62203016869852 | 8.338 |
| 37.629599049149704 | 8.332 |
| 37.63716637384044 | 8.332 |
| 37.644732142770685 | 8.327 |
| 37.65229635594042 | 8.332 |
| 37.65985901334962 | 8.327 |
| 37.66742011499823 | 8.332 |
| 37.67497966088623 | 8.327 |
| 37.68253765101359 | 8.338 |
| 37.69009408538027 | 8.332 |
| 37.69764896398624 | 8.332 |
| 37.705202286831465 | 8.332 |
| 37.712754053915916 | 8.322 |
| 37.720304265239555 | 8.327 |
| 37.727852920802356 | 8.322 |
| 37.735400020604274 | 8.327 |
| 37.74294556464529 | 8.322 |
| 37.75048955292536 | 8.322 |
| 37.758031985444454 | 8.317 |
| 37.76557286220254 | 8.322 |
| 37.773112183199586 | 8.317 |
| 37.78064994843556 | 8.317 |
| 37.788186157910424 | 8.322 |
| 37.79572081162415 | 8.317 |
| 37.8032539095767 | 8.322 |
| 37.81078545176805 | 8.317 |
| 37.818315438198155 | 8.322 |
| 37.82584386886699 | 8.317 |
| 37.833370743774516 | 8.317 |
| 37.8408960629207 | 8.322 |
| 37.84841982630551 | 8.317 |
| 37.85594203392892 | 8.312 |
| 37.863462685790886 | 8.322 |
| 37.87098178189138 | 8.312 |
| 37.87849932223037 | 8.312 |
| 37.88601530680782 | 8.307 |
| 37.893529735623694 | 8.312 |
| 37.90104260867796 | 8.312 |
| 37.908553925970594 | 8.312 |
| 37.916063687501556 | 8.312 |
| 37.92357189327081 | 8.312 |
| 37.931078543278325 | 8.312 |
| 37.93858363752406 | 8.307 |
| 37.94608717600799 | 8.312 |
| 37.95358915873009 | 8.307 |
| 37.96108958569031 | 8.312 |
| 37.968588456888625 | 8.307 |
| 37.976085772325 | 8.302 |
| 37.9835815319994 | 8.302 |
| 37.99107573591179 | 8.302 |
| 37.998568384062146 | 8.302 |
| 38.006059476450424 | 8.307 |
| 38.01354901307659 | 8.302 |
| 38.02103699394062 | 8.307 |
| 38.02852341904247 | 8.297 |
| 38.036008288382114 | 8.302 |
| 38.043491601959516 | 8.302 |
| 38.050973359774645 | 8.302 |
| 38.05845356182746 | 8.297 |
| 38.065932208117935 | 8.297 |
| 38.073409298646034 | 8.291 |
| 38.08088483341172 | 8.297 |
| 38.08835881241497 | 8.291 |
| 38.09583123565573 | 8.291 |
| 38.103302103133984 | 8.297 |
| 38.110771414849694 | 8.291 |
| 38.11823917080282 | 8.297 |
| 38.12570537099334 | 8.291 |
| 38.13317001542121 | 8.291 |
| 38.1406331040864 | 8.291 |
| 38.14809463698887 | 8.286 |
| 38.1555546141286 | 8.286 |
| 38.16301303550554 | 8.281 |
| 38.170469901119674 | 8.286 |
| 38.177925210970955 | 8.286 |
| 38.18537896505935 | 8.281 |
| 38.19283116338483 | 8.286 |
| 38.20028180594736 | 8.281 |
| 38.20773089274691 | 8.281 |
| 38.215178423783435 | 8.281 |
| 38.222624399056905 | 8.281 |
| 38.23006881856729 | 8.276 |
| 38.237511682314555 | 8.276 |
| 38.244952990298664 | 8.276 |
| 38.25239274251958 | 8.271 |
| 38.25983093897728 | 8.276 |
| 38.267267579671724 | 8.276 |
| 38.27470266460288 | 8.271 |
| 38.282136193770704 | 8.271 |
| 38.28956816717517 | 8.276 |
| 38.296998584816244 | 8.271 |
| 38.304427446693886 | 8.271 |
| 38.31185475280807 | 8.271 |
| 38.31928050315876 | 8.271 |
| 38.32670469774592 | 8.266 |
| 38.33412733656951 | 8.271 |
| 38.341548419629504 | 8.266 |
| 38.34896794692587 | 8.266 |
| 38.356385918458564 | 8.266 |
| 38.363802334227564 | 8.266 |
| 38.37121719423283 | 8.261 |
| 38.37863049847432 | 8.261 |
| 38.386042246952016 | 8.266 |
| 38.39345243966587 | 8.261 |
| 38.400861076615854 | 8.261 |
| 38.40826815780193 | 8.266 |
| 38.415673683224064 | 8.261 |
| 38.42307765288222 | 8.261 |
| 38.43048006677637 | 8.261 |
| 38.43788092490647 | 8.261 |
| 38.445280227272505 | 8.256 |
| 38.45267797387442 | 8.261 |
| 38.46007416471219 | 8.256 |
| 38.46746879978578 | 8.256 |
| 38.47486187909515 | 8.261 |
| 38.482253402640275 | 8.256 |
| 38.48964337042111 | 8.25 |
| 38.49703178243763 | 8.256 |
| 38.5044186386898 | 8.25 |
| 38.511803939177575 | 8.256 |
| 38.51918768390093 | 8.25 |
| 38.52656987285983 | 8.256 |
| 38.53395050605424 | 8.25 |
| 38.54132958348412 | 8.245 |
| 38.54870710514944 | 8.245 |
| 38.55608307105017 | 8.245 |
| 38.56345748118626 | 8.24 |
| 38.570830335557694 | 8.245 |
| 38.57820163416442 | 8.24 |
| 38.58557137700642 | 8.24 |
| 38.59293956408364 | 8.245 |
| 38.60030619539607 | 8.24 |
| 38.60767127094366 | 8.24 |
| 38.61503479072638 | 8.24 |
| 38.62239675474419 | 8.24 |
| 38.62975716299705 | 8.24 |
| 38.63711601548494 | 8.235 |
| 38.64447331220782 | 8.235 |
| 38.651829053165656 | 8.235 |
| 38.65918323835841 | 8.235 |
| 38.666535867786045 | 8.235 |
| 38.67388694144853 | 8.235 |
| 38.681236459345826 | 8.23 |
| 38.688584421477906 | 8.23 |
| 38.69593082784473 | 8.23 |
| 38.70327567844626 | 8.23 |
| 38.710618973282465 | 8.23 |
| 38.71796071235331 | 8.23 |
| 38.72530089565876 | 8.225 |
| 38.732639523198785 | 8.225 |
| 38.73997659497334 | 8.23 |
| 38.7473121109824 | 8.225 |
| 38.75464607122592 | 8.22 |
| 38.76197847570387 | 8.225 |
| 38.76930932441622 | 8.23 |
| 38.77663861736293 | 8.22 |
| 38.78396635454396 | 8.22 |
| 38.791292535959286 | 8.22 |
| 38.79861716160887 | 8.225 |
| 38.80594023149266 | 8.22 |
| 38.813261745610646 | 8.22 |
| 38.82058170396278 | 8.215 |
| 38.82790010654902 | 8.215 |
| 38.83521695336935 | 8.215 |
| 38.842532244423715 | 8.22 |
| 38.84984597971209 | 8.215 |
| 38.857158159234444 | 8.215 |
| 38.864468782990734 | 8.215 |
| 38.871777850980926 | 8.21 |
| 38.879085363204986 | 8.21 |
| 38.886391319662884 | 8.204 |
| 38.89369572035458 | 8.204 |
| 38.900998565280034 | 8.21 |
| 38.908299854439214 | 8.204 |
| 38.91559958783209 | 8.204 |
| 38.92289776545862 | 8.204 |
| 38.93019438731877 | 8.199 |
| 38.93748945341251 | 8.204 |
| 38.9447829637398 | 8.199 |
| 38.952074918300596 | 8.199 |
| 38.95936531709488 | 8.194 |
| 38.9666541601226 | 8.194 |
| 38.97394144738374 | 8.199 |
| 38.98122717887824 | 8.199 |
| 38.98851135460609 | 8.194 |
| 38.995793974567235 | 8.199 |
| 39.00307503876165 | 8.194 |
| 39.010354547189294 | 8.194 |
| 39.01763249985013 | 8.199 |
| 39.02490889674413 | 8.189 |
| 39.03218373787125 | 8.189 |
| 39.03945702323146 | 8.189 |
| 39.04672875282473 | 8.189 |
| 39.05399892665101 | 8.189 |
| 39.061267544710276 | 8.189 |
| 39.06853460700249 | 8.184 |
| 39.07580011352761 | 8.184 |
| 39.08306406428561 | 8.184 |
| 39.09032645927645 | 8.189 |
| 39.09758729850009 | 8.189 |
| 39.104846581956494 | 8.189 |
| 39.11210430964564 | 8.184 |
| 39.119360481567476 | 8.179 |
| 39.126615097721974 | 8.179 |
| 39.133868158109095 | 8.184 |
| 39.141119662728805 | 8.179 |
| 39.148369611581074 | 8.179 |
| 39.15561800466586 | 8.184 |
| 39.16286484198313 | 8.174 |
| 39.170110123532844 | 8.174 |
| 39.17735384931497 | 8.179 |
| 39.18459601932946 | 8.174 |
| 39.191836633576294 | 8.168 |
| 39.19907569205543 | 8.174 |
| 39.206313194766835 | 8.168 |
| 39.213549141710466 | 8.168 |
| 39.220783532886294 | 8.168 |
| 39.22801636829428 | 8.168 |
| 39.235247647934386 | 8.168 |
| 39.24247737180658 | 8.163 |
| 39.24970553991083 | 8.163 |
| 39.25693215224709 | 8.163 |
| 39.26415720881533 | 8.163 |
| 39.27138070961551 | 8.158 |
| 39.27860265464759 | 8.158 |
| 39.28582304391155 | 8.158 |
| 39.29304187740734 | 8.158 |
| 39.30025915513493 | 8.163 |
| 39.307474877094286 | 8.158 |
| 39.31468904328536 | 8.153 |
| 39.32190165370813 | 8.158 |
| 39.32911270836255 | 8.153 |
| 39.336322207248585 | 8.158 |
| 39.343530150366206 | 8.148 |
| 39.35073653771537 | 8.153 |
| 39.35794136929604 | 8.158 |
| 39.36514464510819 | 8.148 |
| 39.37234636515176 | 8.148 |
| 39.37954652942674 | 8.153 |
| 39.38674513793308 | 8.148 |
| 39.39394219067075 | 8.148 |
| 39.40113768763971 | 8.148 |
| 39.408331628839925 | 8.143 |
| 39.415524014271355 | 8.143 |
| 39.42271484393397 | 8.143 |
| 39.429904117827725 | 8.138 |
| 39.43709183595259 | 8.148 |
| 39.44427799830853 | 8.138 |
| 39.451462604895504 | 8.133 |
| 39.458645655713475 | 8.138 |
| 39.46582715076241 | 8.138 |
| 39.473007090042266 | 8.138 |
| 39.480185473553014 | 8.133 |
| 39.48736230129462 | 8.138 |
| 39.49453757326704 | 8.127 |
| 39.50171128947024 | 8.127 |
| 39.50888344990418 | 8.133 |
| 39.51605405456883 | 8.127 |
| 39.523223103464154 | 8.133 |
| 39.53039059659011 | 8.127 |
| 39.537556533946656 | 8.127 |
| 39.544720915533766 | 8.122 |
| 39.551883741351396 | 8.122 |
| 39.55904501139952 | 8.122 |
| 39.56620472567809 | 8.122 |
| 39.57336288418708 | 8.122 |
| 39.580519486926434 | 8.117 |
| 39.587674533896134 | 8.117 |
| 39.594828025096135 | 8.122 |
| 39.60197996052641 | 8.117 |
| 39.60913034018691 | 8.117 |
| 39.6162791640776 | 8.112 |
| 39.62342643219845 | 8.112 |
| 39.63057214454942 | 8.112 |
| 39.63771630113047 | 8.112 |
| 39.64485890194156 | 8.107 |
| 39.65199994698266 | 8.107 |
| 39.65913943625374 | 8.107 |
| 39.666277369754745 | 8.107 |
| 39.673413747485654 | 8.107 |
| 39.68054856944642 | 8.102 |
| 39.687681835637015 | 8.102 |
| 39.69481354605739 | 8.102 |
| 39.70194370070752 | 8.102 |
| 39.709072299587355 | 8.102 |
| 39.71619934269687 | 8.102 |
| 39.72332483003602 | 8.102 |
| 39.73044876160477 | 8.102 |
| 39.73757113740309 | 8.092 |
| 39.74469195743093 | 8.097 |
| 39.751811221688264 | 8.097 |
| 39.75892893017505 | 8.097 |
| 39.76604508289125 | 8.102 |
| 39.77315967983683 | 8.092 |
| 39.780272721011755 | 8.097 |
| 39.78738420641598 | 8.097 |
| 39.79449413604947 | 8.097 |
| 39.80160250991219 | 8.086 |
| 39.808709328004106 | 8.092 |
| 39.815814590325175 | 8.086 |
| 39.822918296875365 | 8.086 |
| 39.83002044765463 | 8.081 |
| 39.83712104266294 | 8.081 |
| 39.84422008190026 | 8.081 |
| 39.85131756536654 | 8.081 |
| 39.85841349306176 | 8.081 |
| 39.86550786498587 | 8.086 |
| 39.872600681138834 | 8.076 |
| 39.87969194152062 | 8.076 |
| 39.88678164613118 | 8.081 |
| 39.89386979497049 | 8.071 |
| 39.90095638803851 | 8.071 |
| 39.90804142533519 | 8.076 |
| 39.915124906860505 | 8.076 |
| 39.922206832614414 | 8.076 |
| 39.92928720259688 | 8.066 |
| 39.93636601680787 | 8.066 |
| 39.94344327524733 | 8.066 |
| 39.950518977915245 | 8.066 |
| 39.95759312481156 | 8.066 |
| 39.96466571593624 | 8.066 |
| 39.97173675128926 | 8.066 |
| 39.97880623087056 | 8.061 |
| 39.985874154680126 | 8.061 |
| 39.99294052271791 | 8.056 |
| 40.00000533498387 | 8.061 |
| 40.00706859147797 | 8.056 |
| 40.01413029220017 | 8.056 |
| 40.021190437150445 | 8.056 |
| 40.028249026328744 | 8.056 |
| 40.035306059735035 | 8.056 |
| 40.04236153736928 | 8.056 |
| 40.04941545923145 | 8.056 |
| 40.05646782532149 | 8.056 |
| 40.06351863563937 | 8.051 |
| 40.07056789018505 | 8.051 |
| 40.0776155889585 | 8.051 |
| 40.08466173195968 | 8.045 |
| 40.09170631918854 | 8.045 |
| 40.09874935064505 | 8.051 |
| 40.10579082632918 | 8.04 |
| 40.112830746240874 | 8.04 |
| 40.11986911038011 | 8.04 |
| 40.12690591874684 | 8.04 |
| 40.133941171341036 | 8.04 |
| 40.14097486816265 | 8.035 |
| 40.14800700921165 | 8.035 |
| 40.155037594488 | 8.035 |
| 40.162066623991656 | 8.03 |
| 40.16909409772258 | 8.035 |
| 40.17612001568074 | 8.03 |
| 40.183144377866086 | 8.035 |
| 40.19016718427859 | 8.03 |
| 40.19718843491822 | 8.025 |
| 40.20420812978492 | 8.025 |
| 40.21122626887866 | 8.03 |
| 40.21824285219941 | 8.025 |
| 40.22525787974712 | 8.025 |
| 40.23227135152175 | 8.02 |
| 40.23928326752328 | 8.02 |
| 40.246293627751655 | 8.02 |
| 40.253302432206844 | 8.015 |
| 40.2603096808888 | 8.015 |
| 40.267315373797494 | 8.015 |
| 40.274319510932884 | 8.015 |
| 40.28132209229493 | 8.015 |
| 40.28832311788359 | 8.01 |
| 40.29532258769884 | 8.01 |
| 40.30232050174063 | 8.01 |
| 40.30931686000893 | 8.005 |
| 40.316311662503686 | 8.01 |
| 40.32330490922487 | 8.005 |
| 40.33029660017245 | 8.005 |
| 40.33728673534638 | 7.999 |
| 40.344275314746625 | 8.005 |
| 40.35126233837314 | 7.994 |
| 40.35824780622589 | 7.999 |
| 40.365231718304834 | 7.994 |
| 40.372214074609936 | 7.994 |
| 40.37919487514116 | 7.994 |
| 40.38617411989846 | 7.989 |
| 40.393151808881804 | 7.994 |
| 40.400127942091146 | 7.994 |
| 40.407102519526454 | 7.989 |
| 40.41407554118769 | 7.989 |
| 40.42104700707481 | 7.984 |
| 40.42801691718778 | 7.984 |
| 40.434985271526564 | 7.989 |
| 40.44195207009111 | 7.984 |
| 40.44891731288139 | 7.979 |
| 40.45588099989737 | 7.984 |
| 40.462843131138996 | 7.984 |
| 40.46980370660624 | 7.984 |
| 40.476762726299064 | 7.974 |
| 40.48372019021742 | 7.974 |
| 40.49067609836128 | 7.974 |
| 40.49763045073059 | 7.974 |
| 40.50458324732533 | 7.979 |
| 40.51153448814545 | 7.969 |
| 40.51848417319091 | 7.974 |
| 40.52543230246168 | 7.974 |
| 40.53237887595771 | 7.974 |
| 40.53932389367897 | 7.974 |
| 40.54626735562541 | 7.963 |
| 40.553209261797 | 7.963 |
| 40.5601496121937 | 7.969 |
| 40.567088406815465 | 7.958 |
| 40.57402564566227 | 7.958 |
| 40.580961328734055 | 7.958 |
| 40.5878954560308 | 7.958 |
| 40.59482802755246 | 7.953 |
| 40.60175904329899 | 7.958 |
| 40.60868850327036 | 7.953 |
| 40.61561640746652 | 7.953 |
| 40.62254275588744 | 7.948 |
| 40.62946754853307 | 7.948 |
| 40.636390785403385 | 7.943 |
| 40.64331246649834 | 7.943 |
| 40.65023259181788 | 7.948 |
| 40.657151161361995 | 7.948 |
| 40.66406817513062 | 7.943 |
| 40.67098363312373 | 7.938 |
| 40.67789753534129 | 7.943 |
| 40.684809881783245 | 7.943 |
| 40.69172067244956 | 7.938 |
| 40.698629907340205 | 7.938 |
| 40.70553758645513 | 7.933 |
| 40.7124437097943 | 7.933 |
| 40.719348277357675 | 7.933 |
| 40.72625128914522 | 7.938 |
| 40.733152745156886 | 7.928 |
| 40.74005264539264 | 7.928 |
| 40.74695098985244 | 7.928 |
| 40.75384777853625 | 7.928 |
| 40.76074301144402 | 7.923 |
| 40.76763668857573 | 7.917 |
| 40.77452880993132 | 7.923 |
| 40.78141937551076 | 7.917 |
| 40.78830838531401 | 7.923 |
| 40.795195839341034 | 7.917 |
| 40.802081737591784 | 7.912 |
| 40.80896608006623 | 7.907 |
| 40.81584886676432 | 7.912 |
| 40.822730097686026 | 7.912 |
| 40.829609772831304 | 7.907 |
| 40.83648789220011 | 7.902 |
| 40.84336445579241 | 7.902 |
| 40.85023946360816 | 7.902 |
| 40.85711291564732 | 7.902 |
| 40.86398481190985 | 7.897 |
| 40.87085515239572 | 7.902 |
| 40.877723937104875 | 7.897 |
| 40.88459116603728 | 7.897 |
| 40.891456839192905 | 7.892 |
| 40.8983209565717 | 7.897 |
| 40.90518351817363 | 7.897 |
| 40.91204452399865 | 7.892 |
| 40.91890397404673 | 7.892 |
| 40.925761868317814 | 7.887 |
| 40.932618206811874 | 7.887 |
| 40.939472989528866 | 7.887 |
| 40.94632621646875 | 7.882 |
| 40.95317788763148 | 7.876 |
| 40.96002800301703 | 7.882 |
| 40.96687656262535 | 7.876 |
| 40.97372356645641 | 7.882 |
| 40.98056901451015 | 7.876 |
| 40.987412906786545 | 7.876 |
| 40.99425524328555 | 7.871 |
| 41.001096024007126 | 7.871 |
| 41.007935248951235 | 7.871 |
| 41.014772918117835 | 7.866 |
| 41.021609031506884 | 7.866 |
| 41.028443589118346 | 7.861 |
| 41.03527659095218 | 7.861 |
| 41.04210803700834 | 7.861 |
| 41.04893792728679 | 7.861 |
| 41.05576626178748 | 7.861 |
| 41.062593040510386 | 7.856 |
| 41.06941826345546 | 7.861 |
| 41.076241930622665 | 7.861 |
| 41.083064042011955 | 7.856 |
| 41.08988459762329 | 7.856 |
| 41.09670359745663 | 7.846 |
| 41.10352104151194 | 7.846 |
| 41.11033692978917 | 7.846 |
| 41.11715126228829 | 7.84 |
| 41.12396403900925 | 7.84 |
| 41.13077525995202 | 7.84 |
| 41.13758492511654 | 7.84 |
| 41.14439303450279 | 7.835 |
| 41.15119958811072 | 7.84 |
| 41.1580045859403 | 7.83 |
| 41.16480802799147 | 7.83 |
| 41.1716099142642 | 7.825 |
| 41.17841024475845 | 7.83 |
| 41.185209019474186 | 7.83 |
| 41.19200623841135 | 7.82 |
| 41.198801901569915 | 7.82 |
| 41.20559600894984 | 7.82 |
| 41.21238856055108 | 7.82 |
| 41.21917955637359 | 7.82 |
| 41.225968996417336 | 7.81 |
| 41.232756880682274 | 7.81 |
| 41.23954320916837 | 7.81 |
| 41.24632798187557 | 7.81 |
| 41.253111198803836 | 7.81 |
| 41.25989285995313 | 7.805 |
| 41.26667296532342 | 7.805 |
| 41.27345151491466 | 7.8 |
| 41.28022850872681 | 7.8 |
| 41.28700394675982 | 7.805 |
| 41.29377782901365 | 7.8 |
| 41.30055015548827 | 7.794 |
| 41.30732092618363 | 7.8 |
| 41.31409014109969 | 7.8 |
| 41.32085780023641 | 7.794 |
| 41.32762390359375 | 7.794 |
| 41.33438845117166 | 7.784 |
| 41.341151442970116 | 7.784 |
| 41.347912878989064 | 7.784 |
| 41.354672759228464 | 7.779 |
| 41.36143108368828 | 7.779 |
| 41.36818785236847 | 7.774 |
| 41.374943065268994 | 7.779 |
| 41.381696722389805 | 7.774 |
| 41.38844882373086 | 7.769 |
| 41.39519936929213 | 7.769 |
| 41.40194835907356 | 7.769 |
| 41.40869579307511 | 7.759 |
| 41.41544167129675 | 7.769 |
| 41.422185993738424 | 7.764 |
| 41.428928760400105 | 7.764 |
| 41.43566997128174 | 7.759 |
| 41.442409626383295 | 7.753 |
| 41.44914772570473 | 7.748 |
| 41.45588426924599 | 7.753 |
| 41.46261925700705 | 7.753 |
| 41.46935268898786 | 7.748 |
| 41.47608456518838 | 7.748 |
| 41.48281488560857 | 7.743 |
| 41.489543650248386 | 7.738 |
| 41.49627085910779 | 7.738 |
| 41.50299651218673 | 7.738 |
| 41.50972060948518 | 7.733 |
| 41.51644315100308 | 7.733 |
| 41.523164136740405 | 7.738 |
| 41.52988356669711 | 7.728 |
| 41.53660144087314 | 7.728 |
| 41.54331775926847 | 7.723 |
| 41.55003252188305 | 7.718 |
| 41.55674572871684 | 7.718 |
| 41.5634573797698 | 7.718 |
| 41.570167475041885 | 7.718 |
| 41.576876014533056 | 7.718 |
| 41.583582998243266 | 7.712 |
| 41.59028842617248 | 7.707 |
| 41.59699229832065 | 7.718 |
| 41.60369461468774 | 7.702 |
| 41.610395375273704 | 7.702 |
| 41.6170945800785 | 7.702 |
| 41.623792229102094 | 7.697 |
| 41.63048832234443 | 7.697 |
| 41.63718285980548 | 7.697 |
| 41.64387584148519 | 7.692 |
| 41.65056726738353 | 7.692 |
| 41.657257137500444 | 7.687 |
| 41.6639454518359 | 7.692 |
| 41.670632210389854 | 7.692 |
| 41.677317413162264 | 7.687 |
| 41.684001060153086 | 7.676 |
| 41.69068315136228 | 7.676 |
| 41.6973636867898 | 7.671 |
| 41.704042666435605 | 7.671 |
| 41.71072009029965 | 7.671 |
| 41.71739595838191 | 7.666 |
| 41.72407027068232 | 7.661 |
| 41.73074302720085 | 7.661 |
| 41.73741422793746 | 7.661 |
| 41.74408387289209 | 7.656 |
| 41.75075196206472 | 7.656 |
| 41.7574184954553 | 7.656 |
| 41.76408347306378 | 7.656 |
| 41.770746894890124 | 7.656 |
| 41.77740876093429 | 7.651 |
| 41.784069071196235 | 7.646 |
| 41.790727825675916 | 7.646 |
| 41.79738502437329 | 7.646 |
| 41.80404066728832 | 7.635 |
| 41.81069475442096 | 7.635 |
| 41.817347285771156 | 7.635 |
| 41.82399826133888 | 7.63 |
| 41.830647681124084 | 7.625 |
| 41.83729554512673 | 7.625 |
| 41.84394185334677 | 7.625 |
| 41.850586605784166 | 7.62 |
| 41.85722980243887 | 7.615 |
| 41.86387144331084 | 7.61 |
| 41.87051152840004 | 7.61 |
| 41.877150057706416 | 7.61 |
| 41.883787031229936 | 7.605 |
| 41.890422448970554 | 7.6 |
| 41.89705631092823 | 7.61 |
| 41.90368861710291 | 7.6 |
| 41.91031936749456 | 7.595 |
| 41.91694856210314 | 7.589 |
| 41.92357620092859 | 7.584 |
| 41.93020228397089 | 7.589 |
| 41.93682681122999 | 7.584 |
| 41.94344978270584 | 7.584 |
| 41.950071198398405 | 7.579 |
| 41.956691058307634 | 7.569 |
| 41.96330936243349 | 7.564 |
| 41.96992611077593 | 7.569 |
| 41.97654130333491 | 7.569 |
| 41.98315494011039 | 7.564 |
| 41.98976702110232 | 7.559 |
| 41.996377546310654 | 7.554 |
| 42.00298651573536 | 7.554 |
| 42.009593929376386 | 7.554 |
| 42.016199787233695 | 7.548 |
| 42.02280408930724 | 7.543 |
| 42.02940683559699 | 7.538 |
| 42.036008026102884 | 7.533 |
| 42.04260766082489 | 7.533 |
| 42.04920573976296 | 7.528 |
| 42.055802262917055 | 7.528 |
| 42.062397230287125 | 7.523 |
| 42.06899064187313 | 7.518 |
| 42.07558249767503 | 7.513 |
| 42.08217279769278 | 7.513 |
| 42.08876154192633 | 7.507 |
| 42.09534873037565 | 7.507 |
| 42.101934363040684 | 7.502 |
| 42.10851843992139 | 7.497 |
| 42.11510096101773 | 7.492 |
| 42.12168192632966 | 7.487 |
| 42.12826133585713 | 7.487 |
| 42.13483918960011 | 7.492 |
| 42.14141548755854 | 7.482 |
| 42.147990229732386 | 7.477 |
| 42.154563416121604 | 7.477 |
| 42.16113504672615 | 7.471 |
| 42.16770512154598 | 7.466 |
| 42.17427364058105 | 7.461 |
| 42.180840603831314 | 7.466 |
| 42.18740601129673 | 7.456 |
| 42.193969862977255 | 7.451 |
| 42.200532158872846 | 7.446 |
| 42.20709289898346 | 7.446 |
| 42.21365208330905 | 7.446 |
| 42.22020971184958 | 7.441 |
| 42.22676578460499 | 7.441 |
| 42.233320301575255 | 7.425 |
| 42.23987326276032 | 7.42 |
| 42.24642466816014 | 7.42 |
| 42.252974517774675 | 7.415 |
| 42.25952281160388 | 7.42 |
| 42.26606954964772 | 7.41 |
| 42.27261473190614 | 7.41 |
| 42.27915835837909 | 7.4 |
| 42.285700429066544 | 7.395 |
| 42.29224094396845 | 7.39 |
| 42.298779903084764 | 7.39 |
| 42.30531730641544 | 7.384 |
| 42.311853153960435 | 7.379 |
| 42.3183874457197 | 7.384 |
| 42.3249201816932 | 7.374 |
| 42.33145136188089 | 7.369 |
| 42.337980986282716 | 7.369 |
| 42.344509054898644 | 7.359 |
| 42.35103556772862 | 7.359 |
| 42.357560524772616 | 7.349 |
| 42.364083926030574 | 7.343 |
| 42.370605771502454 | 7.343 |
| 42.377126061188214 | 7.338 |
| 42.383644795087804 | 7.333 |
| 42.39016197320118 | 7.328 |
| 42.3966775955283 | 7.328 |
| 42.403191662069126 | 7.323 |
| 42.4097041728236 | 7.313 |
| 42.416215127791695 | 7.308 |
| 42.422724526973354 | 7.302 |
| 42.42923237036853 | 7.302 |
| 42.43573865797719 | 7.297 |
| 42.44224338979928 | 7.287 |
| 42.44874656583476 | 7.287 |
| 42.45524818608359 | 7.277 |
| 42.46174825054571 | 7.277 |
| 42.46824675922109 | 7.266 |
| 42.47474371210968 | 7.266 |
| 42.48123910921144 | 7.261 |
| 42.487732950526315 | 7.256 |
| 42.49422523605427 | 7.246 |
| 42.50071596579526 | 7.241 |
| 42.50720513974923 | 7.236 |
| 42.513692757916154 | 7.231 |
| 42.52017882029597 | 7.225 |
| 42.52666332688864 | 7.215 |
| 42.533146277694115 | 7.215 |
| 42.539627672712356 | 7.205 |
| 42.54610751194332 | 7.2 |
| 42.55258579538695 | 7.19 |
| 42.55906252304322 | 7.185 |
| 42.56553769491207 | 7.179 |
| 42.57201131099345 | 7.169 |
| 42.578483371287334 | 7.174 |
| 42.584953875793666 | 7.159 |
| 42.59142282451241 | 7.154 |
| 42.597890217443506 | 7.149 |
| 42.604356054586916 | 7.144 |
| 42.6108203359426 | 7.133 |
| 42.617283061510506 | 7.133 |
| 42.623744231290594 | 7.118 |
| 42.630203845282814 | 7.123 |
| 42.63666190348712 | 7.108 |
| 42.64311840590348 | 7.103 |
| 42.64957335253183 | 7.092 |
| 42.65602674337214 | 7.087 |
| 42.662478578424356 | 7.082 |
| 42.668928857688435 | 7.072 |
| 42.675377581164334 | 7.067 |
| 42.681824748852 | 7.056 |
| 42.688270360751396 | 7.051 |
| 42.694714416862475 | 7.041 |
| 42.70115691718519 | 7.031 |
| 42.70759786171949 | 7.031 |
| 42.714037250465346 | 7.026 |
| 42.7204750834227 | 7.01 |
| 42.72691136059151 | 7.005 |
| 42.733346081971725 | 7 |
| 42.739779247563305 | 7 |
| 42.74621085736621 | 6.99 |
| 42.75264091138038 | 6.98 |
| 42.759069409605786 | 6.974 |
| 42.76549635204237 | 6.959 |
| 42.77192173869009 | 6.959 |
| 42.778345569548904 | 6.944 |
| 42.78476784461876 | 6.939 |
| 42.79118856389962 | 6.933 |
| 42.79760772739143 | 6.923 |
| 42.804025335094146 | 6.908 |
| 42.81044138700773 | 6.908 |
| 42.81685588313213 | 6.898 |
| 42.823268823467295 | 6.882 |
| 42.82968020801319 | 6.882 |
| 42.83609003676976 | 6.862 |
| 42.84249830973697 | 6.856 |
| 42.848905026914764 | 6.846 |
| 42.8553101883031 | 6.831 |
| 42.861713793901934 | 6.826 |
| 42.868115843711216 | 6.815 |
| 42.8745163377309 | 6.805 |
| 42.88091527596095 | 6.795 |
| 42.887312658401314 | 6.78 |
| 42.89370848505194 | 6.775 |
| 42.90010275591278 | 6.759 |
| 42.906495470983806 | 6.744 |
| 42.91288663026496 | 6.734 |
| 42.919276233756186 | 6.718 |
| 42.92566428145745 | 6.703 |
| 42.93205077336871 | 6.692 |
| 42.93843570948991 | 6.677 |
| 42.944819089821 | 6.662 |
| 42.95120091436195 | 6.651 |
| 42.9575811831127 | 6.631 |
| 42.96395989607321 | 6.616 |
| 42.97033705324343 | 6.6 |
| 42.97671265462332 | 6.585 |
| 42.98308670021283 | 6.564 |
| 42.989459190011914 | 6.544 |
| 42.99583012402052 | 6.523 |
| 43.00219950223861 | 6.503 |
| 43.00856732466614 | 6.477 |
| 43.01493359130305 | 6.452 |
| 43.021298302149305 | 6.426 |
| 43.02766145720486 | 6.406 |
| 43.03402305646966 | 6.38 |
| 43.040383099943654 | 6.354 |
| 43.04674158762681 | 6.324 |
| 43.053098519519075 | 6.298 |
| 43.0594538956204 | 6.267 |
| 43.065807715930745 | 6.231 |
| 43.07215998045005 | 6.19 |
| 43.07851068917829 | 6.154 |
| 43.0848598421154 | 6.113 |
| 43.09120743926134 | 6.072 |
| 43.09755348061606 | 6.031 |
| 43.10389796617951 | 5.985 |
| 43.110240895951655 | 5.934 |
| 43.116582269932444 | 5.883 |
| 43.122922088121825 | 5.826 |
| 43.12926035051975 | 5.78 |
| 43.13559705712618 | 5.724 |
| 43.14193220794107 | 5.662 |
| 43.14826580296436 | 5.606 |
| 43.15459784219601 | 5.55 |
| 43.16092832563598 | 5.488 |
| 43.16725725328421 | 5.422 |
| 43.17358462514066 | 5.36 |
| 43.17991044120529 | 5.299 |
| 43.186234701478035 | 5.232 |
| 43.192557405958866 | 5.17 |
| 43.19887855464773 | 5.109 |
| 43.20519814754457 | 5.042 |
| 43.211516184649355 | 4.971 |
| 43.21783266596203 | 4.909 |
| 43.22414759148254 | 4.848 |
| 43.23046096121085 | 4.776 |
| 43.23677277514691 | 4.709 |
| 43.24308303329067 | 4.648 |
| 43.24939173564208 | 4.581 |
| 43.255698882201095 | 4.514 |
| 43.262004472967675 | 4.453 |
| 43.26830850794176 | 4.391 |
| 43.27461098712332 | 4.32 |
| 43.28091191051229 | 4.263 |
| 43.28721127810863 | 4.202 |
| 43.29350908991229 | 4.145 |
| 43.299805345923225 | 4.094 |
| 43.30610004614139 | 4.038 |
| 43.31239319056673 | 3.986 |
| 43.3186847791992 | 3.93 |
| 43.32497481203876 | 3.884 |
| 43.331263289085356 | 3.838 |
| 43.33755021033894 | 3.792 |
| 43.34383557579947 | 3.746 |
| 43.35011938546689 | 3.71 |
| 43.35640163934116 | 3.674 |
| 43.36268233742222 | 3.633 |
| 43.36896147971004 | 3.602 |
| 43.37523906620456 | 3.571 |
| 43.38151509690573 | 3.53 |
| 43.387789571813514 | 3.5 |
| 43.39406249092786 | 3.474 |
| 43.400333854248714 | 3.448 |
| 43.40660366177603 | 3.423 |
| 43.41287191350977 | 3.397 |
| 43.41913860944987 | 3.371 |
| 43.42540374959629 | 3.351 |
| 43.43166733394899 | 3.336 |
| 43.43792936250791 | 3.32 |
| 43.444189835273 | 3.295 |
| 43.45044875224422 | 3.274 |
| 43.456706113421525 | 3.259 |
| 43.46296191880486 | 3.243 |
| 43.469216168394176 | 3.238 |
| 43.47546886218943 | 3.223 |
| 43.48172000019057 | 3.202 |
| 43.487969582397554 | 3.197 |
| 43.494217608810324 | 3.182 |
| 43.50046407942884 | 3.172 |
| 43.506708994253046 | 3.156 |
| 43.512952353282905 | 3.146 |
| 43.51919415651836 | 3.141 |
| 43.525434403959366 | 3.131 |
| 43.531673095605875 | 3.115 |
| 43.537910231457836 | 3.105 |
| 43.5441458115152 | 3.095 |
| 43.55037983577792 | 3.095 |
| 43.556612304245945 | 3.084 |
| 43.562843216919234 | 3.074 |
| 43.56907257379773 | 3.064 |
| 43.575300374881394 | 3.064 |
| 43.581526620170166 | 3.054 |
| 43.58775130966401 | 3.054 |
| 43.59397444336286 | 3.044 |
| 43.60019602126668 | 3.044 |
| 43.606416043375425 | 3.038 |
| 43.61263450968904 | 3.033 |
| 43.61885142020747 | 3.023 |
| 43.62506677493068 | 3.018 |
| 43.63128057385861 | 3.013 |
| 43.63749281699122 | 3.008 |
| 43.64370350432846 | 3.002 |
| 43.64991263587027 | 3.002 |
| 43.65612021161662 | 2.992 |
| 43.66232623156744 | 2.987 |
| 43.668530695722694 | 2.982 |
| 43.674733604082334 | 2.982 |
| 43.680934956646304 | 2.977 |
| 43.68713475341456 | 2.972 |
| 43.693332994387056 | 2.972 |
| 43.69952967956373 | 2.961 |
| 43.705724808944545 | 2.961 |
| 43.71191838252945 | 2.951 |
| 43.71811040031839 | 2.951 |
| 43.724300862311324 | 2.946 |
| 43.7304897685082 | 2.941 |
| 43.736677118908965 | 2.936 |
| 43.74286291351358 | 2.931 |
| 43.74904715232198 | 2.926 |
| 43.75522983533413 | 2.921 |
| 43.761410962549974 | 2.921 |
| 43.76759053396946 | 2.921 |
| 43.773768549592546 | 2.915 |
| 43.77994500941918 | 2.91 |
| 43.78611991344931 | 2.9 |
| 43.79229326168289 | 2.9 |
| 43.79846505411987 | 2.9 |
| 43.8046352907602 | 2.895 |
| 43.81080397160383 | 2.895 |
| 43.81697109665071 | 2.885 |
| 43.82313666590079 | 2.885 |
| 43.82930067935403 | 2.879 |
| 43.835463137010365 | 2.879 |
| 43.84162403886975 | 2.869 |
| 43.84778338493214 | 2.869 |
| 43.85394117519749 | 2.864 |
| 43.86009740966574 | 2.859 |
| 43.86625208833684 | 2.854 |
| 43.87240521121075 | 2.854 |
| 43.87855677828741 | 2.854 |
| 43.88470678956678 | 2.854 |
| 43.8908552450488 | 2.839 |
| 43.89700214473343 | 2.839 |
| 43.90314748862061 | 2.839 |
| 43.9092912767103 | 2.833 |
| 43.91543350900244 | 2.828 |
| 43.92157418549699 | 2.823 |
| 43.9277133061939 | 2.828 |
| 43.933850871093114 | 2.818 |
| 43.93998688019458 | 2.823 |
| 43.946121333498255 | 2.818 |
| 43.95225423100408 | 2.818 |
| 43.95838557271202 | 2.808 |
| 43.96451535862201 | 2.808 |
| 43.970643588734006 | 2.803 |
| 43.97677026304796 | 2.797 |
| 43.982895381563814 | 2.797 |
| 43.989018944281526 | 2.797 |
| 43.995140951201044 | 2.792 |
| 44.001261402322314 | 2.787 |
| 44.00738029764529 | 2.787 |
| 44.01349763716992 | 2.782 |
| 44.01961342089616 | 2.787 |
| 44.025727648823946 | 2.787 |
| 44.031840320953236 | 2.777 |
| 44.03795143728398 | 2.777 |
| 44.044060997816125 | 2.777 |
| 44.05016900254962 | 2.772 |
| 44.056275451484424 | 2.767 |
| 44.06238034462047 | 2.772 |
| 44.06848368195772 | 2.767 |
| 44.07458546349612 | 2.767 |
| 44.08068568923562 | 2.757 |
| 44.08678435917617 | 2.757 |
| 44.09288147331772 | 2.757 |
| 44.09897703166021 | 2.746 |
| 44.105071034203604 | 2.751 |
| 44.11116348094784 | 2.751 |
| 44.11725437189287 | 2.746 |
| 44.12334370703864 | 2.741 |
| 44.12943148638511 | 2.741 |
| 44.13551770993222 | 2.741 |
| 44.141602377679924 | 2.741 |
| 44.14768548962817 | 2.736 |
| 44.1537670457769 | 2.731 |
| 44.159847046126075 | 2.731 |
| 44.16592549067564 | 2.726 |
| 44.17200237942554 | 2.721 |
| 44.17807771237573 | 2.726 |
| 44.18415148952615 | 2.721 |
| 44.19022371087676 | 2.716 |
| 44.196294376427495 | 2.716 |
| 44.20236348617832 | 2.716 |
| 44.20843104012918 | 2.705 |
| 44.21449703828001 | 2.71 |
| 44.22056148063077 | 2.71 |
| 44.22662436718141 | 2.71 |
| 44.23268569793188 | 2.7 |
| 44.23874547288212 | 2.7 |
| 44.244803692032086 | 2.7 |
| 44.250860355381725 | 2.695 |
| 44.25691546293098 | 2.69 |
| 44.26296901467981 | 2.69 |
| 44.26902101062816 | 2.69 |
| 44.275071450775975 | 2.69 |
| 44.281120335123205 | 2.69 |
| 44.2871676636698 | 2.685 |
| 44.293213436415705 | 2.685 |
| 44.299257653360876 | 2.68 |
| 44.30530031450525 | 2.68 |
| 44.31134141984879 | 2.68 |
| 44.31738096939143 | 2.675 |
| 44.32341896313313 | 2.669 |
| 44.32945540107383 | 2.669 |
| 44.33549028321348 | 2.669 |
| 44.341523609552034 | 2.669 |
| 44.34755538008944 | 2.659 |
| 44.35358559482564 | 2.659 |
| 44.35961425376058 | 2.659 |
| 44.365641356894216 | 2.659 |
| 44.371666904226494 | 2.654 |
| 44.37769089575736 | 2.649 |
| 44.38371333148677 | 2.659 |
| 44.389734211414655 | 2.649 |
| 44.395753535540976 | 2.649 |
| 44.40177130386568 | 2.649 |
| 44.407787516388716 | 2.644 |
| 44.41380217311003 | 2.639 |
| 44.41981527402957 | 2.639 |
| 44.425826819147275 | 2.639 |
| 44.4318368084631 | 2.634 |
| 44.437845241977 | 2.634 |
| 44.44385211968892 | 2.634 |
| 44.4498574415988 | 2.634 |
| 44.4558612077066 | 2.628 |
| 44.46186341801225 | 2.634 |
| 44.46786407251571 | 2.623 |
| 44.47386317121693 | 2.628 |
| 44.47986071411585 | 2.623 |
| 44.48585670121243 | 2.618 |
| 44.491851132506596 | 2.618 |
| 44.49784400799831 | 2.618 |
| 44.50383532768752 | 2.613 |
| 44.50982509157417 | 2.613 |
| 44.51581329965821 | 2.608 |
| 44.52179995193959 | 2.613 |
| 44.52778504841825 | 2.608 |
| 44.533768589094144 | 2.603 |
| 44.53975057396722 | 2.603 |
| 44.54573100303742 | 2.598 |
| 44.55170987630469 | 2.608 |
| 44.557687193768984 | 2.603 |
| 44.563662955430246 | 2.598 |
| 44.56963716128842 | 2.592 |
| 44.575609811343455 | 2.598 |
| 44.5815809055953 | 2.592 |
| 44.587550444043906 | 2.587 |
| 44.593518426689215 | 2.592 |
| 44.59948485353117 | 2.592 |
| 44.60544972456973 | 2.592 |
| 44.61141303980484 | 2.582 |
| 44.61737479923644 | 2.587 |
| 44.62333500286447 | 2.587 |
| 44.62929365068889 | 2.577 |
| 44.63525074270965 | 2.577 |
| 44.64120627892669 | 2.577 |
| 44.647160259339955 | 2.577 |
| 44.653112683949395 | 2.572 |
| 44.65906355275495 | 2.572 |
| 44.66501286575658 | 2.577 |
| 44.67096062295422 | 2.572 |
| 44.676906824347824 | 2.567 |
| 44.68285146993733 | 2.567 |
| 44.6887945597227 | 2.567 |
| 44.69473609370387 | 2.562 |
| 44.700676071880785 | 2.562 |
| 44.706614494253394 | 2.562 |
| 44.71255136082165 | 2.562 |
| 44.71848667158549 | 2.562 |
| 44.72442042654487 | 2.557 |
| 44.73035262569972 | 2.557 |
| 44.736283269050006 | 2.557 |
| 44.742212356595665 | 2.551 |
| 44.748139888336645 | 2.551 |
| 44.75406586427289 | 2.551 |
| 44.759990284404346 | 2.546 |
| 44.76591314873097 | 2.546 |
| 44.771834457252695 | 2.546 |
| 44.77775420996947 | 2.541 |
| 44.78367240688125 | 2.546 |
| 44.789589047987974 | 2.546 |
| 44.79550413328959 | 2.541 |
| 44.801417662786044 | 2.536 |
| 44.80732963647728 | 2.541 |
| 44.81324005436324 | 2.541 |
| 44.81914891644388 | 2.536 |
| 44.82505622271914 | 2.536 |
| 44.83096197318897 | 2.531 |
| 44.83686616785331 | 2.531 |
| 44.84276880671211 | 2.526 |
| 44.84866988976532 | 2.531 |
| 44.854569417012875 | 2.526 |
| 44.86046738845473 | 2.521 |
| 44.86636380409083 | 2.526 |
| 44.87225866392112 | 2.521 |
| 44.87815196794555 | 2.521 |
| 44.88404371616405 | 2.526 |
| 44.88993390857658 | 2.516 |
| 44.89582254518309 | 2.516 |
| 44.90170962598351 | 2.516 |
| 44.90759515097779 | 2.516 |
| 44.91347912016589 | 2.511 |
| 44.919361533547736 | 2.511 |
| 44.925242391123284 | 2.511 |
| 44.93112169289248 | 2.516 |
| 44.936999438855274 | 2.505 |
| 44.9428756290116 | 2.511 |
| 44.94875026336141 | 2.5 |
| 44.95462334190465 | 2.505 |
| 44.96049486464126 | 2.505 |
| 44.96636483157119 | 2.505 |
| 44.97223324269439 | 2.5 |
| 44.97810009801079 | 2.5 |
| 44.98396539752035 | 2.5 |
| 44.989829141223005 | 2.495 |
| 44.995691329118706 | 2.49 |
| 45.0015519612074 | 2.49 |
| 45.00741103748903 | 2.495 |
| 45.013268557963535 | 2.49 |
| 45.01912452263087 | 2.49 |
| 45.02497893149098 | 2.485 |
| 45.0308317845438 | 2.49 |
| 45.036683081789285 | 2.485 |
| 45.042532823227376 | 2.485 |
| 45.048381008858016 | 2.485 |
| 45.054227638681155 | 2.485 |
| 45.06007271269674 | 2.485 |
| 45.065916230904705 | 2.48 |
| 45.071758193305 | 2.475 |
| 45.07759859989757 | 2.48 |
| 45.08343745068236 | 2.48 |
| 45.08927474565932 | 2.475 |
| 45.09511048482838 | 2.475 |
| 45.100944668189506 | 2.475 |
| 45.106777295742624 | 2.47 |
| 45.11260836748769 | 2.475 |
| 45.11843788342464 | 2.47 |
| 45.124265843553424 | 2.47 |
| 45.13009224787399 | 2.47 |
| 45.13591709638627 | 2.47 |
| 45.141740389090224 | 2.464 |
| 45.147562125985786 | 2.47 |
| 45.1533823070729 | 2.464 |
| 45.159200932351524 | 2.464 |
| 45.165018001821586 | 2.47 |
| 45.17083351548304 | 2.464 |
| 45.17664747333583 | 2.464 |
| 45.18245987537989 | 2.459 |
| 45.188270721615176 | 2.459 |
| 45.194080012041624 | 2.454 |
| 45.199887746659186 | 2.459 |
| 45.2056939254678 | 2.454 |
| 45.21149854846741 | 2.459 |
| 45.217301615657966 | 2.449 |
| 45.22310312703941 | 2.449 |
| 45.22890308261168 | 2.449 |
| 45.23470148237473 | 2.449 |
| 45.2404983263285 | 2.454 |
| 45.246293614472926 | 2.449 |
| 45.25208734680796 | 2.449 |
| 45.25787952333355 | 2.444 |
| 45.263670144049634 | 2.449 |
| 45.26945920895615 | 2.444 |
| 45.275246718053054 | 2.439 |
| 45.281032671340284 | 2.444 |
| 45.28681706881778 | 2.434 |
| 45.29259991048549 | 2.439 |
| 45.29838119634336 | 2.439 |
| 45.304160926391326 | 2.434 |
| 45.309939100629336 | 2.439 |
| 45.31571571905734 | 2.434 |
| 45.321490781675266 | 2.439 |
| 45.32726428848307 | 2.434 |
| 45.3330362394807 | 2.429 |
| 45.33880663466809 | 2.429 |
| 45.34457547404518 | 2.429 |
| 45.35034275761192 | 2.434 |
| 45.35610848536825 | 2.434 |
| 45.36187265731412 | 2.429 |
| 45.36763527344947 | 2.423 |
| 45.373396333774245 | 2.429 |
| 45.37915583828838 | 2.423 |
| 45.38491378699183 | 2.418 |
| 45.39067017988453 | 2.418 |
| 45.396425016966425 | 2.418 |
| 45.40217829823746 | 2.418 |
| 45.407930023697574 | 2.418 |
| 45.41368019334671 | 2.418 |
| 45.41942880718481 | 2.418 |
| 45.42517586521182 | 2.413 |
| 45.430921367427686 | 2.408 |
| 45.43666531383235 | 2.418 |
| 45.442407704425754 | 2.408 |
| 45.44814853920784 | 2.408 |
| 45.45388781817855 | 2.408 |
| 45.45962554133783 | 2.413 |
| 45.46536170868562 | 2.408 |
| 45.47109632022186 | 2.408 |
| 45.4768293759465 | 2.408 |
| 45.482560875859484 | 2.403 |
| 45.488290819960746 | 2.408 |
| 45.49401920825023 | 2.403 |
| 45.499746040727885 | 2.408 |
| 45.50547131739365 | 2.408 |
| 45.511195038247465 | 2.403 |
| 45.516917203289275 | 2.408 |
| 45.52263781251902 | 2.408 |
| 45.52835686593665 | 2.403 |
| 45.534074363542096 | 2.398 |
| 45.53979030533531 | 2.408 |
| 45.545504691316225 | 2.398 |
| 45.551217521484794 | 2.398 |
| 45.55692879584095 | 2.403 |
| 45.562638514384645 | 2.398 |
| 45.56834667711581 | 2.398 |
| 45.5740532840344 | 2.398 |
| 45.57975833514035 | 2.398 |
| 45.5854618304336 | 2.398 |
| 45.5911637699141 | 2.398 |
| 45.59686415358178 | 2.393 |
| 45.60256298143659 | 2.393 |
| 45.60826025347848 | 2.393 |
| 45.61395596970737 | 2.393 |
| 45.61965013012322 | 2.388 |
| 45.62534273472596 | 2.388 |
| 45.63103378351555 | 2.382 |
| 45.636723276491914 | 2.382 |
| 45.642411213655 | 2.382 |
| 45.64809759500476 | 2.382 |
| 45.65378242054111 | 2.388 |
| 45.65946569026402 | 2.388 |
| 45.66514740417342 | 2.377 |
| 45.670827562269245 | 2.377 |
| 45.67650616455144 | 2.382 |
| 45.682183211019954 | 2.377 |
| 45.68785870167472 | 2.377 |
| 45.693532636515684 | 2.377 |
| 45.69920501554279 | 2.372 |
| 45.704875838755974 | 2.372 |
| 45.71054510615518 | 2.377 |
| 45.71621281774035 | 2.372 |
| 45.72187897351142 | 2.377 |
| 45.727543573468346 | 2.367 |
| 45.73320661761105 | 2.377 |
| 45.73886810593949 | 2.367 |
| 45.744528038453595 | 2.367 |
| 45.75018641515331 | 2.367 |
| 45.75584323603858 | 2.367 |
| 45.761498501109344 | 2.362 |
| 45.76715221036554 | 2.367 |
| 45.77280436380711 | 2.362 |
| 45.778454961434 | 2.367 |
| 45.78410400324615 | 2.362 |
| 45.78975148924349 | 2.367 |
| 45.795397419425974 | 2.357 |
| 45.80104179379354 | 2.362 |
| 45.806684612346125 | 2.362 |
| 45.81232587508367 | 2.357 |
| 45.817965582006124 | 2.362 |
| 45.823603733113416 | 2.357 |
| 45.8292403284055 | 2.357 |
| 45.834875367882304 | 2.352 |
| 45.840508851543774 | 2.357 |
| 45.84614077938985 | 2.352 |
| 45.85177115142047 | 2.352 |
| 45.85739996763559 | 2.352 |
| 45.86302722803513 | 2.352 |
| 45.86865293261904 | 2.352 |
| 45.87427708138726 | 2.357 |
| 45.87989967433973 | 2.346 |
| 45.885520711476396 | 2.352 |
| 45.89114019279719 | 2.341 |
| 45.89675811830205 | 2.352 |
| 45.902374487990926 | 2.341 |
| 45.90798930186375 | 2.341 |
| 45.91360255992047 | 2.341 |
| 45.91921426216102 | 2.341 |
| 45.924824408585344 | 2.346 |
| 45.93043299919338 | 2.341 |
| 45.936040033985066 | 2.336 |
| 45.94164551296035 | 2.336 |
| 45.947249436119165 | 2.341 |
| 45.952851803461456 | 2.336 |
| 45.95845261498716 | 2.341 |
| 45.96405187069622 | 2.336 |
| 45.969649570588565 | 2.336 |
| 45.97524571466415 | 2.331 |
| 45.9808403029229 | 2.336 |
| 45.986433335364765 | 2.336 |
| 45.99202481198969 | 2.336 |
| 45.9976147327976 | 2.331 |
| 46.00320309778844 | 2.336 |
| 46.00878990696216 | 2.331 |
| 46.014375160318686 | 2.331 |
| 46.019958857857965 | 2.326 |
| 46.02554099957993 | 2.326 |
| 46.03112158548453 | 2.326 |
| 46.0367006155717 | 2.331 |
| 46.042278089841375 | 2.326 |
| 46.047854008293506 | 2.326 |
| 46.053428370928025 | 2.321 |
| 46.05900117774487 | 2.331 |
| 46.06457242874398 | 2.321 |
| 46.070142123925294 | 2.321 |
| 46.075710263288755 | 2.321 |
| 46.0812768468343 | 2.326 |
| 46.08684187456187 | 2.321 |
| 46.0924053464714 | 2.326 |
| 46.09796726256284 | 2.326 |
| 46.10352762283612 | 2.316 |
| 46.109086427291174 | 2.316 |
| 46.11464367592795 | 2.321 |
| 46.12019936874639 | 2.316 |
| 46.125753505746424 | 2.321 |
| 46.131306086928 | 2.311 |
| 46.13685711229105 | 2.321 |
| 46.14240658183551 | 2.311 |
| 46.14795449556132 | 2.316 |
| 46.15350085346843 | 2.316 |
| 46.15904565555677 | 2.311 |
| 46.16458890182628 | 2.311 |
| 46.1701305922769 | 2.316 |
| 46.175670726908564 | 2.311 |
| 46.18120930572121 | 2.311 |
| 46.18674632871478 | 2.306 |
| 46.19228179588922 | 2.306 |
| 46.19781570724446 | 2.306 |
| 46.203348062780435 | 2.306 |
| 46.208878862497095 | 2.306 |
| 46.214408106394366 | 2.306 |
| 46.2199357944722 | 2.306 |
| 46.225461926730524 | 2.306 |
| 46.230986503169284 | 2.306 |
| 46.23650952378841 | 2.3 |
| 46.24203098858785 | 2.306 |
| 46.247550897567535 | 2.3 |
| 46.2530692507274 | 2.3 |
| 46.25858604806739 | 2.295 |
| 46.264101289587444 | 2.295 |
| 46.269614975287496 | 2.3 |
| 46.275127105167485 | 2.306 |
| 46.28063767922735 | 2.295 |
| 46.286146697467025 | 2.3 |
| 46.291654159886455 | 2.295 |
| 46.297160066485574 | 2.295 |
| 46.302664417264324 | 2.29 |
| 46.308167212222635 | 2.295 |
| 46.31366845136045 | 2.3 |
| 46.3191681346777 | 2.295 |
| 46.32466626217434 | 2.295 |
| 46.33016283385029 | 2.29 |
| 46.33565784970549 | 2.295 |
| 46.341151309739885 | 2.29 |
| 46.34664321395341 | 2.295 |
| 46.352133562346005 | 2.29 |
| 46.3576223549176 | 2.285 |
| 46.36310959166814 | 2.29 |
| 46.36859527259756 | 2.29 |
| 46.37407939770579 | 2.29 |
| 46.37956196699278 | 2.29 |
| 46.385042980458465 | 2.285 |
| 46.39052243810277 | 2.285 |
| 46.39600033992564 | 2.28 |
| 46.40147668592702 | 2.285 |
| 46.40695147610684 | 2.285 |
| 46.41242471046504 | 2.28 |
| 46.41789638900155 | 2.285 |
| 46.42336651171631 | 2.28 |
| 46.42883507860926 | 2.285 |
| 46.43430208968034 | 2.28 |
| 46.43976754492948 | 2.28 |
| 46.44523144435662 | 2.28 |
| 46.4506937879617 | 2.28 |
| 46.45615457574465 | 2.275 |
| 46.46161380770541 | 2.28 |
| 46.467071483843924 | 2.275 |
| 46.47252760416012 | 2.275 |
| 46.47798216865394 | 2.275 |
| 46.48343517732531 | 2.275 |
| 46.48888663017418 | 2.275 |
| 46.494336527200474 | 2.275 |
| 46.49978486840414 | 2.27 |
| 46.50523165378511 | 2.275 |
| 46.51067688334332 | 2.27 |
| 46.51612055707871 | 2.275 |
| 46.52156267499121 | 2.275 |
| 46.52700323708076 | 2.265 |
| 46.532442243347305 | 2.27 |
| 46.537879693790764 | 2.265 |
| 46.54331558841108 | 2.265 |
| 46.5487499272082 | 2.265 |
| 46.55418271018205 | 2.265 |
| 46.559613937332564 | 2.265 |
| 46.565043608659686 | 2.265 |
| 46.57047172416335 | 2.259 |
| 46.575898283843486 | 2.265 |
| 46.58132328770004 | 2.27 |
| 46.58674673573294 | 2.265 |
| 46.592168627942115 | 2.265 |
| 46.597588964327514 | 2.259 |
| 46.60300774488907 | 2.259 |
| 46.60842496962672 | 2.259 |
| 46.613840638540395 | 2.259 |
| 46.61925475163004 | 2.254 |
| 46.62466730889558 | 2.254 |
| 46.630078310336955 | 2.254 |
| 46.6354877559541 | 2.259 |
| 46.64089564574696 | 2.254 |
| 46.64630197971545 | 2.254 |
| 46.65170675785953 | 2.249 |
| 46.657109980179115 | 2.254 |
| 46.66251164667415 | 2.254 |
| 46.66791175734457 | 2.254 |
| 46.67331031219031 | 2.249 |
| 46.678707311211305 | 2.254 |
| 46.68410275440749 | 2.249 |
| 46.6894966417788 | 2.249 |
| 46.69488897332517 | 2.249 |
| 46.70027974904654 | 2.244 |
| 46.70566896894284 | 2.249 |
| 46.711056633014 | 2.244 |
| 46.71644274125997 | 2.244 |
| 46.72182729368067 | 2.244 |
| 46.72721029027604 | 2.249 |
| 46.73259173104602 | 2.244 |
| 46.737971615990546 | 2.244 |
| 46.74334994510954 | 2.239 |
| 46.748726718402956 | 2.244 |
| 46.754101935870715 | 2.239 |
| 46.759475597512754 | 2.239 |
| 46.76484770332901 | 2.244 |
| 46.77021825331942 | 2.239 |
| 46.77558724748391 | 2.239 |
| 46.78095468582242 | 2.239 |
| 46.786320568334894 | 2.239 |
| 46.79168489502125 | 2.234 |
| 46.79704766588143 | 2.239 |
| 46.80240888091537 | 2.239 |
| 46.80776854012301 | 2.234 |
| 46.81312664350427 | 2.239 |
| 46.818483191059094 | 2.234 |
| 46.82383818278741 | 2.234 |
| 46.829191618689165 | 2.239 |
| 46.83454349876428 | 2.234 |
| 46.839893823012694 | 2.239 |
| 46.84524259143434 | 2.234 |
| 46.850589804029156 | 2.229 |
| 46.85593546079707 | 2.229 |
| 46.86127956173802 | 2.229 |
| 46.86662210685195 | 2.234 |
| 46.87196309613878 | 2.229 |
| 46.877302529598445 | 2.229 |
| 46.88264040723088 | 2.229 |
| 46.887976729036026 | 2.229 |
| 46.89331149501381 | 2.224 |
| 46.898644705164166 | 2.229 |
| 46.90397635948703 | 2.229 |
| 46.90930645798234 | 2.224 |
| 46.914635000650016 | 2.224 |
| 46.919961987490005 | 2.224 |
| 46.925287418502236 | 2.224 |
| 46.930611293686646 | 2.229 |
| 46.93593361304316 | 2.218 |
| 46.94125437657172 | 2.229 |
| 46.94657358427226 | 2.229 |
| 46.951891236144704 | 2.224 |
| 46.95720733218899 | 2.218 |
| 46.962521872405055 | 2.224 |
| 46.96783485679283 | 2.224 |
| 46.97314628535224 | 2.218 |
| 46.97845615808323 | 2.218 |
| 46.98376447498573 | 2.218 |
| 46.98907123605968 | 2.224 |
| 46.994376441305 | 2.213 |
| 46.99968009072163 | 2.224 |
| 47.004982184309505 | 2.218 |
| 47.01028272206855 | 2.213 |
| 47.015581703998706 | 2.213 |
| 47.0208791300999 | 2.218 |
| 47.02617500037207 | 2.213 |
| 47.03146931481515 | 2.213 |
| 47.03676207342907 | 2.213 |
| 47.04205327621376 | 2.213 |
| 47.047342923169154 | 2.213 |
| 47.05263101429519 | 2.208 |
| 47.05791754959179 | 2.213 |
| 47.0632025290589 | 2.218 |
| 47.06848595269644 | 2.208 |
| 47.07376782050435 | 2.208 |
| 47.07904813248256 | 2.213 |
| 47.084326888631004 | 2.208 |
| 47.08960408894961 | 2.208 |
| 47.09487973343832 | 2.208 |
| 47.100153822097056 | 2.208 |
| 47.105426354925754 | 2.208 |
| 47.11069733192435 | 2.203 |
| 47.11596675309277 | 2.203 |
| 47.121234618430954 | 2.203 |
| 47.12650092793883 | 2.203 |
| 47.13176568161633 | 2.208 |
| 47.13702887946339 | 2.203 |
| 47.14229052147993 | 2.208 |
| 47.14755060766589 | 2.208 |
| 47.152809138021205 | 2.203 |
| 47.158066112545804 | 2.203 |
| 47.16332153123962 | 2.203 |
| 47.168575394102575 | 2.203 |
| 47.17382770113461 | 2.198 |
| 47.17907845233566 | 2.198 |
| 47.18432764770565 | 2.203 |
| 47.189575287244516 | 2.203 |
| 47.194821370952184 | 2.198 |
| 47.20006589882859 | 2.198 |
| 47.205308870873665 | 2.198 |
| 47.210550287087344 | 2.198 |
| 47.215790147469555 | 2.203 |
| 47.22102845202023 | 2.198 |
| 47.22626520073929 | 2.198 |
| 47.23150039362668 | 2.198 |
| 47.236734030682335 | 2.193 |
| 47.24196611190617 | 2.203 |
| 47.24719663729813 | 2.193 |
| 47.25242560685814 | 2.198 |
| 47.25765302058613 | 2.193 |
| 47.262878878482034 | 2.193 |
| 47.26810318054578 | 2.203 |
| 47.273325926777304 | 2.198 |
| 47.27854711717654 | 2.193 |
| 47.2837667517434 | 2.193 |
| 47.28898483047784 | 2.193 |
| 47.29420135337977 | 2.193 |
| 47.29941632044913 | 2.193 |
| 47.30462973168586 | 2.193 |
| 47.30984158708987 | 2.188 |
| 47.31505188666111 | 2.193 |
| 47.320260630399495 | 2.193 |
| 47.325467818304965 | 2.193 |
| 47.330673450377446 | 2.188 |
| 47.335877526616876 | 2.188 |
| 47.341080047023176 | 2.188 |
| 47.34628101159628 | 2.183 |
| 47.351480420336124 | 2.193 |
| 47.356678273242636 | 2.188 |
| 47.36187457031574 | 2.183 |
| 47.367069311555376 | 2.183 |
| 47.37226249696146 | 2.183 |
| 47.377454126533934 | 2.183 |
| 47.38264420027272 | 2.183 |
| 47.38783271817776 | 2.183 |
| 47.393019680248976 | 2.183 |
| 47.3982050864863 | 2.183 |
| 47.403388936889655 | 2.183 |
| 47.40857123145898 | 2.183 |
| 47.4137519701942 | 2.183 |
| 47.418931153095244 | 2.188 |
| 47.42410878016205 | 2.177 |
| 47.42928485139454 | 2.177 |
| 47.434459366792645 | 2.183 |
| 47.439632326356296 | 2.177 |
| 47.444803730085425 | 2.183 |
| 47.449973577979954 | 2.172 |
| 47.45514187003982 | 2.183 |
| 47.460308606264945 | 2.172 |
| 47.46547378665527 | 2.177 |
| 47.47063741121071 | 2.172 |
| 47.475799479931204 | 2.172 |
| 47.480959992816686 | 2.172 |
| 47.48611894986708 | 2.172 |
| 47.491276351082305 | 2.172 |
| 47.4964321964623 | 2.177 |
| 47.501586486007 | 2.172 |
| 47.50673921971632 | 2.172 |
| 47.5118903975902 | 2.172 |
| 47.51704001962857 | 2.177 |
| 47.522188085831345 | 2.172 |
| 47.52733459619847 | 2.172 |
| 47.53247955072987 | 2.172 |
| 47.53762294942546 | 2.167 |
| 47.54276479228519 | 2.177 |
| 47.547905079308975 | 2.167 |
| 47.553043810496746 | 2.167 |
| 47.55818098584844 | 2.172 |
| 47.56331660536397 | 2.172 |
| 47.56845066904328 | 2.167 |
| 47.57358317688629 | 2.167 |
| 47.578714128892926 | 2.172 |
| 47.58384352506312 | 2.167 |
| 47.58897136539681 | 2.172 |
| 47.59409764989391 | 2.172 |
| 47.59922237855436 | 2.167 |
| 47.604345551378074 | 2.162 |
| 47.60946716836499 | 2.172 |
| 47.614587229515045 | 2.162 |
| 47.61970573482815 | 2.167 |
| 47.62482268430424 | 2.162 |
| 47.629938077943244 | 2.162 |
| 47.63505191574509 | 2.162 |
| 47.6401641977097 | 2.162 |
| 47.645274923837015 | 2.162 |
| 47.65038409412695 | 2.162 |
| 47.65549170857944 | 2.162 |
| 47.66059776719441 | 2.162 |
| 47.66570226997179 | 2.162 |
| 47.6708052169115 | 2.162 |
| 47.675906608013484 | 2.162 |
| 47.68100644327765 | 2.157 |
| 47.686104722703945 | 2.157 |
| 47.69120144629228 | 2.152 |
| 47.696296614042595 | 2.152 |
| 47.70139022595481 | 2.152 |
| 47.70648228202885 | 2.157 |
| 47.71157278226465 | 2.152 |
| 47.71666172666214 | 2.162 |
| 47.721749115221236 | 2.152 |
| 47.72683494794187 | 2.157 |
| 47.73191922482397 | 2.152 |
| 47.73700194586746 | 2.157 |
| 47.742083111072276 | 2.152 |
| 47.74716272043833 | 2.152 |
| 47.75224077396557 | 2.157 |
| 47.7573172716539 | 2.152 |
| 47.76239221350327 | 2.152 |
| 47.767465599513585 | 2.157 |
| 47.77253742968478 | 2.147 |
| 47.77760770401679 | 2.157 |
| 47.78267642250953 | 2.152 |
| 47.787743585162936 | 2.152 |
| 47.79280919197693 | 2.147 |
| 47.79787324295144 | 2.147 |
| 47.80293573808639 | 2.152 |
| 47.80799667738171 | 2.152 |
| 47.81305606083732 | 2.147 |
| 47.818113888453155 | 2.152 |
| 47.82317016022914 | 2.147 |
| 47.828224876165194 | 2.152 |
| 47.83327803626125 | 2.141 |
| 47.83832964051723 | 2.152 |
| 47.84337968893306 | 2.147 |
| 47.84842818150867 | 2.141 |
| 47.85347511824399 | 2.152 |
| 47.85852049913894 | 2.141 |
| 47.86356432419345 | 2.141 |
| 47.868606593407435 | 2.141 |
| 47.87364730678083 | 2.147 |
| 47.87868646431357 | 2.141 |
| 47.88372406600556 | 2.147 |
| 47.88876011185674 | 2.141 |
| 47.893794601867036 | 2.147 |
| 47.898827536036364 | 2.141 |
| 47.90385891436466 | 2.136 |
| 47.90888873685184 | 2.141 |
| 47.91391700349784 | 2.136 |
| 47.918943714302586 | 2.141 |
| 47.92396886926599 | 2.136 |
| 47.92899246838799 | 2.136 |
| 47.9340145116685 | 2.136 |
| 47.939034999107456 | 2.136 |
| 47.944053930704776 | 2.136 |
| 47.94907130646039 | 2.141 |
| 47.95408712637422 | 2.136 |
| 47.95910139044619 | 2.141 |
| 47.964114098676234 | 2.136 |
| 47.96912525106427 | 2.136 |
| 47.97413484761022 | 2.136 |
| 47.97914288831402 | 2.136 |
| 47.98414937317559 | 2.131 |
| 47.98915430219485 | 2.131 |
| 47.994157675371724 | 2.136 |
| 47.99915949270614 | 2.136 |
| 48.00415975419803 | 2.131 |
| 48.009158459847306 | 2.131 |
| 48.0141556096539 | 2.136 |
| 48.01915120361773 | 2.131 |
| 48.02414524173873 | 2.136 |
| 48.02913772401682 | 2.131 |
| 48.034128650451926 | 2.136 |
| 48.03911802104397 | 2.136 |
| 48.04410583579288 | 2.131 |
| 48.04909209469857 | 2.131 |
| 48.05407679776098 | 2.131 |
| 48.05905994498002 | 2.126 |
| 48.064041536355624 | 2.131 |
| 48.06902157188771 | 2.126 |
| 48.074000051576206 | 2.131 |
| 48.078976975421035 | 2.131 |
| 48.08395234342212 | 2.131 |
| 48.08892615557939 | 2.131 |
| 48.09389841189275 | 2.126 |
| 48.09886911236215 | 2.126 |
| 48.1038382569875 | 2.126 |
| 48.10880584576873 | 2.126 |
| 48.113771878705755 | 2.131 |
| 48.118736355798504 | 2.121 |
| 48.123699277046896 | 2.131 |
| 48.12866064245086 | 2.121 |
| 48.13362045201032 | 2.126 |
| 48.138578705725195 | 2.126 |
| 48.14353540359541 | 2.126 |
| 48.14849054562089 | 2.126 |
| 48.15344413180155 | 2.121 |
| 48.15839616213732 | 2.121 |
| 48.163346636628134 | 2.126 |
| 48.1682955552739 | 2.121 |
| 48.17324291807454 | 2.126 |
| 48.17818872502999 | 2.121 |
| 48.183132976140165 | 2.121 |
| 48.18807567140499 | 2.121 |
| 48.19301681082438 | 2.121 |
| 48.19795639439827 | 2.116 |
| 48.202894422126576 | 2.116 |
| 48.20783089400922 | 2.121 |
| 48.21276581004613 | 2.126 |
| 48.217699170237225 | 2.116 |
| 48.22263097458243 | 2.121 |
| 48.227561223081665 | 2.116 |
| 48.23248991573485 | 2.116 |
| 48.237417052541915 | 2.121 |
| 48.24234263350278 | 2.121 |
| 48.24726665861736 | 2.121 |
| 48.252189127885586 | 2.116 |
| 48.25711004130738 | 2.116 |
| 48.26202939888266 | 2.121 |
| 48.26694720061135 | 2.111 |
| 48.27186344649337 | 2.111 |
| 48.27677813652865 | 2.116 |
| 48.2816912707171 | 2.111 |
| 48.286602849058646 | 2.116 |
| 48.291512871553216 | 2.121 |
| 48.29642133820073 | 2.111 |
| 48.3013282490011 | 2.111 |
| 48.30623360395426 | 2.111 |
| 48.31113740306013 | 2.116 |
| 48.31603964631863 | 2.116 |
| 48.32094033372967 | 2.111 |
| 48.32583946529319 | 2.111 |
| 48.33073704100911 | 2.111 |
| 48.335633060877335 | 2.106 |
| 48.3405275248978 | 2.111 |
| 48.34542043307042 | 2.111 |
| 48.35031178539513 | 2.111 |
| 48.35520158187183 | 2.111 |
| 48.360089822500456 | 2.106 |
| 48.36497650728092 | 2.106 |
| 48.36986163621315 | 2.106 |
| 48.37474520929707 | 2.111 |
| 48.37962722653259 | 2.106 |
| 48.384507687919644 | 2.106 |
| 48.38938659345814 | 2.111 |
| 48.39426394314801 | 2.111 |
| 48.39913973698917 | 2.106 |
| 48.40401397498154 | 2.106 |
| 48.40888665712504 | 2.106 |
| 48.41375778341959 | 2.106 |
| 48.41862735386512 | 2.101 |
| 48.42349536846154 | 2.106 |
| 48.42836182720877 | 2.106 |
| 48.43322673010673 | 2.101 |
| 48.43809007715535 | 2.106 |
| 48.44295186835455 | 2.101 |
| 48.447812103704244 | 2.101 |
| 48.452670783204354 | 2.106 |
| 48.4575279068548 | 2.101 |
| 48.4623834746555 | 2.106 |
| 48.46723748660638 | 2.101 |
| 48.472089942707356 | 2.101 |
| 48.47694084295835 | 2.106 |
| 48.48179018735928 | 2.101 |
| 48.486637975910064 | 2.101 |
| 48.49148420861062 | 2.101 |
| 48.496328885460876 | 2.101 |
| 48.50117200646075 | 2.101 |
| 48.506013571610154 | 2.106 |
| 48.510853580909014 | 2.106 |
| 48.51569203435725 | 2.101 |
| 48.520528931954786 | 2.101 |
| 48.525364273701534 | 2.101 |
| 48.53019805959742 | 2.095 |
| 48.53503028964235 | 2.095 |
| 48.539860963836254 | 2.101 |
| 48.54469008217905 | 2.101 |
| 48.54951764467066 | 2.095 |
| 48.554343651310994 | 2.095 |
| 48.55916810209998 | 2.095 |
| 48.563990997037536 | 2.095 |
| 48.56881233612358 | 2.095 |
| 48.573632119358024 | 2.09 |
| 48.578450346740794 | 2.095 |
| 48.58326701827181 | 2.09 |
| 48.58808213395099 | 2.09 |
| 48.59289569377825 | 2.09 |
| 48.59770769775351 | 2.09 |
| 48.602518145876694 | 2.09 |
| 48.607327038147716 | 2.09 |
| 48.612134374566494 | 2.09 |
| 48.616940155132944 | 2.085 |
| 48.62174437984699 | 2.09 |
| 48.626547048708545 | 2.09 |
| 48.63134816171753 | 2.095 |
| 48.636147718873865 | 2.085 |
| 48.64094572017746 | 2.09 |
| 48.64574216562825 | 2.085 |
| 48.65053705522614 | 2.085 |
| 48.655330388971045 | 2.085 |
| 48.66012216686289 | 2.085 |
| 48.6649123889016 | 2.085 |
| 48.66970105508708 | 2.09 |
| 48.674488165419255 | 2.085 |
| 48.67927371989804 | 2.09 |
| 48.684057718523356 | 2.085 |
| 48.68884016129511 | 2.085 |
| 48.69362104821323 | 2.085 |
| 48.698400379277636 | 2.085 |
| 48.70317815448824 | 2.09 |
| 48.70795437384496 | 2.085 |
| 48.712729037347714 | 2.085 |
| 48.717502144996416 | 2.085 |
| 48.72227369679099 | 2.085 |
| 48.72704369273135 | 2.085 |
| 48.73181213281741 | 2.08 |
| 48.736579017049095 | 2.08 |
| 48.74134434542631 | 2.08 |
| 48.746108117948985 | 2.08 |
| 48.750870334617034 | 2.08 |
| 48.755630995430366 | 2.08 |
| 48.7603901003889 | 2.08 |
| 48.76514764949257 | 2.085 |
| 48.76990364274127 | 2.08 |
| 48.77465808013493 | 2.085 |
| 48.779410961673456 | 2.08 |
| 48.78416228735678 | 2.085 |
| 48.7889120571848 | 2.085 |
| 48.79366027115745 | 2.08 |
| 48.798406929274634 | 2.08 |
| 48.80315203153628 | 2.08 |
| 48.80789557794229 | 2.085 |
| 48.81263756849259 | 2.08 |
| 48.817378003187095 | 2.085 |
| 48.822116882025725 | 2.075 |
| 48.82685420500839 | 2.08 |
| 48.831589972135006 | 2.075 |
| 48.83632418340549 | 2.075 |
| 48.84105683881975 | 2.075 |
| 48.845787938377725 | 2.075 |
| 48.85051748207931 | 2.075 |
| 48.85524546992443 | 2.075 |
| 48.85997190191299 | 2.075 |
| 48.86469677804492 | 2.075 |
| 48.869420098320134 | 2.075 |
| 48.87414186273854 | 2.08 |
| 48.878862071300055 | 2.08 |
| 48.883580724004595 | 2.08 |
| 48.888297820852074 | 2.075 |
| 48.893013361842414 | 2.075 |
| 48.89772734697552 | 2.075 |
| 48.90243977625132 | 2.075 |
| 48.907150649669724 | 2.07 |
| 48.91185996723064 | 2.075 |
| 48.91656772893399 | 2.07 |
| 48.92127393477969 | 2.07 |
| 48.925978584767655 | 2.07 |
| 48.9306816788978 | 2.07 |
| 48.93538321717003 | 2.07 |
| 48.940083199584265 | 2.07 |
| 48.944781626140426 | 2.07 |
| 48.949478496838424 | 2.07 |
| 48.954173811678174 | 2.07 |
| 48.95886757065959 | 2.07 |
| 48.96355977378259 | 2.075 |
| 48.96825042104708 | 2.07 |
| 48.97293951245298 | 2.07 |
| 48.97762704800021 | 2.07 |
| 48.98231302768867 | 2.065 |
| 48.986997451518285 | 2.07 |
| 48.991680319488964 | 2.065 |
| 48.99636163160063 | 2.065 |
| 49.001041387853185 | 2.065 |
| 49.00571958824655 | 2.065 |
| 49.010396232780636 | 2.07 |
| 49.01507132145536 | 2.07 |
| 49.019744854270634 | 2.07 |
| 49.024416831226375 | 2.07 |
| 49.02908725232249 | 2.07 |
| 49.0337561175589 | 2.065 |
| 49.038423426935516 | 2.065 |
| 49.04308918045225 | 2.07 |
| 49.047753378109014 | 2.07 |
| 49.05241601990573 | 2.065 |
| 49.057077105842296 | 2.065 |
| 49.06173663591864 | 2.06 |
| 49.06639461013467 | 2.06 |
| 49.0710510284903 | 2.06 |
| 49.07570589098544 | 2.06 |
| 49.080359197620005 | 2.06 |
| 49.08501094839391 | 2.06 |
| 49.08966114330706 | 2.06 |
| 49.09430978235938 | 2.065 |
| 49.098956865550775 | 2.06 |
| 49.10360239288116 | 2.06 |
| 49.10824636435044 | 2.06 |
| 49.112888779958546 | 2.06 |
| 49.117529639705374 | 2.06 |
| 49.12216894359084 | 2.06 |
| 49.12680669161487 | 2.06 |
| 49.13144288377735 | 2.06 |
| 49.13607752007822 | 2.054 |
| 49.14071060051737 | 2.06 |
| 49.14534212509473 | 2.06 |
| 49.1499720938102 | 2.06 |
| 49.1546005066637 | 2.06 |
| 49.159227363655134 | 2.065 |
| 49.16385266478442 | 2.065 |
| 49.168476410051476 | 2.06 |
| 49.1730985994562 | 2.06 |
| 49.17771923299851 | 2.06 |
| 49.182338310678325 | 2.06 |
| 49.18695583249555 | 2.054 |
| 49.19157179845009 | 2.065 |
| 49.19618620854187 | 2.06 |
| 49.20079906277079 | 2.054 |
| 49.20541036113677 | 2.054 |
| 49.210020103639714 | 2.054 |
| 49.214628290279535 | 2.054 |
| 49.21923492105615 | 2.054 |
| 49.22383999596946 | 2.054 |
| 49.22844351501939 | 2.054 |
| 49.233045478205845 | 2.054 |
| 49.237645885528735 | 2.049 |
| 49.24224473698797 | 2.049 |
| 49.246842032583466 | 2.054 |
| 49.25143777231513 | 2.06 |
| 49.256031956182866 | 2.054 |
| 49.260624584186594 | 2.049 |
| 49.26521565632623 | 2.049 |
| 49.269805172601664 | 2.049 |
| 49.27439313301283 | 2.054 |
| 49.27897953755962 | 2.049 |
| 49.283564386241956 | 2.054 |
| 49.28814767905975 | 2.049 |
| 49.292729416012904 | 2.049 |
| 49.29730959710133 | 2.049 |
| 49.30188822232494 | 2.049 |
| 49.306465291683644 | 2.044 |
| 49.311040805177356 | 2.049 |
| 49.31561476280598 | 2.044 |
| 49.320187164569425 | 2.044 |
| 49.32475801046761 | 2.044 |
| 49.32932730050044 | 2.044 |
| 49.33389503466782 | 2.054 |
| 49.33846121296966 | 2.049 |
| 49.34302583540588 | 2.044 |
| 49.34758890197638 | 2.044 |
| 49.35215041268107 | 2.049 |
| 49.35671036751987 | 2.049 |
| 49.36126876649267 | 2.044 |